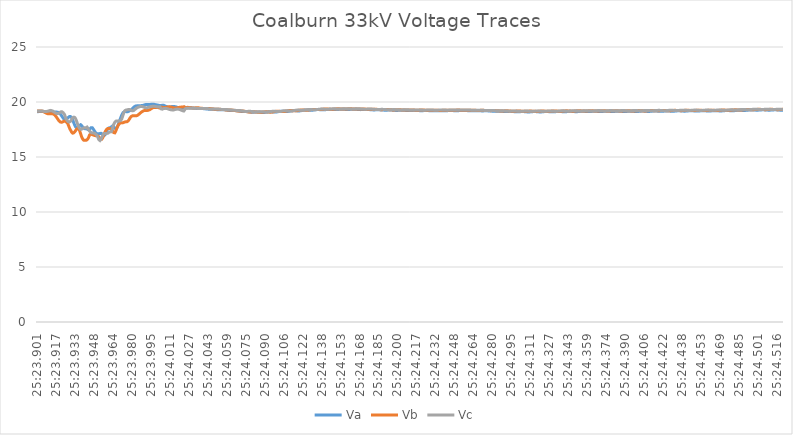
| Category | Va | Vb | Vc |
|---|---|---|---|
| 0.6426377430555555 | 19.121 | 19.184 | 19.178 |
| 0.6426377430555555 | 19.122 | 19.184 | 19.177 |
| 0.6426377430555555 | 19.122 | 19.184 | 19.177 |
| 0.6426377430555555 | 19.123 | 19.184 | 19.176 |
| 0.6426377546296297 | 19.124 | 19.184 | 19.176 |
| 0.6426377546296297 | 19.124 | 19.184 | 19.175 |
| 0.6426377546296297 | 19.124 | 19.184 | 19.175 |
| 0.6426377546296297 | 19.125 | 19.183 | 19.175 |
| 0.6426377546296297 | 19.125 | 19.183 | 19.174 |
| 0.6426377546296297 | 19.125 | 19.183 | 19.174 |
| 0.6426377662037037 | 19.126 | 19.182 | 19.174 |
| 0.6426377662037037 | 19.126 | 19.182 | 19.174 |
| 0.6426377662037037 | 19.127 | 19.182 | 19.174 |
| 0.6426377662037037 | 19.127 | 19.181 | 19.174 |
| 0.6426377662037037 | 19.128 | 19.181 | 19.174 |
| 0.6426377662037037 | 19.128 | 19.18 | 19.174 |
| 0.6426377662037037 | 19.128 | 19.18 | 19.174 |
| 0.6426377777777778 | 19.129 | 19.179 | 19.175 |
| 0.6426377777777778 | 19.129 | 19.179 | 19.175 |
| 0.6426377777777778 | 19.13 | 19.178 | 19.176 |
| 0.6426377777777778 | 19.13 | 19.178 | 19.176 |
| 0.6426377777777778 | 19.13 | 19.177 | 19.176 |
| 0.6426377777777778 | 19.13 | 19.176 | 19.177 |
| 0.6426377893518519 | 19.13 | 19.176 | 19.178 |
| 0.6426377893518519 | 19.13 | 19.176 | 19.178 |
| 0.6426377893518519 | 19.13 | 19.175 | 19.178 |
| 0.6426377893518519 | 19.13 | 19.175 | 19.179 |
| 0.6426377893518519 | 19.13 | 19.174 | 19.179 |
| 0.6426377893518519 | 19.129 | 19.172 | 19.178 |
| 0.6426377893518519 | 19.129 | 19.167 | 19.175 |
| 0.6426378009259259 | 19.129 | 19.161 | 19.172 |
| 0.6426378009259259 | 19.129 | 19.153 | 19.167 |
| 0.6426378009259259 | 19.128 | 19.144 | 19.162 |
| 0.6426378009259259 | 19.127 | 19.134 | 19.158 |
| 0.6426378009259259 | 19.127 | 19.122 | 19.152 |
| 0.6426378009259259 | 19.126 | 19.111 | 19.147 |
| 0.6426378125 | 19.125 | 19.1 | 19.143 |
| 0.6426378125 | 19.125 | 19.089 | 19.14 |
| 0.6426378125 | 19.124 | 19.079 | 19.136 |
| 0.6426378125 | 19.123 | 19.07 | 19.134 |
| 0.6426378125 | 19.122 | 19.062 | 19.132 |
| 0.6426378125 | 19.122 | 19.055 | 19.131 |
| 0.6426378240740741 | 19.121 | 19.048 | 19.13 |
| 0.6426378240740741 | 19.12 | 19.04 | 19.129 |
| 0.6426378240740741 | 19.119 | 19.031 | 19.129 |
| 0.6426378240740741 | 19.118 | 19.022 | 19.129 |
| 0.6426378240740741 | 19.117 | 19.013 | 19.13 |
| 0.6426378240740741 | 19.116 | 19.003 | 19.131 |
| 0.6426378240740741 | 19.115 | 18.993 | 19.133 |
| 0.6426378356481481 | 19.114 | 18.983 | 19.136 |
| 0.6426378356481481 | 19.113 | 18.974 | 19.139 |
| 0.6426378356481481 | 19.113 | 18.965 | 19.143 |
| 0.6426378356481481 | 19.114 | 18.957 | 19.147 |
| 0.6426378356481481 | 19.114 | 18.951 | 19.152 |
| 0.6426378356481481 | 19.115 | 18.946 | 19.156 |
| 0.6426378472222222 | 19.114 | 18.941 | 19.159 |
| 0.6426378472222222 | 19.114 | 18.938 | 19.163 |
| 0.6426378472222222 | 19.116 | 18.935 | 19.167 |
| 0.6426378472222222 | 19.117 | 18.933 | 19.171 |
| 0.6426378472222222 | 19.117 | 18.93 | 19.176 |
| 0.6426378472222222 | 19.116 | 18.928 | 19.181 |
| 0.6426378472222222 | 19.116 | 18.926 | 19.186 |
| 0.6426378587962963 | 19.115 | 18.924 | 19.192 |
| 0.6426378587962963 | 19.115 | 18.923 | 19.198 |
| 0.6426378587962963 | 19.113 | 18.922 | 19.204 |
| 0.6426378587962963 | 19.112 | 18.921 | 19.211 |
| 0.6426378587962963 | 19.11 | 18.921 | 19.218 |
| 0.6426378587962963 | 19.109 | 18.922 | 19.223 |
| 0.6426378703703703 | 19.108 | 18.922 | 19.228 |
| 0.6426378703703703 | 19.106 | 18.923 | 19.232 |
| 0.6426378703703703 | 19.105 | 18.924 | 19.235 |
| 0.6426378703703703 | 19.104 | 18.925 | 19.236 |
| 0.6426378703703703 | 19.101 | 18.926 | 19.237 |
| 0.6426378703703703 | 19.099 | 18.927 | 19.236 |
| 0.6426378819444444 | 19.097 | 18.927 | 19.234 |
| 0.6426378819444444 | 19.095 | 18.928 | 19.231 |
| 0.6426378819444444 | 19.092 | 18.928 | 19.227 |
| 0.6426378819444444 | 19.089 | 18.928 | 19.221 |
| 0.6426378819444444 | 19.087 | 18.928 | 19.215 |
| 0.6426378819444444 | 19.084 | 18.928 | 19.21 |
| 0.6426378819444444 | 19.082 | 18.927 | 19.203 |
| 0.6426378935185185 | 19.08 | 18.926 | 19.195 |
| 0.6426378935185185 | 19.078 | 18.925 | 19.187 |
| 0.6426378935185185 | 19.077 | 18.922 | 19.179 |
| 0.6426378935185185 | 19.076 | 18.919 | 19.17 |
| 0.6426378935185185 | 19.075 | 18.915 | 19.16 |
| 0.6426378935185185 | 19.075 | 18.909 | 19.149 |
| 0.6426379050925927 | 19.075 | 18.902 | 19.138 |
| 0.6426379050925927 | 19.075 | 18.894 | 19.126 |
| 0.6426379050925927 | 19.075 | 18.885 | 19.114 |
| 0.6426379050925927 | 19.076 | 18.874 | 19.101 |
| 0.6426379050925927 | 19.077 | 18.861 | 19.087 |
| 0.6426379050925927 | 19.078 | 18.847 | 19.074 |
| 0.6426379050925927 | 19.079 | 18.832 | 19.061 |
| 0.6426379166666667 | 19.079 | 18.816 | 19.048 |
| 0.6426379166666667 | 19.081 | 18.798 | 19.035 |
| 0.6426379166666667 | 19.082 | 18.78 | 19.023 |
| 0.6426379166666667 | 19.082 | 18.76 | 19.011 |
| 0.6426379166666667 | 19.083 | 18.74 | 19 |
| 0.6426379166666667 | 19.083 | 18.719 | 18.99 |
| 0.6426379282407407 | 19.084 | 18.697 | 18.981 |
| 0.6426379282407407 | 19.084 | 18.675 | 18.973 |
| 0.6426379282407407 | 19.084 | 18.652 | 18.965 |
| 0.6426379282407407 | 19.083 | 18.628 | 18.959 |
| 0.6426379282407407 | 19.083 | 18.604 | 18.954 |
| 0.6426379282407407 | 19.082 | 18.58 | 18.949 |
| 0.6426379398148149 | 19.082 | 18.555 | 18.946 |
| 0.6426379398148149 | 19.08 | 18.529 | 18.945 |
| 0.6426379398148149 | 19.079 | 18.502 | 18.944 |
| 0.6426379398148149 | 19.076 | 18.475 | 18.946 |
| 0.6426379398148149 | 19.073 | 18.448 | 18.949 |
| 0.6426379398148149 | 19.069 | 18.421 | 18.953 |
| 0.6426379398148149 | 19.064 | 18.396 | 18.958 |
| 0.6426379513888889 | 19.058 | 18.371 | 18.965 |
| 0.6426379513888889 | 19.051 | 18.347 | 18.972 |
| 0.6426379513888889 | 19.042 | 18.325 | 18.981 |
| 0.6426379513888889 | 19.032 | 18.303 | 18.989 |
| 0.6426379513888889 | 19.02 | 18.283 | 18.999 |
| 0.6426379513888889 | 19.006 | 18.264 | 19.008 |
| 0.6426379629629629 | 18.991 | 18.247 | 19.017 |
| 0.6426379629629629 | 18.976 | 18.23 | 19.028 |
| 0.6426379629629629 | 18.959 | 18.215 | 19.039 |
| 0.6426379629629629 | 18.942 | 18.201 | 19.052 |
| 0.6426379629629629 | 18.923 | 18.188 | 19.065 |
| 0.6426379629629629 | 18.903 | 18.178 | 19.077 |
| 0.6426379629629629 | 18.882 | 18.169 | 19.09 |
| 0.6426379745370371 | 18.861 | 18.163 | 19.103 |
| 0.6426379745370371 | 18.838 | 18.159 | 19.113 |
| 0.6426379745370371 | 18.814 | 18.156 | 19.12 |
| 0.6426379745370371 | 18.789 | 18.156 | 19.125 |
| 0.6426379745370371 | 18.762 | 18.157 | 19.125 |
| 0.6426379745370371 | 18.734 | 18.16 | 19.123 |
| 0.6426379861111111 | 18.707 | 18.164 | 19.117 |
| 0.6426379861111111 | 18.679 | 18.169 | 19.108 |
| 0.6426379861111111 | 18.652 | 18.175 | 19.097 |
| 0.6426379861111111 | 18.625 | 18.183 | 19.084 |
| 0.6426379861111111 | 18.6 | 18.191 | 19.071 |
| 0.6426379861111111 | 18.576 | 18.2 | 19.056 |
| 0.6426379976851851 | 18.553 | 18.209 | 19.04 |
| 0.6426379976851851 | 18.533 | 18.219 | 19.024 |
| 0.6426379976851851 | 18.514 | 18.229 | 19.008 |
| 0.6426379976851851 | 18.497 | 18.24 | 18.992 |
| 0.6426379976851851 | 18.482 | 18.25 | 18.974 |
| 0.6426379976851851 | 18.468 | 18.259 | 18.951 |
| 0.6426379976851851 | 18.455 | 18.265 | 18.924 |
| 0.6426380092592593 | 18.444 | 18.269 | 18.891 |
| 0.6426380092592593 | 18.434 | 18.27 | 18.854 |
| 0.6426380092592593 | 18.427 | 18.269 | 18.813 |
| 0.6426380092592593 | 18.422 | 18.265 | 18.768 |
| 0.6426380092592593 | 18.419 | 18.259 | 18.72 |
| 0.6426380092592593 | 18.419 | 18.249 | 18.671 |
| 0.6426380208333333 | 18.421 | 18.239 | 18.623 |
| 0.6426380208333333 | 18.425 | 18.226 | 18.576 |
| 0.6426380208333333 | 18.432 | 18.214 | 18.531 |
| 0.6426380208333333 | 18.44 | 18.2 | 18.489 |
| 0.6426380208333333 | 18.45 | 18.187 | 18.451 |
| 0.6426380208333333 | 18.46 | 18.176 | 18.419 |
| 0.6426380208333333 | 18.47 | 18.165 | 18.391 |
| 0.6426380324074074 | 18.481 | 18.153 | 18.366 |
| 0.6426380324074074 | 18.491 | 18.137 | 18.342 |
| 0.6426380324074074 | 18.501 | 18.119 | 18.32 |
| 0.6426380324074074 | 18.512 | 18.097 | 18.298 |
| 0.6426380324074074 | 18.524 | 18.072 | 18.277 |
| 0.6426380324074074 | 18.538 | 18.043 | 18.256 |
| 0.6426380439814815 | 18.553 | 18.008 | 18.237 |
| 0.6426380439814815 | 18.569 | 17.97 | 18.219 |
| 0.6426380439814815 | 18.587 | 17.928 | 18.204 |
| 0.6426380439814815 | 18.605 | 17.884 | 18.193 |
| 0.6426380439814815 | 18.622 | 17.837 | 18.184 |
| 0.6426380439814815 | 18.639 | 17.789 | 18.18 |
| 0.6426380555555555 | 18.654 | 17.743 | 18.178 |
| 0.6426380555555555 | 18.667 | 17.699 | 18.18 |
| 0.6426380555555555 | 18.676 | 17.657 | 18.185 |
| 0.6426380555555555 | 18.682 | 17.619 | 18.192 |
| 0.6426380555555555 | 18.686 | 17.583 | 18.2 |
| 0.6426380555555555 | 18.686 | 17.549 | 18.21 |
| 0.6426380555555555 | 18.683 | 17.516 | 18.222 |
| 0.6426380671296296 | 18.679 | 17.484 | 18.235 |
| 0.6426380671296296 | 18.672 | 17.452 | 18.251 |
| 0.6426380671296296 | 18.664 | 17.42 | 18.269 |
| 0.6426380671296296 | 18.652 | 17.387 | 18.29 |
| 0.6426380671296296 | 18.637 | 17.355 | 18.314 |
| 0.6426380671296296 | 18.62 | 17.322 | 18.342 |
| 0.6426380787037037 | 18.6 | 17.29 | 18.373 |
| 0.6426380787037037 | 18.578 | 17.261 | 18.407 |
| 0.6426380787037037 | 18.551 | 17.235 | 18.441 |
| 0.6426380787037037 | 18.519 | 17.212 | 18.474 |
| 0.6426380787037037 | 18.484 | 17.194 | 18.504 |
| 0.6426380787037037 | 18.446 | 17.18 | 18.532 |
| 0.6426380787037037 | 18.404 | 17.17 | 18.556 |
| 0.6426380902777779 | 18.359 | 17.165 | 18.576 |
| 0.6426380902777779 | 18.312 | 17.163 | 18.592 |
| 0.6426380902777779 | 18.264 | 17.165 | 18.605 |
| 0.6426380902777779 | 18.217 | 17.171 | 18.614 |
| 0.6426380902777779 | 18.169 | 17.18 | 18.62 |
| 0.6426380902777779 | 18.123 | 17.191 | 18.624 |
| 0.6426381018518519 | 18.078 | 17.205 | 18.625 |
| 0.6426381018518519 | 18.034 | 17.222 | 18.624 |
| 0.6426381018518519 | 17.992 | 17.241 | 18.622 |
| 0.6426381018518519 | 17.953 | 17.261 | 18.616 |
| 0.6426381018518519 | 17.914 | 17.282 | 18.605 |
| 0.6426381018518519 | 17.877 | 17.303 | 18.59 |
| 0.6426381134259259 | 17.842 | 17.326 | 18.571 |
| 0.6426381134259259 | 17.807 | 17.35 | 18.548 |
| 0.6426381134259259 | 17.775 | 17.374 | 18.52 |
| 0.6426381134259259 | 17.746 | 17.4 | 18.488 |
| 0.6426381134259259 | 17.719 | 17.425 | 18.451 |
| 0.6426381134259259 | 17.695 | 17.451 | 18.411 |
| 0.6426381134259259 | 17.676 | 17.476 | 18.367 |
| 0.6426381250000001 | 17.66 | 17.5 | 18.321 |
| 0.6426381250000001 | 17.649 | 17.522 | 18.273 |
| 0.6426381250000001 | 17.642 | 17.543 | 18.224 |
| 0.6426381250000001 | 17.638 | 17.561 | 18.175 |
| 0.6426381250000001 | 17.639 | 17.577 | 18.126 |
| 0.6426381250000001 | 17.643 | 17.59 | 18.078 |
| 0.6426381365740741 | 17.651 | 17.599 | 18.03 |
| 0.6426381365740741 | 17.662 | 17.604 | 17.983 |
| 0.6426381365740741 | 17.675 | 17.605 | 17.938 |
| 0.6426381365740741 | 17.69 | 17.601 | 17.894 |
| 0.6426381365740741 | 17.708 | 17.593 | 17.851 |
| 0.6426381365740741 | 17.726 | 17.58 | 17.809 |
| 0.6426381365740741 | 17.747 | 17.563 | 17.77 |
| 0.6426381481481481 | 17.768 | 17.542 | 17.732 |
| 0.6426381481481481 | 17.79 | 17.517 | 17.696 |
| 0.6426381481481481 | 17.813 | 17.486 | 17.662 |
| 0.6426381481481481 | 17.836 | 17.449 | 17.63 |
| 0.6426381481481481 | 17.859 | 17.409 | 17.602 |
| 0.6426381481481481 | 17.881 | 17.366 | 17.577 |
| 0.6426381597222223 | 17.899 | 17.318 | 17.557 |
| 0.6426381597222223 | 17.914 | 17.267 | 17.541 |
| 0.6426381597222223 | 17.925 | 17.213 | 17.528 |
| 0.6426381597222223 | 17.932 | 17.158 | 17.52 |
| 0.6426381597222223 | 17.934 | 17.102 | 17.515 |
| 0.6426381597222223 | 17.931 | 17.047 | 17.514 |
| 0.6426381712962963 | 17.923 | 16.993 | 17.516 |
| 0.6426381712962963 | 17.91 | 16.94 | 17.519 |
| 0.6426381712962963 | 17.892 | 16.891 | 17.525 |
| 0.6426381712962963 | 17.871 | 16.844 | 17.531 |
| 0.6426381712962963 | 17.846 | 16.801 | 17.538 |
| 0.6426381712962963 | 17.819 | 16.76 | 17.546 |
| 0.6426381712962963 | 17.79 | 16.722 | 17.554 |
| 0.6426381828703703 | 17.76 | 16.687 | 17.563 |
| 0.6426381828703703 | 17.731 | 16.656 | 17.571 |
| 0.6426381828703703 | 17.703 | 16.628 | 17.581 |
| 0.6426381828703703 | 17.678 | 16.601 | 17.593 |
| 0.6426381828703703 | 17.657 | 16.578 | 17.606 |
| 0.6426381828703703 | 17.639 | 16.558 | 17.621 |
| 0.6426381944444445 | 17.625 | 16.543 | 17.635 |
| 0.6426381944444445 | 17.613 | 16.531 | 17.647 |
| 0.6426381944444445 | 17.603 | 16.523 | 17.657 |
| 0.6426381944444445 | 17.596 | 16.518 | 17.664 |
| 0.6426381944444445 | 17.589 | 16.516 | 17.666 |
| 0.6426381944444445 | 17.584 | 16.515 | 17.664 |
| 0.6426381944444445 | 17.579 | 16.515 | 17.659 |
| 0.6426382060185185 | 17.573 | 16.515 | 17.652 |
| 0.6426382060185185 | 17.568 | 16.515 | 17.644 |
| 0.6426382060185185 | 17.565 | 16.516 | 17.636 |
| 0.6426382060185185 | 17.564 | 16.515 | 17.632 |
| 0.6426382060185185 | 17.566 | 16.515 | 17.632 |
| 0.6426382060185185 | 17.568 | 16.516 | 17.636 |
| 0.6426382175925925 | 17.571 | 16.517 | 17.645 |
| 0.6426382175925925 | 17.575 | 16.519 | 17.659 |
| 0.6426382175925925 | 17.578 | 16.523 | 17.675 |
| 0.6426382175925925 | 17.579 | 16.529 | 17.692 |
| 0.6426382175925925 | 17.575 | 16.538 | 17.706 |
| 0.6426382175925925 | 17.568 | 16.549 | 17.716 |
| 0.6426382291666667 | 17.558 | 16.563 | 17.72 |
| 0.6426382291666667 | 17.543 | 16.579 | 17.715 |
| 0.6426382291666667 | 17.526 | 16.598 | 17.7 |
| 0.6426382291666667 | 17.507 | 16.619 | 17.675 |
| 0.6426382291666667 | 17.49 | 16.643 | 17.643 |
| 0.6426382291666667 | 17.476 | 16.669 | 17.607 |
| 0.6426382291666667 | 17.465 | 16.698 | 17.568 |
| 0.6426382407407407 | 17.46 | 16.731 | 17.529 |
| 0.6426382407407407 | 17.46 | 16.768 | 17.491 |
| 0.6426382407407407 | 17.465 | 16.81 | 17.458 |
| 0.6426382407407407 | 17.474 | 16.853 | 17.429 |
| 0.6426382407407407 | 17.488 | 16.897 | 17.403 |
| 0.6426382407407407 | 17.504 | 16.94 | 17.38 |
| 0.6426382523148148 | 17.522 | 16.98 | 17.359 |
| 0.6426382523148148 | 17.541 | 17.016 | 17.342 |
| 0.6426382523148148 | 17.559 | 17.045 | 17.325 |
| 0.6426382523148148 | 17.577 | 17.068 | 17.309 |
| 0.6426382523148148 | 17.595 | 17.083 | 17.291 |
| 0.6426382523148148 | 17.611 | 17.09 | 17.273 |
| 0.6426382523148148 | 17.626 | 17.09 | 17.256 |
| 0.6426382638888889 | 17.64 | 17.086 | 17.239 |
| 0.6426382638888889 | 17.654 | 17.08 | 17.223 |
| 0.6426382638888889 | 17.667 | 17.072 | 17.209 |
| 0.6426382638888889 | 17.676 | 17.062 | 17.199 |
| 0.6426382638888889 | 17.682 | 17.053 | 17.193 |
| 0.6426382638888889 | 17.683 | 17.045 | 17.19 |
| 0.6426382754629629 | 17.681 | 17.04 | 17.19 |
| 0.6426382754629629 | 17.673 | 17.035 | 17.191 |
| 0.6426382754629629 | 17.66 | 17.03 | 17.192 |
| 0.6426382754629629 | 17.643 | 17.026 | 17.193 |
| 0.6426382754629629 | 17.621 | 17.023 | 17.194 |
| 0.6426382754629629 | 17.597 | 17.02 | 17.193 |
| 0.6426382870370371 | 17.571 | 17.015 | 17.192 |
| 0.6426382870370371 | 17.545 | 17.008 | 17.189 |
| 0.6426382870370371 | 17.517 | 17.001 | 17.186 |
| 0.6426382870370371 | 17.49 | 16.993 | 17.182 |
| 0.6426382870370371 | 17.462 | 16.984 | 17.178 |
| 0.6426382870370371 | 17.436 | 16.976 | 17.174 |
| 0.6426382870370371 | 17.409 | 16.968 | 17.168 |
| 0.6426382986111111 | 17.382 | 16.961 | 17.162 |
| 0.6426382986111111 | 17.354 | 16.954 | 17.155 |
| 0.6426382986111111 | 17.327 | 16.948 | 17.147 |
| 0.6426382986111111 | 17.301 | 16.944 | 17.138 |
| 0.6426382986111111 | 17.274 | 16.941 | 17.127 |
| 0.6426382986111111 | 17.247 | 16.939 | 17.112 |
| 0.6426383101851852 | 17.221 | 16.938 | 17.096 |
| 0.6426383101851852 | 17.198 | 16.938 | 17.078 |
| 0.6426383101851852 | 17.178 | 16.939 | 17.059 |
| 0.6426383101851852 | 17.16 | 16.939 | 17.04 |
| 0.6426383101851852 | 17.144 | 16.94 | 17.021 |
| 0.6426383101851852 | 17.133 | 16.941 | 17.002 |
| 0.6426383101851852 | 17.126 | 16.941 | 16.984 |
| 0.6426383217592593 | 17.122 | 16.94 | 16.965 |
| 0.6426383217592593 | 17.119 | 16.939 | 16.944 |
| 0.6426383217592593 | 17.117 | 16.936 | 16.92 |
| 0.6426383217592593 | 17.115 | 16.932 | 16.892 |
| 0.6426383217592593 | 17.114 | 16.926 | 16.86 |
| 0.6426383217592593 | 17.112 | 16.917 | 16.824 |
| 0.6426383333333333 | 17.109 | 16.907 | 16.784 |
| 0.6426383333333333 | 17.106 | 16.894 | 16.74 |
| 0.6426383333333333 | 17.104 | 16.879 | 16.694 |
| 0.6426383333333333 | 17.101 | 16.862 | 16.651 |
| 0.6426383333333333 | 17.1 | 16.846 | 16.611 |
| 0.6426383333333333 | 17.101 | 16.828 | 16.575 |
| 0.6426383449074075 | 17.103 | 16.809 | 16.544 |
| 0.6426383449074075 | 17.108 | 16.788 | 16.518 |
| 0.6426383449074075 | 17.115 | 16.765 | 16.501 |
| 0.6426383449074075 | 17.123 | 16.743 | 16.492 |
| 0.6426383449074075 | 17.132 | 16.72 | 16.49 |
| 0.6426383449074075 | 17.14 | 16.696 | 16.495 |
| 0.6426383449074075 | 17.147 | 16.674 | 16.506 |
| 0.6426383564814815 | 17.152 | 16.653 | 16.523 |
| 0.6426383564814815 | 17.156 | 16.636 | 16.547 |
| 0.6426383564814815 | 17.157 | 16.622 | 16.575 |
| 0.6426383564814815 | 17.156 | 16.611 | 16.605 |
| 0.6426383564814815 | 17.153 | 16.605 | 16.639 |
| 0.6426383564814815 | 17.148 | 16.603 | 16.676 |
| 0.6426383680555555 | 17.141 | 16.606 | 16.716 |
| 0.6426383680555555 | 17.132 | 16.615 | 16.757 |
| 0.6426383680555555 | 17.121 | 16.628 | 16.799 |
| 0.6426383680555555 | 17.109 | 16.647 | 16.84 |
| 0.6426383680555555 | 17.096 | 16.672 | 16.881 |
| 0.6426383680555555 | 17.083 | 16.7 | 16.92 |
| 0.6426383680555555 | 17.069 | 16.731 | 16.955 |
| 0.6426383796296297 | 17.056 | 16.765 | 16.987 |
| 0.6426383796296297 | 17.043 | 16.803 | 17.016 |
| 0.6426383796296297 | 17.03 | 16.844 | 17.043 |
| 0.6426383796296297 | 17.016 | 16.887 | 17.068 |
| 0.6426383796296297 | 17.003 | 16.93 | 17.089 |
| 0.6426383796296297 | 16.992 | 16.975 | 17.106 |
| 0.6426383912037037 | 16.984 | 17.021 | 17.12 |
| 0.6426383912037037 | 16.978 | 17.066 | 17.13 |
| 0.6426383912037037 | 16.976 | 17.111 | 17.136 |
| 0.6426383912037037 | 16.978 | 17.154 | 17.139 |
| 0.6426383912037037 | 16.985 | 17.196 | 17.14 |
| 0.6426383912037037 | 16.998 | 17.236 | 17.139 |
| 0.6426384027777777 | 17.016 | 17.274 | 17.137 |
| 0.6426384027777777 | 17.039 | 17.31 | 17.134 |
| 0.6426384027777777 | 17.069 | 17.343 | 17.132 |
| 0.6426384027777777 | 17.103 | 17.375 | 17.13 |
| 0.6426384027777777 | 17.142 | 17.405 | 17.129 |
| 0.6426384027777777 | 17.183 | 17.433 | 17.128 |
| 0.6426384027777777 | 17.227 | 17.459 | 17.129 |
| 0.6426384143518519 | 17.274 | 17.483 | 17.131 |
| 0.6426384143518519 | 17.322 | 17.504 | 17.135 |
| 0.6426384143518519 | 17.368 | 17.522 | 17.14 |
| 0.6426384143518519 | 17.411 | 17.539 | 17.144 |
| 0.6426384143518519 | 17.451 | 17.554 | 17.146 |
| 0.6426384143518519 | 17.488 | 17.566 | 17.149 |
| 0.6426384259259259 | 17.521 | 17.576 | 17.153 |
| 0.6426384259259259 | 17.549 | 17.583 | 17.158 |
| 0.6426384259259259 | 17.573 | 17.588 | 17.163 |
| 0.6426384259259259 | 17.593 | 17.591 | 17.169 |
| 0.6426384259259259 | 17.61 | 17.592 | 17.179 |
| 0.6426384259259259 | 17.624 | 17.592 | 17.192 |
| 0.6426384259259259 | 17.635 | 17.591 | 17.207 |
| 0.6426384374999999 | 17.644 | 17.59 | 17.224 |
| 0.6426384374999999 | 17.651 | 17.59 | 17.241 |
| 0.6426384374999999 | 17.656 | 17.59 | 17.257 |
| 0.6426384374999999 | 17.658 | 17.59 | 17.271 |
| 0.6426384374999999 | 17.66 | 17.591 | 17.282 |
| 0.6426384374999999 | 17.662 | 17.592 | 17.288 |
| 0.6426384490740741 | 17.662 | 17.592 | 17.289 |
| 0.6426384490740741 | 17.663 | 17.591 | 17.285 |
| 0.6426384490740741 | 17.665 | 17.588 | 17.278 |
| 0.6426384490740741 | 17.67 | 17.582 | 17.271 |
| 0.6426384490740741 | 17.678 | 17.575 | 17.266 |
| 0.6426384490740741 | 17.689 | 17.565 | 17.265 |
| 0.6426384606481481 | 17.704 | 17.553 | 17.272 |
| 0.6426384606481481 | 17.721 | 17.539 | 17.287 |
| 0.6426384606481481 | 17.742 | 17.523 | 17.313 |
| 0.6426384606481481 | 17.763 | 17.505 | 17.349 |
| 0.6426384606481481 | 17.783 | 17.485 | 17.394 |
| 0.6426384606481481 | 17.801 | 17.464 | 17.448 |
| 0.6426384606481481 | 17.815 | 17.442 | 17.507 |
| 0.6426384722222223 | 17.823 | 17.417 | 17.569 |
| 0.6426384722222223 | 17.826 | 17.39 | 17.632 |
| 0.6426384722222223 | 17.824 | 17.361 | 17.694 |
| 0.6426384722222223 | 17.816 | 17.331 | 17.753 |
| 0.6426384722222223 | 17.803 | 17.301 | 17.81 |
| 0.6426384722222223 | 17.786 | 17.271 | 17.863 |
| 0.6426384837962963 | 17.765 | 17.244 | 17.911 |
| 0.6426384837962963 | 17.744 | 17.22 | 17.956 |
| 0.6426384837962963 | 17.721 | 17.2 | 17.996 |
| 0.6426384837962963 | 17.698 | 17.186 | 18.034 |
| 0.6426384837962963 | 17.675 | 17.177 | 18.069 |
| 0.6426384837962963 | 17.653 | 17.176 | 18.101 |
| 0.6426384837962963 | 17.633 | 17.182 | 18.13 |
| 0.6426384953703704 | 17.615 | 17.197 | 18.157 |
| 0.6426384953703704 | 17.599 | 17.218 | 18.182 |
| 0.6426384953703704 | 17.586 | 17.246 | 18.204 |
| 0.6426384953703704 | 17.577 | 17.279 | 18.224 |
| 0.6426384953703704 | 17.572 | 17.316 | 18.24 |
| 0.6426384953703704 | 17.571 | 17.357 | 18.254 |
| 0.6426385069444445 | 17.575 | 17.401 | 18.264 |
| 0.6426385069444445 | 17.584 | 17.446 | 18.272 |
| 0.6426385069444445 | 17.598 | 17.492 | 18.278 |
| 0.6426385069444445 | 17.618 | 17.537 | 18.281 |
| 0.6426385069444445 | 17.643 | 17.583 | 18.283 |
| 0.6426385069444445 | 17.673 | 17.626 | 18.283 |
| 0.6426385185185185 | 17.705 | 17.668 | 18.283 |
| 0.6426385185185185 | 17.741 | 17.707 | 18.283 |
| 0.6426385185185185 | 17.78 | 17.745 | 18.282 |
| 0.6426385185185185 | 17.821 | 17.78 | 18.282 |
| 0.6426385185185185 | 17.863 | 17.814 | 18.282 |
| 0.6426385185185185 | 17.905 | 17.846 | 18.282 |
| 0.6426385185185185 | 17.949 | 17.877 | 18.282 |
| 0.6426385300925926 | 17.994 | 17.907 | 18.281 |
| 0.6426385300925926 | 18.039 | 17.935 | 18.28 |
| 0.6426385300925926 | 18.083 | 17.962 | 18.279 |
| 0.6426385300925926 | 18.128 | 17.986 | 18.278 |
| 0.6426385300925926 | 18.176 | 18.008 | 18.277 |
| 0.6426385300925926 | 18.224 | 18.029 | 18.277 |
| 0.6426385416666667 | 18.272 | 18.046 | 18.278 |
| 0.6426385416666667 | 18.32 | 18.062 | 18.279 |
| 0.6426385416666667 | 18.369 | 18.075 | 18.281 |
| 0.6426385416666667 | 18.417 | 18.086 | 18.285 |
| 0.6426385416666667 | 18.466 | 18.094 | 18.291 |
| 0.6426385416666667 | 18.514 | 18.1 | 18.299 |
| 0.6426385416666667 | 18.56 | 18.104 | 18.311 |
| 0.6426385532407407 | 18.605 | 18.106 | 18.326 |
| 0.6426385532407407 | 18.649 | 18.106 | 18.345 |
| 0.6426385532407407 | 18.692 | 18.105 | 18.369 |
| 0.6426385532407407 | 18.734 | 18.104 | 18.399 |
| 0.6426385532407407 | 18.774 | 18.103 | 18.434 |
| 0.6426385532407407 | 18.812 | 18.101 | 18.473 |
| 0.6426385648148148 | 18.849 | 18.101 | 18.517 |
| 0.6426385648148148 | 18.885 | 18.101 | 18.566 |
| 0.6426385648148148 | 18.919 | 18.102 | 18.618 |
| 0.6426385648148148 | 18.951 | 18.103 | 18.671 |
| 0.6426385648148148 | 18.981 | 18.105 | 18.724 |
| 0.6426385648148148 | 19.007 | 18.109 | 18.779 |
| 0.6426385763888889 | 19.03 | 18.115 | 18.834 |
| 0.6426385763888889 | 19.051 | 18.122 | 18.887 |
| 0.6426385763888889 | 19.068 | 18.129 | 18.939 |
| 0.6426385763888889 | 19.083 | 18.137 | 18.987 |
| 0.6426385763888889 | 19.095 | 18.145 | 19.032 |
| 0.6426385763888889 | 19.105 | 18.154 | 19.075 |
| 0.6426385763888889 | 19.113 | 18.163 | 19.113 |
| 0.6426385879629629 | 19.119 | 18.171 | 19.147 |
| 0.6426385879629629 | 19.123 | 18.178 | 19.176 |
| 0.6426385879629629 | 19.126 | 18.183 | 19.201 |
| 0.6426385879629629 | 19.127 | 18.188 | 19.222 |
| 0.6426385879629629 | 19.128 | 18.192 | 19.238 |
| 0.6426385879629629 | 19.128 | 18.195 | 19.25 |
| 0.6426385995370371 | 19.127 | 18.197 | 19.258 |
| 0.6426385995370371 | 19.127 | 18.197 | 19.263 |
| 0.6426385995370371 | 19.126 | 18.197 | 19.267 |
| 0.6426385995370371 | 19.125 | 18.197 | 19.269 |
| 0.6426385995370371 | 19.125 | 18.196 | 19.271 |
| 0.6426385995370371 | 19.123 | 18.197 | 19.274 |
| 0.6426385995370371 | 19.122 | 18.199 | 19.279 |
| 0.6426386111111111 | 19.12 | 18.202 | 19.284 |
| 0.6426386111111111 | 19.118 | 18.206 | 19.288 |
| 0.6426386111111111 | 19.117 | 18.212 | 19.292 |
| 0.6426386111111111 | 19.117 | 18.221 | 19.296 |
| 0.6426386111111111 | 19.118 | 18.234 | 19.3 |
| 0.6426386111111111 | 19.121 | 18.248 | 19.304 |
| 0.6426386226851851 | 19.124 | 18.263 | 19.307 |
| 0.6426386226851851 | 19.129 | 18.281 | 19.31 |
| 0.6426386226851851 | 19.135 | 18.302 | 19.313 |
| 0.6426386226851851 | 19.143 | 18.325 | 19.315 |
| 0.6426386226851851 | 19.152 | 18.349 | 19.317 |
| 0.6426386226851851 | 19.163 | 18.376 | 19.318 |
| 0.6426386342592593 | 19.174 | 18.404 | 19.318 |
| 0.6426386342592593 | 19.186 | 18.433 | 19.317 |
| 0.6426386342592593 | 19.198 | 18.461 | 19.315 |
| 0.6426386342592593 | 19.209 | 18.489 | 19.311 |
| 0.6426386342592593 | 19.219 | 18.517 | 19.307 |
| 0.6426386342592593 | 19.23 | 18.544 | 19.3 |
| 0.6426386342592593 | 19.24 | 18.57 | 19.293 |
| 0.6426386458333333 | 19.248 | 18.594 | 19.283 |
| 0.6426386458333333 | 19.255 | 18.617 | 19.272 |
| 0.6426386458333333 | 19.265 | 18.639 | 19.261 |
| 0.6426386458333333 | 19.275 | 18.659 | 19.25 |
| 0.6426386458333333 | 19.287 | 18.675 | 19.239 |
| 0.6426386458333333 | 19.299 | 18.689 | 19.23 |
| 0.6426386574074074 | 19.314 | 18.702 | 19.221 |
| 0.6426386574074074 | 19.331 | 18.714 | 19.214 |
| 0.6426386574074074 | 19.349 | 18.724 | 19.208 |
| 0.6426386574074074 | 19.368 | 18.731 | 19.204 |
| 0.6426386574074074 | 19.387 | 18.737 | 19.202 |
| 0.6426386574074074 | 19.406 | 18.742 | 19.2 |
| 0.6426386574074074 | 19.427 | 18.746 | 19.199 |
| 0.6426386689814815 | 19.447 | 18.748 | 19.2 |
| 0.6426386689814815 | 19.466 | 18.749 | 19.202 |
| 0.6426386689814815 | 19.484 | 18.749 | 19.207 |
| 0.6426386689814815 | 19.501 | 18.748 | 19.213 |
| 0.6426386689814815 | 19.517 | 18.747 | 19.22 |
| 0.6426386689814815 | 19.531 | 18.746 | 19.231 |
| 0.6426386805555556 | 19.546 | 18.745 | 19.243 |
| 0.6426386805555556 | 19.558 | 18.744 | 19.257 |
| 0.6426386805555556 | 19.57 | 18.744 | 19.272 |
| 0.6426386805555556 | 19.582 | 18.743 | 19.288 |
| 0.6426386805555556 | 19.594 | 18.742 | 19.304 |
| 0.6426386805555556 | 19.605 | 18.741 | 19.322 |
| 0.6426386921296297 | 19.615 | 18.74 | 19.338 |
| 0.6426386921296297 | 19.623 | 18.74 | 19.354 |
| 0.6426386921296297 | 19.63 | 18.74 | 19.368 |
| 0.6426386921296297 | 19.636 | 18.74 | 19.381 |
| 0.6426386921296297 | 19.64 | 18.741 | 19.393 |
| 0.6426386921296297 | 19.644 | 18.742 | 19.405 |
| 0.6426386921296297 | 19.646 | 18.745 | 19.418 |
| 0.6426387037037037 | 19.648 | 18.749 | 19.429 |
| 0.6426387037037037 | 19.649 | 18.754 | 19.441 |
| 0.6426387037037037 | 19.65 | 18.76 | 19.453 |
| 0.6426387037037037 | 19.651 | 18.767 | 19.465 |
| 0.6426387037037037 | 19.651 | 18.775 | 19.476 |
| 0.6426387037037037 | 19.651 | 18.784 | 19.487 |
| 0.6426387152777778 | 19.651 | 18.794 | 19.497 |
| 0.6426387152777778 | 19.651 | 18.805 | 19.506 |
| 0.6426387152777778 | 19.651 | 18.817 | 19.515 |
| 0.6426387152777778 | 19.651 | 18.829 | 19.522 |
| 0.6426387152777778 | 19.652 | 18.841 | 19.528 |
| 0.6426387152777778 | 19.654 | 18.854 | 19.534 |
| 0.6426387152777778 | 19.655 | 18.867 | 19.54 |
| 0.6426387268518519 | 19.656 | 18.881 | 19.547 |
| 0.6426387268518519 | 19.657 | 18.896 | 19.553 |
| 0.6426387268518519 | 19.658 | 18.911 | 19.559 |
| 0.6426387268518519 | 19.66 | 18.926 | 19.565 |
| 0.6426387268518519 | 19.662 | 18.941 | 19.57 |
| 0.6426387268518519 | 19.664 | 18.956 | 19.574 |
| 0.6426387384259259 | 19.666 | 18.972 | 19.578 |
| 0.6426387384259259 | 19.668 | 18.988 | 19.582 |
| 0.6426387384259259 | 19.67 | 19.004 | 19.586 |
| 0.6426387384259259 | 19.67 | 19.019 | 19.589 |
| 0.6426387384259259 | 19.671 | 19.034 | 19.591 |
| 0.6426387384259259 | 19.671 | 19.048 | 19.592 |
| 0.64263875 | 19.671 | 19.062 | 19.593 |
| 0.64263875 | 19.672 | 19.075 | 19.592 |
| 0.64263875 | 19.672 | 19.087 | 19.591 |
| 0.64263875 | 19.672 | 19.098 | 19.59 |
| 0.64263875 | 19.673 | 19.109 | 19.588 |
| 0.64263875 | 19.675 | 19.12 | 19.585 |
| 0.64263875 | 19.676 | 19.13 | 19.582 |
| 0.6426387615740741 | 19.679 | 19.14 | 19.579 |
| 0.6426387615740741 | 19.683 | 19.151 | 19.575 |
| 0.6426387615740741 | 19.686 | 19.162 | 19.57 |
| 0.6426387615740741 | 19.691 | 19.172 | 19.564 |
| 0.6426387615740741 | 19.696 | 19.183 | 19.557 |
| 0.6426387615740741 | 19.702 | 19.193 | 19.551 |
| 0.6426387731481481 | 19.708 | 19.201 | 19.544 |
| 0.6426387731481481 | 19.715 | 19.209 | 19.537 |
| 0.6426387731481481 | 19.722 | 19.215 | 19.53 |
| 0.6426387731481481 | 19.729 | 19.221 | 19.524 |
| 0.6426387731481481 | 19.736 | 19.225 | 19.518 |
| 0.6426387731481481 | 19.742 | 19.228 | 19.511 |
| 0.6426387731481481 | 19.747 | 19.231 | 19.505 |
| 0.6426387847222222 | 19.752 | 19.233 | 19.497 |
| 0.6426387847222222 | 19.756 | 19.234 | 19.491 |
| 0.6426387847222222 | 19.759 | 19.234 | 19.484 |
| 0.6426387847222222 | 19.762 | 19.234 | 19.478 |
| 0.6426387847222222 | 19.764 | 19.233 | 19.472 |
| 0.6426387847222222 | 19.766 | 19.233 | 19.468 |
| 0.6426387962962963 | 19.767 | 19.232 | 19.465 |
| 0.6426387962962963 | 19.768 | 19.231 | 19.463 |
| 0.6426387962962963 | 19.769 | 19.23 | 19.462 |
| 0.6426387962962963 | 19.771 | 19.23 | 19.463 |
| 0.6426387962962963 | 19.772 | 19.23 | 19.466 |
| 0.6426387962962963 | 19.774 | 19.23 | 19.469 |
| 0.6426388078703703 | 19.776 | 19.23 | 19.474 |
| 0.6426388078703703 | 19.778 | 19.231 | 19.479 |
| 0.6426388078703703 | 19.78 | 19.233 | 19.485 |
| 0.6426388078703703 | 19.78 | 19.235 | 19.491 |
| 0.6426388078703703 | 19.781 | 19.238 | 19.497 |
| 0.6426388078703703 | 19.781 | 19.242 | 19.503 |
| 0.6426388078703703 | 19.781 | 19.247 | 19.509 |
| 0.6426388194444445 | 19.78 | 19.252 | 19.515 |
| 0.6426388194444445 | 19.78 | 19.258 | 19.521 |
| 0.6426388194444445 | 19.78 | 19.264 | 19.526 |
| 0.6426388194444445 | 19.779 | 19.27 | 19.532 |
| 0.6426388194444445 | 19.779 | 19.278 | 19.538 |
| 0.6426388194444445 | 19.779 | 19.285 | 19.544 |
| 0.6426388310185185 | 19.779 | 19.293 | 19.549 |
| 0.6426388310185185 | 19.78 | 19.302 | 19.554 |
| 0.6426388310185185 | 19.78 | 19.312 | 19.56 |
| 0.6426388310185185 | 19.781 | 19.321 | 19.564 |
| 0.6426388310185185 | 19.782 | 19.332 | 19.568 |
| 0.6426388310185185 | 19.784 | 19.343 | 19.572 |
| 0.6426388310185185 | 19.786 | 19.353 | 19.576 |
| 0.6426388425925925 | 19.787 | 19.364 | 19.579 |
| 0.6426388425925925 | 19.789 | 19.375 | 19.583 |
| 0.6426388425925925 | 19.791 | 19.388 | 19.587 |
| 0.6426388425925925 | 19.793 | 19.4 | 19.592 |
| 0.6426388425925925 | 19.795 | 19.412 | 19.595 |
| 0.6426388425925925 | 19.797 | 19.424 | 19.598 |
| 0.6426388541666667 | 19.8 | 19.437 | 19.601 |
| 0.6426388541666667 | 19.803 | 19.449 | 19.604 |
| 0.6426388541666667 | 19.805 | 19.461 | 19.606 |
| 0.6426388541666667 | 19.807 | 19.47 | 19.608 |
| 0.6426388541666667 | 19.807 | 19.478 | 19.609 |
| 0.6426388541666667 | 19.807 | 19.485 | 19.61 |
| 0.6426388657407408 | 19.805 | 19.489 | 19.61 |
| 0.6426388657407408 | 19.803 | 19.494 | 19.61 |
| 0.6426388657407408 | 19.8 | 19.497 | 19.61 |
| 0.6426388657407408 | 19.797 | 19.499 | 19.609 |
| 0.6426388657407408 | 19.794 | 19.5 | 19.608 |
| 0.6426388657407408 | 19.79 | 19.5 | 19.608 |
| 0.6426388657407408 | 19.786 | 19.5 | 19.607 |
| 0.6426388773148148 | 19.782 | 19.5 | 19.606 |
| 0.6426388773148148 | 19.779 | 19.5 | 19.605 |
| 0.6426388773148148 | 19.775 | 19.499 | 19.603 |
| 0.6426388773148148 | 19.771 | 19.5 | 19.601 |
| 0.6426388773148148 | 19.767 | 19.502 | 19.598 |
| 0.6426388773148148 | 19.763 | 19.504 | 19.594 |
| 0.6426388888888889 | 19.758 | 19.505 | 19.59 |
| 0.6426388888888889 | 19.753 | 19.506 | 19.587 |
| 0.6426388888888889 | 19.749 | 19.507 | 19.583 |
| 0.6426388888888889 | 19.746 | 19.507 | 19.58 |
| 0.6426388888888889 | 19.743 | 19.508 | 19.576 |
| 0.6426388888888889 | 19.739 | 19.508 | 19.572 |
| 0.6426388888888889 | 19.735 | 19.508 | 19.569 |
| 0.642638900462963 | 19.732 | 19.508 | 19.566 |
| 0.642638900462963 | 19.729 | 19.508 | 19.562 |
| 0.642638900462963 | 19.727 | 19.508 | 19.558 |
| 0.642638900462963 | 19.724 | 19.508 | 19.555 |
| 0.642638900462963 | 19.721 | 19.508 | 19.552 |
| 0.642638900462963 | 19.719 | 19.506 | 19.549 |
| 0.642638912037037 | 19.717 | 19.502 | 19.546 |
| 0.642638912037037 | 19.713 | 19.497 | 19.547 |
| 0.642638912037037 | 19.709 | 19.493 | 19.549 |
| 0.642638912037037 | 19.704 | 19.489 | 19.554 |
| 0.642638912037037 | 19.698 | 19.483 | 19.559 |
| 0.642638912037037 | 19.693 | 19.474 | 19.564 |
| 0.6426389236111111 | 19.688 | 19.464 | 19.568 |
| 0.6426389236111111 | 19.682 | 19.453 | 19.572 |
| 0.6426389236111111 | 19.677 | 19.447 | 19.574 |
| 0.6426389236111111 | 19.673 | 19.442 | 19.572 |
| 0.6426389236111111 | 19.671 | 19.437 | 19.564 |
| 0.6426389236111111 | 19.672 | 19.431 | 19.548 |
| 0.6426389236111111 | 19.675 | 19.429 | 19.525 |
| 0.6426389351851852 | 19.679 | 19.435 | 19.497 |
| 0.6426389351851852 | 19.682 | 19.45 | 19.466 |
| 0.6426389351851852 | 19.686 | 19.468 | 19.432 |
| 0.6426389351851852 | 19.689 | 19.484 | 19.399 |
| 0.6426389351851852 | 19.692 | 19.497 | 19.37 |
| 0.6426389351851852 | 19.693 | 19.51 | 19.348 |
| 0.6426389467592593 | 19.693 | 19.522 | 19.335 |
| 0.6426389467592593 | 19.692 | 19.53 | 19.33 |
| 0.6426389467592593 | 19.69 | 19.532 | 19.331 |
| 0.6426389467592593 | 19.69 | 19.527 | 19.337 |
| 0.6426389467592593 | 19.692 | 19.519 | 19.347 |
| 0.6426389467592593 | 19.695 | 19.509 | 19.358 |
| 0.6426389467592593 | 19.7 | 19.499 | 19.368 |
| 0.6426389583333333 | 19.706 | 19.492 | 19.375 |
| 0.6426389583333333 | 19.714 | 19.485 | 19.378 |
| 0.6426389583333333 | 19.716 | 19.481 | 19.385 |
| 0.6426389583333333 | 19.711 | 19.479 | 19.398 |
| 0.6426389583333333 | 19.703 | 19.479 | 19.408 |
| 0.6426389583333333 | 19.701 | 19.481 | 19.411 |
| 0.6426389699074074 | 19.7 | 19.484 | 19.411 |
| 0.6426389699074074 | 19.693 | 19.487 | 19.412 |
| 0.6426389699074074 | 19.679 | 19.489 | 19.416 |
| 0.6426389699074074 | 19.665 | 19.492 | 19.419 |
| 0.6426389699074074 | 19.656 | 19.495 | 19.42 |
| 0.6426389699074074 | 19.649 | 19.498 | 19.421 |
| 0.6426389814814815 | 19.639 | 19.499 | 19.422 |
| 0.6426389814814815 | 19.627 | 19.5 | 19.423 |
| 0.6426389814814815 | 19.615 | 19.501 | 19.423 |
| 0.6426389814814815 | 19.607 | 19.504 | 19.421 |
| 0.6426389814814815 | 19.603 | 19.507 | 19.42 |
| 0.6426389814814815 | 19.598 | 19.511 | 19.417 |
| 0.6426389814814815 | 19.592 | 19.515 | 19.414 |
| 0.6426389930555555 | 19.583 | 19.519 | 19.41 |
| 0.6426389930555555 | 19.576 | 19.524 | 19.407 |
| 0.6426389930555555 | 19.574 | 19.529 | 19.404 |
| 0.6426389930555555 | 19.573 | 19.533 | 19.402 |
| 0.6426389930555555 | 19.568 | 19.537 | 19.398 |
| 0.6426389930555555 | 19.562 | 19.541 | 19.393 |
| 0.6426390046296296 | 19.557 | 19.544 | 19.388 |
| 0.6426390046296296 | 19.557 | 19.548 | 19.383 |
| 0.6426390046296296 | 19.556 | 19.551 | 19.378 |
| 0.6426390046296296 | 19.552 | 19.554 | 19.37 |
| 0.6426390046296296 | 19.547 | 19.556 | 19.36 |
| 0.6426390046296296 | 19.544 | 19.557 | 19.351 |
| 0.6426390046296296 | 19.543 | 19.559 | 19.344 |
| 0.6426390162037037 | 19.542 | 19.56 | 19.338 |
| 0.6426390162037037 | 19.539 | 19.56 | 19.331 |
| 0.6426390162037037 | 19.539 | 19.561 | 19.328 |
| 0.6426390162037037 | 19.534 | 19.561 | 19.322 |
| 0.6426390162037037 | 19.537 | 19.56 | 19.319 |
| 0.6426390162037037 | 19.54 | 19.56 | 19.315 |
| 0.6426390277777778 | 19.544 | 19.558 | 19.311 |
| 0.6426390277777778 | 19.549 | 19.556 | 19.307 |
| 0.6426390277777778 | 19.554 | 19.554 | 19.304 |
| 0.6426390277777778 | 19.559 | 19.552 | 19.301 |
| 0.6426390277777778 | 19.565 | 19.548 | 19.299 |
| 0.6426390277777778 | 19.57 | 19.544 | 19.295 |
| 0.6426390393518518 | 19.575 | 19.54 | 19.291 |
| 0.6426390393518518 | 19.579 | 19.535 | 19.287 |
| 0.6426390393518518 | 19.582 | 19.53 | 19.284 |
| 0.6426390393518518 | 19.585 | 19.526 | 19.283 |
| 0.6426390393518518 | 19.588 | 19.52 | 19.28 |
| 0.6426390393518518 | 19.59 | 19.514 | 19.277 |
| 0.6426390393518518 | 19.592 | 19.509 | 19.273 |
| 0.642639050925926 | 19.593 | 19.503 | 19.272 |
| 0.642639050925926 | 19.595 | 19.498 | 19.272 |
| 0.642639050925926 | 19.596 | 19.492 | 19.272 |
| 0.642639050925926 | 19.597 | 19.486 | 19.27 |
| 0.642639050925926 | 19.598 | 19.479 | 19.27 |
| 0.642639050925926 | 19.598 | 19.473 | 19.272 |
| 0.6426390625 | 19.597 | 19.467 | 19.276 |
| 0.6426390625 | 19.597 | 19.461 | 19.279 |
| 0.6426390625 | 19.595 | 19.456 | 19.283 |
| 0.6426390625 | 19.593 | 19.452 | 19.289 |
| 0.6426390625 | 19.59 | 19.449 | 19.295 |
| 0.6426390625 | 19.587 | 19.446 | 19.302 |
| 0.6426390625 | 19.584 | 19.445 | 19.308 |
| 0.6426390740740741 | 19.58 | 19.446 | 19.315 |
| 0.6426390740740741 | 19.577 | 19.448 | 19.321 |
| 0.6426390740740741 | 19.574 | 19.449 | 19.326 |
| 0.6426390740740741 | 19.57 | 19.451 | 19.33 |
| 0.6426390740740741 | 19.567 | 19.454 | 19.335 |
| 0.6426390740740741 | 19.563 | 19.456 | 19.339 |
| 0.6426390856481482 | 19.558 | 19.458 | 19.342 |
| 0.6426390856481482 | 19.553 | 19.459 | 19.345 |
| 0.6426390856481482 | 19.548 | 19.461 | 19.348 |
| 0.6426390856481482 | 19.541 | 19.463 | 19.35 |
| 0.6426390856481482 | 19.535 | 19.465 | 19.352 |
| 0.6426390856481482 | 19.529 | 19.468 | 19.354 |
| 0.6426390972222222 | 19.521 | 19.47 | 19.354 |
| 0.6426390972222222 | 19.514 | 19.473 | 19.355 |
| 0.6426390972222222 | 19.507 | 19.476 | 19.355 |
| 0.6426390972222222 | 19.5 | 19.481 | 19.354 |
| 0.6426390972222222 | 19.494 | 19.485 | 19.352 |
| 0.6426390972222222 | 19.489 | 19.49 | 19.35 |
| 0.6426390972222222 | 19.483 | 19.496 | 19.348 |
| 0.6426391087962963 | 19.478 | 19.501 | 19.344 |
| 0.6426391087962963 | 19.473 | 19.505 | 19.341 |
| 0.6426391087962963 | 19.469 | 19.51 | 19.337 |
| 0.6426391087962963 | 19.465 | 19.513 | 19.333 |
| 0.6426391087962963 | 19.461 | 19.516 | 19.329 |
| 0.6426391087962963 | 19.457 | 19.519 | 19.325 |
| 0.6426391203703704 | 19.452 | 19.522 | 19.32 |
| 0.6426391203703704 | 19.447 | 19.524 | 19.314 |
| 0.6426391203703704 | 19.441 | 19.526 | 19.307 |
| 0.6426391203703704 | 19.435 | 19.527 | 19.301 |
| 0.6426391203703704 | 19.431 | 19.529 | 19.293 |
| 0.6426391203703704 | 19.427 | 19.531 | 19.286 |
| 0.6426391203703704 | 19.424 | 19.532 | 19.278 |
| 0.6426391319444444 | 19.421 | 19.534 | 19.27 |
| 0.6426391319444444 | 19.42 | 19.534 | 19.262 |
| 0.6426391319444444 | 19.42 | 19.535 | 19.255 |
| 0.6426391319444444 | 19.423 | 19.535 | 19.248 |
| 0.6426391319444444 | 19.427 | 19.535 | 19.241 |
| 0.6426391319444444 | 19.432 | 19.535 | 19.235 |
| 0.6426391435185185 | 19.438 | 19.537 | 19.23 |
| 0.6426391435185185 | 19.447 | 19.539 | 19.222 |
| 0.6426391435185185 | 19.456 | 19.54 | 19.214 |
| 0.6426391435185185 | 19.466 | 19.541 | 19.207 |
| 0.6426391435185185 | 19.476 | 19.544 | 19.199 |
| 0.6426391435185185 | 19.486 | 19.549 | 19.192 |
| 0.6426391550925926 | 19.494 | 19.556 | 19.185 |
| 0.6426391550925926 | 19.503 | 19.563 | 19.179 |
| 0.6426391550925926 | 19.511 | 19.567 | 19.177 |
| 0.6426391550925926 | 19.517 | 19.569 | 19.179 |
| 0.6426391550925926 | 19.521 | 19.571 | 19.187 |
| 0.6426391550925926 | 19.522 | 19.573 | 19.201 |
| 0.6426391550925926 | 19.52 | 19.571 | 19.223 |
| 0.6426391666666667 | 19.518 | 19.562 | 19.252 |
| 0.6426391666666667 | 19.515 | 19.544 | 19.284 |
| 0.6426391666666667 | 19.512 | 19.522 | 19.318 |
| 0.6426391666666667 | 19.51 | 19.502 | 19.351 |
| 0.6426391666666667 | 19.508 | 19.486 | 19.382 |
| 0.6426391666666667 | 19.507 | 19.47 | 19.406 |
| 0.6426391782407407 | 19.507 | 19.456 | 19.424 |
| 0.6426391782407407 | 19.507 | 19.446 | 19.434 |
| 0.6426391782407407 | 19.507 | 19.444 | 19.439 |
| 0.6426391782407407 | 19.506 | 19.449 | 19.44 |
| 0.6426391782407407 | 19.503 | 19.46 | 19.437 |
| 0.6426391782407407 | 19.497 | 19.473 | 19.434 |
| 0.6426391782407407 | 19.49 | 19.486 | 19.432 |
| 0.6426391898148148 | 19.481 | 19.497 | 19.432 |
| 0.6426391898148148 | 19.471 | 19.505 | 19.434 |
| 0.6426391898148148 | 19.465 | 19.512 | 19.432 |
| 0.6426391898148148 | 19.467 | 19.517 | 19.425 |
| 0.6426391898148148 | 19.47 | 19.519 | 19.419 |
| 0.6426391898148148 | 19.468 | 19.517 | 19.419 |
| 0.6426392013888889 | 19.463 | 19.513 | 19.423 |
| 0.6426392013888889 | 19.463 | 19.508 | 19.424 |
| 0.6426392013888889 | 19.469 | 19.502 | 19.423 |
| 0.6426392013888889 | 19.476 | 19.497 | 19.421 |
| 0.6426392013888889 | 19.477 | 19.491 | 19.421 |
| 0.6426392013888889 | 19.474 | 19.485 | 19.422 |
| 0.6426392129629629 | 19.474 | 19.482 | 19.422 |
| 0.6426392129629629 | 19.476 | 19.481 | 19.421 |
| 0.6426392129629629 | 19.478 | 19.481 | 19.421 |
| 0.6426392129629629 | 19.477 | 19.479 | 19.421 |
| 0.6426392129629629 | 19.472 | 19.479 | 19.422 |
| 0.6426392129629629 | 19.469 | 19.478 | 19.422 |
| 0.6426392129629629 | 19.468 | 19.478 | 19.422 |
| 0.642639224537037 | 19.471 | 19.477 | 19.423 |
| 0.642639224537037 | 19.473 | 19.476 | 19.424 |
| 0.642639224537037 | 19.472 | 19.474 | 19.424 |
| 0.642639224537037 | 19.468 | 19.472 | 19.422 |
| 0.642639224537037 | 19.468 | 19.471 | 19.422 |
| 0.642639224537037 | 19.471 | 19.469 | 19.424 |
| 0.6426392361111112 | 19.471 | 19.467 | 19.425 |
| 0.6426392361111112 | 19.467 | 19.465 | 19.425 |
| 0.6426392361111112 | 19.461 | 19.463 | 19.425 |
| 0.6426392361111112 | 19.459 | 19.462 | 19.426 |
| 0.6426392361111112 | 19.458 | 19.461 | 19.429 |
| 0.6426392361111112 | 19.456 | 19.46 | 19.432 |
| 0.6426392361111112 | 19.452 | 19.459 | 19.433 |
| 0.6426392476851852 | 19.448 | 19.458 | 19.433 |
| 0.6426392476851852 | 19.446 | 19.458 | 19.434 |
| 0.6426392476851852 | 19.444 | 19.458 | 19.432 |
| 0.6426392476851852 | 19.447 | 19.458 | 19.433 |
| 0.6426392476851852 | 19.444 | 19.458 | 19.433 |
| 0.6426392476851852 | 19.442 | 19.458 | 19.433 |
| 0.6426392592592592 | 19.439 | 19.459 | 19.434 |
| 0.6426392592592592 | 19.437 | 19.46 | 19.435 |
| 0.6426392592592592 | 19.435 | 19.46 | 19.436 |
| 0.6426392592592592 | 19.433 | 19.461 | 19.437 |
| 0.6426392592592592 | 19.43 | 19.462 | 19.437 |
| 0.6426392592592592 | 19.427 | 19.464 | 19.438 |
| 0.6426392708333334 | 19.425 | 19.465 | 19.439 |
| 0.6426392708333334 | 19.423 | 19.467 | 19.44 |
| 0.6426392708333334 | 19.421 | 19.468 | 19.439 |
| 0.6426392708333334 | 19.419 | 19.469 | 19.437 |
| 0.6426392708333334 | 19.417 | 19.471 | 19.434 |
| 0.6426392708333334 | 19.416 | 19.473 | 19.433 |
| 0.6426392708333334 | 19.415 | 19.474 | 19.432 |
| 0.6426392824074074 | 19.414 | 19.475 | 19.43 |
| 0.6426392824074074 | 19.413 | 19.475 | 19.427 |
| 0.6426392824074074 | 19.412 | 19.476 | 19.424 |
| 0.6426392824074074 | 19.412 | 19.477 | 19.423 |
| 0.6426392824074074 | 19.412 | 19.478 | 19.422 |
| 0.6426392824074074 | 19.412 | 19.478 | 19.419 |
| 0.6426392939814815 | 19.412 | 19.478 | 19.417 |
| 0.6426392939814815 | 19.412 | 19.477 | 19.415 |
| 0.6426392939814815 | 19.412 | 19.477 | 19.414 |
| 0.6426392939814815 | 19.412 | 19.475 | 19.412 |
| 0.6426392939814815 | 19.412 | 19.474 | 19.411 |
| 0.6426392939814815 | 19.412 | 19.472 | 19.409 |
| 0.6426392939814815 | 19.412 | 19.47 | 19.407 |
| 0.6426393055555556 | 19.412 | 19.466 | 19.406 |
| 0.6426393055555556 | 19.411 | 19.463 | 19.405 |
| 0.6426393055555556 | 19.41 | 19.46 | 19.404 |
| 0.6426393055555556 | 19.409 | 19.456 | 19.403 |
| 0.6426393055555556 | 19.408 | 19.452 | 19.402 |
| 0.6426393055555556 | 19.408 | 19.448 | 19.401 |
| 0.6426393171296296 | 19.407 | 19.444 | 19.4 |
| 0.6426393171296296 | 19.406 | 19.442 | 19.4 |
| 0.6426393171296296 | 19.406 | 19.439 | 19.399 |
| 0.6426393171296296 | 19.406 | 19.437 | 19.398 |
| 0.6426393171296296 | 19.406 | 19.435 | 19.398 |
| 0.6426393171296296 | 19.406 | 19.434 | 19.398 |
| 0.6426393287037037 | 19.406 | 19.433 | 19.398 |
| 0.6426393287037037 | 19.405 | 19.431 | 19.398 |
| 0.6426393287037037 | 19.405 | 19.429 | 19.398 |
| 0.6426393287037037 | 19.405 | 19.428 | 19.398 |
| 0.6426393287037037 | 19.404 | 19.427 | 19.398 |
| 0.6426393287037037 | 19.402 | 19.424 | 19.398 |
| 0.6426393287037037 | 19.402 | 19.422 | 19.398 |
| 0.6426393402777778 | 19.402 | 19.421 | 19.399 |
| 0.6426393402777778 | 19.402 | 19.42 | 19.399 |
| 0.6426393402777778 | 19.4 | 19.418 | 19.4 |
| 0.6426393402777778 | 19.399 | 19.416 | 19.401 |
| 0.6426393402777778 | 19.399 | 19.414 | 19.402 |
| 0.6426393402777778 | 19.398 | 19.413 | 19.402 |
| 0.6426393518518518 | 19.397 | 19.411 | 19.403 |
| 0.6426393518518518 | 19.395 | 19.409 | 19.405 |
| 0.6426393518518518 | 19.393 | 19.408 | 19.406 |
| 0.6426393518518518 | 19.392 | 19.407 | 19.407 |
| 0.6426393518518518 | 19.39 | 19.406 | 19.408 |
| 0.6426393518518518 | 19.388 | 19.405 | 19.41 |
| 0.6426393518518518 | 19.385 | 19.404 | 19.411 |
| 0.6426393634259259 | 19.382 | 19.403 | 19.411 |
| 0.6426393634259259 | 19.38 | 19.403 | 19.412 |
| 0.6426393634259259 | 19.377 | 19.402 | 19.412 |
| 0.6426393634259259 | 19.375 | 19.402 | 19.412 |
| 0.6426393634259259 | 19.372 | 19.403 | 19.413 |
| 0.6426393634259259 | 19.37 | 19.403 | 19.413 |
| 0.642639375 | 19.367 | 19.403 | 19.412 |
| 0.642639375 | 19.366 | 19.404 | 19.412 |
| 0.642639375 | 19.365 | 19.404 | 19.412 |
| 0.642639375 | 19.363 | 19.404 | 19.41 |
| 0.642639375 | 19.36 | 19.405 | 19.408 |
| 0.642639375 | 19.358 | 19.405 | 19.407 |
| 0.642639386574074 | 19.357 | 19.406 | 19.406 |
| 0.642639386574074 | 19.357 | 19.406 | 19.405 |
| 0.642639386574074 | 19.355 | 19.406 | 19.402 |
| 0.642639386574074 | 19.353 | 19.406 | 19.398 |
| 0.642639386574074 | 19.352 | 19.406 | 19.395 |
| 0.642639386574074 | 19.351 | 19.406 | 19.393 |
| 0.642639386574074 | 19.35 | 19.406 | 19.39 |
| 0.6426393981481481 | 19.349 | 19.406 | 19.386 |
| 0.6426393981481481 | 19.348 | 19.405 | 19.382 |
| 0.6426393981481481 | 19.347 | 19.405 | 19.379 |
| 0.6426393981481481 | 19.347 | 19.404 | 19.376 |
| 0.6426393981481481 | 19.347 | 19.403 | 19.373 |
| 0.6426393981481481 | 19.347 | 19.402 | 19.37 |
| 0.6426394097222222 | 19.347 | 19.402 | 19.368 |
| 0.6426394097222222 | 19.347 | 19.401 | 19.367 |
| 0.6426394097222222 | 19.347 | 19.4 | 19.365 |
| 0.6426394097222222 | 19.347 | 19.399 | 19.364 |
| 0.6426394097222222 | 19.347 | 19.398 | 19.363 |
| 0.6426394097222222 | 19.347 | 19.397 | 19.363 |
| 0.6426394097222222 | 19.347 | 19.395 | 19.361 |
| 0.6426394212962964 | 19.347 | 19.393 | 19.361 |
| 0.6426394212962964 | 19.346 | 19.391 | 19.36 |
| 0.6426394212962964 | 19.346 | 19.389 | 19.36 |
| 0.6426394212962964 | 19.345 | 19.386 | 19.359 |
| 0.6426394212962964 | 19.344 | 19.383 | 19.358 |
| 0.6426394212962964 | 19.344 | 19.381 | 19.358 |
| 0.6426394328703704 | 19.343 | 19.38 | 19.358 |
| 0.6426394328703704 | 19.342 | 19.377 | 19.357 |
| 0.6426394328703704 | 19.341 | 19.374 | 19.357 |
| 0.6426394328703704 | 19.34 | 19.372 | 19.357 |
| 0.6426394328703704 | 19.339 | 19.37 | 19.357 |
| 0.6426394328703704 | 19.338 | 19.367 | 19.356 |
| 0.6426394444444444 | 19.336 | 19.365 | 19.356 |
| 0.6426394444444444 | 19.335 | 19.362 | 19.356 |
| 0.6426394444444444 | 19.334 | 19.359 | 19.356 |
| 0.6426394444444444 | 19.332 | 19.357 | 19.356 |
| 0.6426394444444444 | 19.331 | 19.354 | 19.356 |
| 0.6426394444444444 | 19.33 | 19.352 | 19.357 |
| 0.6426394444444444 | 19.329 | 19.351 | 19.357 |
| 0.6426394560185186 | 19.326 | 19.348 | 19.357 |
| 0.6426394560185186 | 19.323 | 19.345 | 19.357 |
| 0.6426394560185186 | 19.321 | 19.343 | 19.358 |
| 0.6426394560185186 | 19.32 | 19.342 | 19.358 |
| 0.6426394560185186 | 19.319 | 19.341 | 19.358 |
| 0.6426394560185186 | 19.316 | 19.34 | 19.358 |
| 0.6426394675925926 | 19.314 | 19.338 | 19.358 |
| 0.6426394675925926 | 19.312 | 19.337 | 19.359 |
| 0.6426394675925926 | 19.312 | 19.337 | 19.359 |
| 0.6426394675925926 | 19.311 | 19.336 | 19.359 |
| 0.6426394675925926 | 19.309 | 19.336 | 19.36 |
| 0.6426394675925926 | 19.307 | 19.335 | 19.359 |
| 0.6426394675925926 | 19.305 | 19.335 | 19.359 |
| 0.6426394791666666 | 19.304 | 19.335 | 19.359 |
| 0.6426394791666666 | 19.303 | 19.335 | 19.359 |
| 0.6426394791666666 | 19.301 | 19.335 | 19.358 |
| 0.6426394791666666 | 19.3 | 19.335 | 19.359 |
| 0.6426394791666666 | 19.299 | 19.335 | 19.358 |
| 0.6426394791666666 | 19.298 | 19.335 | 19.357 |
| 0.6426394907407408 | 19.298 | 19.335 | 19.357 |
| 0.6426394907407408 | 19.298 | 19.335 | 19.356 |
| 0.6426394907407408 | 19.297 | 19.334 | 19.355 |
| 0.6426394907407408 | 19.296 | 19.334 | 19.353 |
| 0.6426394907407408 | 19.296 | 19.334 | 19.351 |
| 0.6426394907407408 | 19.296 | 19.333 | 19.351 |
| 0.6426395023148148 | 19.296 | 19.333 | 19.349 |
| 0.6426395023148148 | 19.295 | 19.332 | 19.346 |
| 0.6426395023148148 | 19.294 | 19.332 | 19.344 |
| 0.6426395023148148 | 19.294 | 19.332 | 19.344 |
| 0.6426395023148148 | 19.294 | 19.332 | 19.343 |
| 0.6426395023148148 | 19.294 | 19.331 | 19.342 |
| 0.6426395023148148 | 19.293 | 19.331 | 19.339 |
| 0.6426395138888888 | 19.292 | 19.331 | 19.337 |
| 0.6426395138888888 | 19.292 | 19.33 | 19.336 |
| 0.6426395138888888 | 19.292 | 19.33 | 19.335 |
| 0.6426395138888888 | 19.292 | 19.329 | 19.332 |
| 0.6426395138888888 | 19.292 | 19.327 | 19.329 |
| 0.6426395138888888 | 19.292 | 19.326 | 19.327 |
| 0.642639525462963 | 19.292 | 19.325 | 19.325 |
| 0.642639525462963 | 19.292 | 19.324 | 19.323 |
| 0.642639525462963 | 19.292 | 19.323 | 19.322 |
| 0.642639525462963 | 19.292 | 19.323 | 19.321 |
| 0.642639525462963 | 19.292 | 19.322 | 19.32 |
| 0.642639525462963 | 19.292 | 19.32 | 19.319 |
| 0.642639525462963 | 19.292 | 19.318 | 19.318 |
| 0.642639537037037 | 19.292 | 19.318 | 19.317 |
| 0.642639537037037 | 19.292 | 19.317 | 19.317 |
| 0.642639537037037 | 19.292 | 19.314 | 19.316 |
| 0.642639537037037 | 19.291 | 19.312 | 19.315 |
| 0.642639537037037 | 19.291 | 19.309 | 19.314 |
| 0.642639537037037 | 19.291 | 19.308 | 19.314 |
| 0.6426395486111111 | 19.29 | 19.306 | 19.313 |
| 0.6426395486111111 | 19.29 | 19.303 | 19.312 |
| 0.6426395486111111 | 19.289 | 19.299 | 19.312 |
| 0.6426395486111111 | 19.287 | 19.296 | 19.312 |
| 0.6426395486111111 | 19.286 | 19.293 | 19.311 |
| 0.6426395486111111 | 19.284 | 19.29 | 19.311 |
| 0.6426395601851852 | 19.282 | 19.287 | 19.311 |
| 0.6426395601851852 | 19.28 | 19.285 | 19.311 |
| 0.6426395601851852 | 19.278 | 19.282 | 19.311 |
| 0.6426395601851852 | 19.275 | 19.28 | 19.311 |
| 0.6426395601851852 | 19.274 | 19.279 | 19.311 |
| 0.6426395601851852 | 19.273 | 19.278 | 19.311 |
| 0.6426395601851852 | 19.271 | 19.277 | 19.311 |
| 0.6426395717592592 | 19.269 | 19.275 | 19.311 |
| 0.6426395717592592 | 19.267 | 19.274 | 19.311 |
| 0.6426395717592592 | 19.266 | 19.274 | 19.311 |
| 0.6426395717592592 | 19.264 | 19.274 | 19.31 |
| 0.6426395717592592 | 19.26 | 19.273 | 19.309 |
| 0.6426395717592592 | 19.256 | 19.272 | 19.308 |
| 0.6426395833333333 | 19.253 | 19.272 | 19.307 |
| 0.6426395833333333 | 19.25 | 19.272 | 19.305 |
| 0.6426395833333333 | 19.247 | 19.271 | 19.303 |
| 0.6426395833333333 | 19.242 | 19.271 | 19.302 |
| 0.6426395833333333 | 19.239 | 19.27 | 19.301 |
| 0.6426395833333333 | 19.237 | 19.27 | 19.3 |
| 0.6426395833333333 | 19.235 | 19.27 | 19.299 |
| 0.6426395949074074 | 19.234 | 19.27 | 19.298 |
| 0.6426395949074074 | 19.232 | 19.27 | 19.297 |
| 0.6426395949074074 | 19.231 | 19.27 | 19.297 |
| 0.6426395949074074 | 19.231 | 19.27 | 19.295 |
| 0.6426395949074074 | 19.23 | 19.27 | 19.294 |
| 0.6426395949074074 | 19.229 | 19.27 | 19.292 |
| 0.6426396064814816 | 19.228 | 19.27 | 19.291 |
| 0.6426396064814816 | 19.227 | 19.269 | 19.288 |
| 0.6426396064814816 | 19.226 | 19.269 | 19.284 |
| 0.6426396064814816 | 19.225 | 19.269 | 19.282 |
| 0.6426396064814816 | 19.225 | 19.268 | 19.281 |
| 0.6426396064814816 | 19.225 | 19.268 | 19.279 |
| 0.6426396180555556 | 19.224 | 19.267 | 19.276 |
| 0.6426396180555556 | 19.223 | 19.266 | 19.273 |
| 0.6426396180555556 | 19.223 | 19.265 | 19.271 |
| 0.6426396180555556 | 19.224 | 19.264 | 19.27 |
| 0.6426396180555556 | 19.224 | 19.263 | 19.268 |
| 0.6426396180555556 | 19.223 | 19.261 | 19.265 |
| 0.6426396180555556 | 19.223 | 19.26 | 19.262 |
| 0.6426396296296296 | 19.223 | 19.258 | 19.261 |
| 0.6426396296296296 | 19.223 | 19.257 | 19.258 |
| 0.6426396296296296 | 19.223 | 19.255 | 19.256 |
| 0.6426396296296296 | 19.223 | 19.254 | 19.254 |
| 0.6426396296296296 | 19.223 | 19.252 | 19.252 |
| 0.6426396296296296 | 19.223 | 19.25 | 19.25 |
| 0.6426396412037038 | 19.223 | 19.247 | 19.249 |
| 0.6426396412037038 | 19.223 | 19.244 | 19.247 |
| 0.6426396412037038 | 19.223 | 19.242 | 19.246 |
| 0.6426396412037038 | 19.222 | 19.238 | 19.244 |
| 0.6426396412037038 | 19.222 | 19.234 | 19.242 |
| 0.6426396412037038 | 19.222 | 19.23 | 19.241 |
| 0.6426396412037038 | 19.221 | 19.228 | 19.24 |
| 0.6426396527777778 | 19.22 | 19.225 | 19.24 |
| 0.6426396527777778 | 19.219 | 19.22 | 19.239 |
| 0.6426396527777778 | 19.218 | 19.216 | 19.238 |
| 0.6426396527777778 | 19.217 | 19.213 | 19.237 |
| 0.6426396527777778 | 19.216 | 19.211 | 19.238 |
| 0.6426396527777778 | 19.214 | 19.208 | 19.238 |
| 0.6426396643518518 | 19.212 | 19.203 | 19.237 |
| 0.6426396643518518 | 19.21 | 19.2 | 19.237 |
| 0.6426396643518518 | 19.209 | 19.197 | 19.237 |
| 0.6426396643518518 | 19.207 | 19.195 | 19.237 |
| 0.6426396643518518 | 19.206 | 19.193 | 19.236 |
| 0.6426396643518518 | 19.204 | 19.19 | 19.236 |
| 0.642639675925926 | 19.203 | 19.188 | 19.236 |
| 0.642639675925926 | 19.201 | 19.187 | 19.236 |
| 0.642639675925926 | 19.199 | 19.187 | 19.236 |
| 0.642639675925926 | 19.197 | 19.186 | 19.236 |
| 0.642639675925926 | 19.194 | 19.186 | 19.236 |
| 0.642639675925926 | 19.19 | 19.185 | 19.236 |
| 0.642639675925926 | 19.186 | 19.184 | 19.235 |
| 0.6426396875 | 19.183 | 19.184 | 19.234 |
| 0.6426396875 | 19.181 | 19.185 | 19.234 |
| 0.6426396875 | 19.179 | 19.184 | 19.233 |
| 0.6426396875 | 19.175 | 19.183 | 19.232 |
| 0.6426396875 | 19.171 | 19.182 | 19.231 |
| 0.6426396875 | 19.169 | 19.182 | 19.23 |
| 0.642639699074074 | 19.167 | 19.182 | 19.229 |
| 0.642639699074074 | 19.164 | 19.182 | 19.228 |
| 0.642639699074074 | 19.16 | 19.181 | 19.226 |
| 0.642639699074074 | 19.156 | 19.181 | 19.224 |
| 0.642639699074074 | 19.153 | 19.181 | 19.222 |
| 0.642639699074074 | 19.151 | 19.181 | 19.219 |
| 0.642639699074074 | 19.148 | 19.181 | 19.217 |
| 0.6426397106481482 | 19.145 | 19.181 | 19.215 |
| 0.6426397106481482 | 19.143 | 19.181 | 19.213 |
| 0.6426397106481482 | 19.142 | 19.181 | 19.21 |
| 0.6426397106481482 | 19.141 | 19.181 | 19.207 |
| 0.6426397106481482 | 19.139 | 19.181 | 19.204 |
| 0.6426397106481482 | 19.139 | 19.181 | 19.202 |
| 0.6426397222222222 | 19.138 | 19.181 | 19.198 |
| 0.6426397222222222 | 19.138 | 19.18 | 19.194 |
| 0.6426397222222222 | 19.137 | 19.179 | 19.19 |
| 0.6426397222222222 | 19.137 | 19.179 | 19.186 |
| 0.6426397222222222 | 19.136 | 19.178 | 19.182 |
| 0.6426397222222222 | 19.135 | 19.176 | 19.178 |
| 0.6426397337962962 | 19.134 | 19.175 | 19.173 |
| 0.6426397337962962 | 19.134 | 19.174 | 19.17 |
| 0.6426397337962962 | 19.134 | 19.171 | 19.166 |
| 0.6426397337962962 | 19.134 | 19.169 | 19.161 |
| 0.6426397337962962 | 19.135 | 19.167 | 19.157 |
| 0.6426397337962962 | 19.135 | 19.164 | 19.154 |
| 0.6426397337962962 | 19.135 | 19.161 | 19.151 |
| 0.6426397453703704 | 19.136 | 19.158 | 19.149 |
| 0.6426397453703704 | 19.136 | 19.155 | 19.146 |
| 0.6426397453703704 | 19.137 | 19.152 | 19.144 |
| 0.6426397453703704 | 19.137 | 19.149 | 19.143 |
| 0.6426397453703704 | 19.137 | 19.146 | 19.142 |
| 0.6426397453703704 | 19.137 | 19.143 | 19.141 |
| 0.6426397569444444 | 19.137 | 19.14 | 19.141 |
| 0.6426397569444444 | 19.137 | 19.137 | 19.142 |
| 0.6426397569444444 | 19.136 | 19.133 | 19.142 |
| 0.6426397569444444 | 19.136 | 19.128 | 19.141 |
| 0.6426397569444444 | 19.135 | 19.125 | 19.141 |
| 0.6426397569444444 | 19.134 | 19.122 | 19.143 |
| 0.6426397569444444 | 19.132 | 19.119 | 19.144 |
| 0.6426397685185185 | 19.13 | 19.114 | 19.144 |
| 0.6426397685185185 | 19.129 | 19.11 | 19.144 |
| 0.6426397685185185 | 19.127 | 19.107 | 19.145 |
| 0.6426397685185185 | 19.124 | 19.105 | 19.147 |
| 0.6426397685185185 | 19.122 | 19.103 | 19.148 |
| 0.6426397685185185 | 19.119 | 19.099 | 19.149 |
| 0.6426397800925926 | 19.116 | 19.097 | 19.15 |
| 0.6426397800925926 | 19.113 | 19.096 | 19.151 |
| 0.6426397800925926 | 19.11 | 19.095 | 19.152 |
| 0.6426397800925926 | 19.107 | 19.094 | 19.152 |
| 0.6426397800925926 | 19.104 | 19.093 | 19.153 |
| 0.6426397800925926 | 19.102 | 19.092 | 19.153 |
| 0.6426397916666667 | 19.099 | 19.091 | 19.153 |
| 0.6426397916666667 | 19.096 | 19.091 | 19.154 |
| 0.6426397916666667 | 19.094 | 19.091 | 19.154 |
| 0.6426397916666667 | 19.092 | 19.091 | 19.154 |
| 0.6426397916666667 | 19.089 | 19.091 | 19.153 |
| 0.6426397916666667 | 19.085 | 19.091 | 19.153 |
| 0.6426397916666667 | 19.081 | 19.092 | 19.152 |
| 0.6426398032407408 | 19.078 | 19.093 | 19.151 |
| 0.6426398032407408 | 19.075 | 19.094 | 19.149 |
| 0.6426398032407408 | 19.072 | 19.094 | 19.148 |
| 0.6426398032407408 | 19.069 | 19.095 | 19.147 |
| 0.6426398032407408 | 19.069 | 19.097 | 19.145 |
| 0.6426398032407408 | 19.068 | 19.098 | 19.144 |
| 0.6426398148148148 | 19.067 | 19.099 | 19.142 |
| 0.6426398148148148 | 19.067 | 19.1 | 19.141 |
| 0.6426398148148148 | 19.068 | 19.102 | 19.139 |
| 0.6426398148148148 | 19.069 | 19.104 | 19.137 |
| 0.6426398148148148 | 19.07 | 19.105 | 19.135 |
| 0.6426398148148148 | 19.069 | 19.106 | 19.132 |
| 0.6426398148148148 | 19.069 | 19.107 | 19.129 |
| 0.642639826388889 | 19.07 | 19.107 | 19.126 |
| 0.642639826388889 | 19.071 | 19.108 | 19.123 |
| 0.642639826388889 | 19.071 | 19.108 | 19.119 |
| 0.642639826388889 | 19.072 | 19.108 | 19.116 |
| 0.642639826388889 | 19.073 | 19.108 | 19.113 |
| 0.642639826388889 | 19.075 | 19.108 | 19.11 |
| 0.642639837962963 | 19.076 | 19.107 | 19.107 |
| 0.642639837962963 | 19.078 | 19.106 | 19.105 |
| 0.642639837962963 | 19.08 | 19.105 | 19.103 |
| 0.642639837962963 | 19.082 | 19.104 | 19.101 |
| 0.642639837962963 | 19.083 | 19.102 | 19.097 |
| 0.642639837962963 | 19.084 | 19.1 | 19.093 |
| 0.642639849537037 | 19.085 | 19.099 | 19.092 |
| 0.642639849537037 | 19.087 | 19.097 | 19.091 |
| 0.642639849537037 | 19.088 | 19.095 | 19.089 |
| 0.642639849537037 | 19.088 | 19.094 | 19.088 |
| 0.642639849537037 | 19.089 | 19.092 | 19.087 |
| 0.642639849537037 | 19.09 | 19.09 | 19.086 |
| 0.642639849537037 | 19.092 | 19.088 | 19.087 |
| 0.6426398611111112 | 19.092 | 19.087 | 19.087 |
| 0.6426398611111112 | 19.093 | 19.085 | 19.088 |
| 0.6426398611111112 | 19.094 | 19.082 | 19.089 |
| 0.6426398611111112 | 19.094 | 19.079 | 19.09 |
| 0.6426398611111112 | 19.095 | 19.077 | 19.091 |
| 0.6426398611111112 | 19.095 | 19.075 | 19.092 |
| 0.6426398726851852 | 19.095 | 19.073 | 19.094 |
| 0.6426398726851852 | 19.095 | 19.071 | 19.096 |
| 0.6426398726851852 | 19.094 | 19.069 | 19.097 |
| 0.6426398726851852 | 19.094 | 19.068 | 19.099 |
| 0.6426398726851852 | 19.093 | 19.068 | 19.102 |
| 0.6426398726851852 | 19.092 | 19.067 | 19.104 |
| 0.6426398726851852 | 19.091 | 19.065 | 19.105 |
| 0.6426398842592592 | 19.089 | 19.063 | 19.107 |
| 0.6426398842592592 | 19.088 | 19.063 | 19.109 |
| 0.6426398842592592 | 19.086 | 19.063 | 19.111 |
| 0.6426398842592592 | 19.084 | 19.061 | 19.113 |
| 0.6426398842592592 | 19.082 | 19.059 | 19.114 |
| 0.6426398842592592 | 19.08 | 19.059 | 19.115 |
| 0.6426398958333334 | 19.077 | 19.06 | 19.117 |
| 0.6426398958333334 | 19.074 | 19.06 | 19.119 |
| 0.6426398958333334 | 19.071 | 19.06 | 19.12 |
| 0.6426398958333334 | 19.068 | 19.06 | 19.122 |
| 0.6426398958333334 | 19.065 | 19.062 | 19.123 |
| 0.6426398958333334 | 19.062 | 19.064 | 19.124 |
| 0.6426399074074074 | 19.059 | 19.066 | 19.124 |
| 0.6426399074074074 | 19.056 | 19.067 | 19.124 |
| 0.6426399074074074 | 19.054 | 19.069 | 19.124 |
| 0.6426399074074074 | 19.051 | 19.071 | 19.124 |
| 0.6426399074074074 | 19.05 | 19.074 | 19.124 |
| 0.6426399074074074 | 19.049 | 19.076 | 19.123 |
| 0.6426399074074074 | 19.048 | 19.079 | 19.122 |
| 0.6426399189814814 | 19.047 | 19.081 | 19.121 |
| 0.6426399189814814 | 19.045 | 19.084 | 19.12 |
| 0.6426399189814814 | 19.044 | 19.086 | 19.118 |
| 0.6426399189814814 | 19.043 | 19.089 | 19.117 |
| 0.6426399189814814 | 19.043 | 19.092 | 19.115 |
| 0.6426399189814814 | 19.042 | 19.094 | 19.112 |
| 0.6426399305555556 | 19.042 | 19.096 | 19.11 |
| 0.6426399305555556 | 19.043 | 19.098 | 19.108 |
| 0.6426399305555556 | 19.044 | 19.101 | 19.105 |
| 0.6426399305555556 | 19.046 | 19.103 | 19.103 |
| 0.6426399305555556 | 19.048 | 19.105 | 19.101 |
| 0.6426399305555556 | 19.051 | 19.106 | 19.099 |
| 0.6426399305555556 | 19.054 | 19.108 | 19.097 |
| 0.6426399421296296 | 19.057 | 19.109 | 19.094 |
| 0.6426399421296296 | 19.06 | 19.109 | 19.092 |
| 0.6426399421296296 | 19.063 | 19.11 | 19.09 |
| 0.6426399421296296 | 19.067 | 19.11 | 19.089 |
| 0.6426399421296296 | 19.07 | 19.11 | 19.087 |
| 0.6426399421296296 | 19.072 | 19.109 | 19.085 |
| 0.6426399537037036 | 19.075 | 19.109 | 19.084 |
| 0.6426399537037036 | 19.079 | 19.108 | 19.085 |
| 0.6426399537037036 | 19.082 | 19.107 | 19.085 |
| 0.6426399537037036 | 19.085 | 19.106 | 19.084 |
| 0.6426399537037036 | 19.087 | 19.105 | 19.084 |
| 0.6426399537037036 | 19.091 | 19.103 | 19.085 |
| 0.6426399652777778 | 19.094 | 19.101 | 19.086 |
| 0.6426399652777778 | 19.097 | 19.099 | 19.087 |
| 0.6426399652777778 | 19.099 | 19.097 | 19.087 |
| 0.6426399652777778 | 19.102 | 19.096 | 19.089 |
| 0.6426399652777778 | 19.105 | 19.093 | 19.092 |
| 0.6426399652777778 | 19.107 | 19.091 | 19.093 |
| 0.6426399652777778 | 19.108 | 19.089 | 19.095 |
| 0.6426399768518519 | 19.11 | 19.087 | 19.097 |
| 0.6426399768518519 | 19.111 | 19.085 | 19.1 |
| 0.6426399768518519 | 19.112 | 19.083 | 19.103 |
| 0.6426399768518519 | 19.113 | 19.081 | 19.106 |
| 0.6426399768518519 | 19.113 | 19.08 | 19.108 |
| 0.6426399768518519 | 19.114 | 19.079 | 19.111 |
| 0.642639988425926 | 19.114 | 19.077 | 19.114 |
| 0.642639988425926 | 19.113 | 19.075 | 19.117 |
| 0.642639988425926 | 19.113 | 19.075 | 19.12 |
| 0.642639988425926 | 19.112 | 19.076 | 19.125 |
| 0.642639988425926 | 19.111 | 19.076 | 19.127 |
| 0.642639988425926 | 19.11 | 19.076 | 19.13 |
| 0.642639988425926 | 19.109 | 19.076 | 19.133 |
| 0.64264 | 19.108 | 19.078 | 19.137 |
| 0.64264 | 19.107 | 19.08 | 19.14 |
| 0.64264 | 19.106 | 19.081 | 19.142 |
| 0.64264 | 19.104 | 19.082 | 19.144 |
| 0.64264 | 19.103 | 19.085 | 19.147 |
| 0.64264 | 19.101 | 19.088 | 19.149 |
| 0.6426400115740741 | 19.099 | 19.089 | 19.152 |
| 0.6426400115740741 | 19.097 | 19.091 | 19.153 |
| 0.6426400115740741 | 19.095 | 19.093 | 19.155 |
| 0.6426400115740741 | 19.093 | 19.097 | 19.157 |
| 0.6426400115740741 | 19.091 | 19.1 | 19.158 |
| 0.6426400115740741 | 19.089 | 19.103 | 19.159 |
| 0.6426400231481482 | 19.087 | 19.106 | 19.16 |
| 0.6426400231481482 | 19.086 | 19.11 | 19.16 |
| 0.6426400231481482 | 19.085 | 19.114 | 19.16 |
| 0.6426400231481482 | 19.084 | 19.118 | 19.16 |
| 0.6426400231481482 | 19.083 | 19.122 | 19.159 |
| 0.6426400231481482 | 19.083 | 19.126 | 19.159 |
| 0.6426400231481482 | 19.083 | 19.129 | 19.158 |
| 0.6426400347222222 | 19.083 | 19.133 | 19.157 |
| 0.6426400347222222 | 19.084 | 19.136 | 19.156 |
| 0.6426400347222222 | 19.084 | 19.139 | 19.155 |
| 0.6426400347222222 | 19.085 | 19.142 | 19.153 |
| 0.6426400347222222 | 19.085 | 19.144 | 19.152 |
| 0.6426400347222222 | 19.085 | 19.146 | 19.15 |
| 0.6426400462962963 | 19.087 | 19.149 | 19.148 |
| 0.6426400462962963 | 19.088 | 19.151 | 19.146 |
| 0.6426400462962963 | 19.089 | 19.154 | 19.144 |
| 0.6426400462962963 | 19.09 | 19.155 | 19.142 |
| 0.6426400462962963 | 19.093 | 19.157 | 19.139 |
| 0.6426400462962963 | 19.096 | 19.159 | 19.137 |
| 0.6426400462962963 | 19.099 | 19.161 | 19.134 |
| 0.6426400578703704 | 19.102 | 19.162 | 19.132 |
| 0.6426400578703704 | 19.105 | 19.162 | 19.13 |
| 0.6426400578703704 | 19.109 | 19.163 | 19.129 |
| 0.6426400578703704 | 19.112 | 19.163 | 19.128 |
| 0.6426400578703704 | 19.116 | 19.163 | 19.127 |
| 0.6426400578703704 | 19.119 | 19.163 | 19.127 |
| 0.6426400694444444 | 19.123 | 19.162 | 19.127 |
| 0.6426400694444444 | 19.126 | 19.161 | 19.127 |
| 0.6426400694444444 | 19.129 | 19.16 | 19.126 |
| 0.6426400694444444 | 19.131 | 19.159 | 19.126 |
| 0.6426400694444444 | 19.135 | 19.158 | 19.127 |
| 0.6426400694444444 | 19.139 | 19.156 | 19.128 |
| 0.6426400810185185 | 19.142 | 19.155 | 19.127 |
| 0.6426400810185185 | 19.144 | 19.153 | 19.127 |
| 0.6426400810185185 | 19.147 | 19.151 | 19.128 |
| 0.6426400810185185 | 19.15 | 19.148 | 19.13 |
| 0.6426400810185185 | 19.153 | 19.145 | 19.132 |
| 0.6426400810185185 | 19.155 | 19.143 | 19.134 |
| 0.6426400810185185 | 19.157 | 19.14 | 19.136 |
| 0.6426400925925926 | 19.16 | 19.138 | 19.14 |
| 0.6426400925925926 | 19.161 | 19.135 | 19.143 |
| 0.6426400925925926 | 19.163 | 19.133 | 19.147 |
| 0.6426400925925926 | 19.164 | 19.131 | 19.151 |
| 0.6426400925925926 | 19.164 | 19.131 | 19.155 |
| 0.6426400925925926 | 19.164 | 19.13 | 19.159 |
| 0.6426401041666666 | 19.164 | 19.13 | 19.163 |
| 0.6426401041666666 | 19.164 | 19.13 | 19.167 |
| 0.6426401041666666 | 19.164 | 19.13 | 19.171 |
| 0.6426401041666666 | 19.163 | 19.13 | 19.175 |
| 0.6426401041666666 | 19.162 | 19.13 | 19.179 |
| 0.6426401041666666 | 19.161 | 19.131 | 19.183 |
| 0.6426401041666666 | 19.16 | 19.132 | 19.187 |
| 0.6426401157407408 | 19.158 | 19.132 | 19.19 |
| 0.6426401157407408 | 19.156 | 19.131 | 19.192 |
| 0.6426401157407408 | 19.155 | 19.132 | 19.196 |
| 0.6426401157407408 | 19.153 | 19.135 | 19.199 |
| 0.6426401157407408 | 19.151 | 19.137 | 19.202 |
| 0.6426401157407408 | 19.149 | 19.138 | 19.205 |
| 0.6426401273148148 | 19.147 | 19.14 | 19.207 |
| 0.6426401273148148 | 19.145 | 19.143 | 19.209 |
| 0.6426401273148148 | 19.143 | 19.148 | 19.211 |
| 0.6426401273148148 | 19.142 | 19.151 | 19.213 |
| 0.6426401273148148 | 19.14 | 19.153 | 19.214 |
| 0.6426401273148148 | 19.138 | 19.156 | 19.215 |
| 0.6426401388888888 | 19.137 | 19.16 | 19.215 |
| 0.6426401388888888 | 19.136 | 19.164 | 19.216 |
| 0.6426401388888888 | 19.135 | 19.168 | 19.216 |
| 0.6426401388888888 | 19.135 | 19.171 | 19.216 |
| 0.6426401388888888 | 19.135 | 19.174 | 19.215 |
| 0.6426401388888888 | 19.134 | 19.178 | 19.215 |
| 0.6426401388888888 | 19.134 | 19.181 | 19.214 |
| 0.642640150462963 | 19.134 | 19.185 | 19.213 |
| 0.642640150462963 | 19.136 | 19.189 | 19.212 |
| 0.642640150462963 | 19.137 | 19.193 | 19.211 |
| 0.642640150462963 | 19.138 | 19.196 | 19.209 |
| 0.642640150462963 | 19.139 | 19.2 | 19.207 |
| 0.642640150462963 | 19.141 | 19.203 | 19.206 |
| 0.6426401620370371 | 19.143 | 19.207 | 19.203 |
| 0.6426401620370371 | 19.145 | 19.209 | 19.202 |
| 0.6426401620370371 | 19.148 | 19.212 | 19.2 |
| 0.6426401620370371 | 19.151 | 19.214 | 19.198 |
| 0.6426401620370371 | 19.154 | 19.217 | 19.195 |
| 0.6426401620370371 | 19.156 | 19.218 | 19.193 |
| 0.6426401620370371 | 19.159 | 19.22 | 19.191 |
| 0.6426401736111111 | 19.162 | 19.221 | 19.189 |
| 0.6426401736111111 | 19.166 | 19.222 | 19.188 |
| 0.6426401736111111 | 19.169 | 19.222 | 19.186 |
| 0.6426401736111111 | 19.171 | 19.222 | 19.184 |
| 0.6426401736111111 | 19.175 | 19.222 | 19.183 |
| 0.6426401736111111 | 19.178 | 19.222 | 19.182 |
| 0.6426401851851852 | 19.181 | 19.221 | 19.181 |
| 0.6426401851851852 | 19.183 | 19.221 | 19.181 |
| 0.6426401851851852 | 19.186 | 19.22 | 19.181 |
| 0.6426401851851852 | 19.19 | 19.219 | 19.182 |
| 0.6426401851851852 | 19.193 | 19.218 | 19.181 |
| 0.6426401851851852 | 19.196 | 19.216 | 19.181 |
| 0.6426401967592593 | 19.198 | 19.215 | 19.181 |
| 0.6426401967592593 | 19.202 | 19.213 | 19.184 |
| 0.6426401967592593 | 19.205 | 19.211 | 19.186 |
| 0.6426401967592593 | 19.207 | 19.209 | 19.186 |
| 0.6426401967592593 | 19.209 | 19.207 | 19.186 |
| 0.6426401967592593 | 19.211 | 19.205 | 19.189 |
| 0.6426401967592593 | 19.214 | 19.203 | 19.193 |
| 0.6426402083333334 | 19.216 | 19.201 | 19.196 |
| 0.6426402083333334 | 19.217 | 19.199 | 19.199 |
| 0.6426402083333334 | 19.218 | 19.197 | 19.202 |
| 0.6426402083333334 | 19.219 | 19.196 | 19.206 |
| 0.6426402083333334 | 19.22 | 19.195 | 19.21 |
| 0.6426402083333334 | 19.22 | 19.194 | 19.215 |
| 0.6426402199074074 | 19.22 | 19.194 | 19.218 |
| 0.6426402199074074 | 19.22 | 19.195 | 19.222 |
| 0.6426402199074074 | 19.22 | 19.194 | 19.226 |
| 0.6426402199074074 | 19.219 | 19.193 | 19.229 |
| 0.6426402199074074 | 19.218 | 19.194 | 19.232 |
| 0.6426402199074074 | 19.217 | 19.194 | 19.236 |
| 0.6426402199074074 | 19.216 | 19.193 | 19.239 |
| 0.6426402314814815 | 19.215 | 19.193 | 19.241 |
| 0.6426402314814815 | 19.213 | 19.193 | 19.244 |
| 0.6426402314814815 | 19.211 | 19.194 | 19.248 |
| 0.6426402314814815 | 19.209 | 19.194 | 19.251 |
| 0.6426402314814815 | 19.206 | 19.194 | 19.254 |
| 0.6426402314814815 | 19.204 | 19.196 | 19.256 |
| 0.6426402430555556 | 19.202 | 19.198 | 19.259 |
| 0.6426402430555556 | 19.199 | 19.202 | 19.262 |
| 0.6426402430555556 | 19.197 | 19.204 | 19.264 |
| 0.6426402430555556 | 19.195 | 19.207 | 19.265 |
| 0.6426402430555556 | 19.193 | 19.211 | 19.267 |
| 0.6426402430555556 | 19.192 | 19.215 | 19.268 |
| 0.6426402546296296 | 19.192 | 19.219 | 19.268 |
| 0.6426402546296296 | 19.19 | 19.223 | 19.269 |
| 0.6426402546296296 | 19.19 | 19.226 | 19.269 |
| 0.6426402546296296 | 19.19 | 19.23 | 19.269 |
| 0.6426402546296296 | 19.189 | 19.233 | 19.269 |
| 0.6426402546296296 | 19.188 | 19.236 | 19.268 |
| 0.6426402546296296 | 19.188 | 19.239 | 19.268 |
| 0.6426402662037037 | 19.188 | 19.243 | 19.266 |
| 0.6426402662037037 | 19.187 | 19.246 | 19.265 |
| 0.6426402662037037 | 19.186 | 19.249 | 19.264 |
| 0.6426402662037037 | 19.187 | 19.252 | 19.262 |
| 0.6426402662037037 | 19.189 | 19.256 | 19.261 |
| 0.6426402662037037 | 19.191 | 19.259 | 19.259 |
| 0.6426402777777778 | 19.192 | 19.262 | 19.257 |
| 0.6426402777777778 | 19.193 | 19.265 | 19.255 |
| 0.6426402777777778 | 19.196 | 19.267 | 19.253 |
| 0.6426402777777778 | 19.2 | 19.27 | 19.251 |
| 0.6426402777777778 | 19.203 | 19.272 | 19.25 |
| 0.6426402777777778 | 19.206 | 19.273 | 19.248 |
| 0.6426402777777778 | 19.209 | 19.275 | 19.247 |
| 0.6426402893518518 | 19.212 | 19.276 | 19.245 |
| 0.6426402893518518 | 19.216 | 19.277 | 19.244 |
| 0.6426402893518518 | 19.219 | 19.277 | 19.243 |
| 0.6426402893518518 | 19.222 | 19.277 | 19.242 |
| 0.6426402893518518 | 19.225 | 19.277 | 19.242 |
| 0.6426402893518518 | 19.228 | 19.277 | 19.24 |
| 0.642640300925926 | 19.231 | 19.277 | 19.239 |
| 0.642640300925926 | 19.235 | 19.276 | 19.24 |
| 0.642640300925926 | 19.239 | 19.275 | 19.24 |
| 0.642640300925926 | 19.242 | 19.274 | 19.24 |
| 0.642640300925926 | 19.245 | 19.273 | 19.24 |
| 0.642640300925926 | 19.248 | 19.272 | 19.241 |
| 0.6426403125 | 19.252 | 19.27 | 19.243 |
| 0.6426403125 | 19.255 | 19.268 | 19.245 |
| 0.6426403125 | 19.258 | 19.267 | 19.245 |
| 0.6426403125 | 19.259 | 19.266 | 19.247 |
| 0.6426403125 | 19.262 | 19.264 | 19.25 |
| 0.6426403125 | 19.264 | 19.263 | 19.253 |
| 0.6426403125 | 19.266 | 19.261 | 19.255 |
| 0.642640324074074 | 19.267 | 19.259 | 19.257 |
| 0.642640324074074 | 19.269 | 19.258 | 19.259 |
| 0.642640324074074 | 19.27 | 19.257 | 19.263 |
| 0.642640324074074 | 19.271 | 19.257 | 19.266 |
| 0.642640324074074 | 19.271 | 19.255 | 19.269 |
| 0.642640324074074 | 19.271 | 19.255 | 19.272 |
| 0.6426403356481482 | 19.271 | 19.254 | 19.275 |
| 0.6426403356481482 | 19.271 | 19.254 | 19.278 |
| 0.6426403356481482 | 19.271 | 19.254 | 19.281 |
| 0.6426403356481482 | 19.271 | 19.255 | 19.284 |
| 0.6426403356481482 | 19.27 | 19.256 | 19.287 |
| 0.6426403356481482 | 19.269 | 19.256 | 19.29 |
| 0.6426403356481482 | 19.268 | 19.256 | 19.292 |
| 0.6426403472222222 | 19.268 | 19.257 | 19.296 |
| 0.6426403472222222 | 19.267 | 19.259 | 19.299 |
| 0.6426403472222222 | 19.265 | 19.261 | 19.301 |
| 0.6426403472222222 | 19.264 | 19.262 | 19.303 |
| 0.6426403472222222 | 19.263 | 19.263 | 19.306 |
| 0.6426403472222222 | 19.261 | 19.265 | 19.309 |
| 0.6426403587962963 | 19.259 | 19.268 | 19.311 |
| 0.6426403587962963 | 19.257 | 19.271 | 19.313 |
| 0.6426403587962963 | 19.256 | 19.273 | 19.315 |
| 0.6426403587962963 | 19.254 | 19.276 | 19.316 |
| 0.6426403587962963 | 19.252 | 19.28 | 19.318 |
| 0.6426403587962963 | 19.251 | 19.283 | 19.319 |
| 0.6426403703703704 | 19.249 | 19.286 | 19.319 |
| 0.6426403703703704 | 19.249 | 19.289 | 19.32 |
| 0.6426403703703704 | 19.248 | 19.292 | 19.32 |
| 0.6426403703703704 | 19.247 | 19.295 | 19.32 |
| 0.6426403703703704 | 19.246 | 19.297 | 19.32 |
| 0.6426403703703704 | 19.246 | 19.299 | 19.319 |
| 0.6426403703703704 | 19.246 | 19.302 | 19.319 |
| 0.6426403819444445 | 19.245 | 19.304 | 19.318 |
| 0.6426403819444445 | 19.244 | 19.306 | 19.317 |
| 0.6426403819444445 | 19.244 | 19.308 | 19.316 |
| 0.6426403819444445 | 19.245 | 19.311 | 19.315 |
| 0.6426403819444445 | 19.246 | 19.313 | 19.314 |
| 0.6426403819444445 | 19.246 | 19.315 | 19.313 |
| 0.6426403935185185 | 19.246 | 19.316 | 19.312 |
| 0.6426403935185185 | 19.248 | 19.318 | 19.31 |
| 0.6426403935185185 | 19.25 | 19.321 | 19.309 |
| 0.6426403935185185 | 19.252 | 19.322 | 19.307 |
| 0.6426403935185185 | 19.254 | 19.324 | 19.306 |
| 0.6426403935185185 | 19.256 | 19.325 | 19.305 |
| 0.6426403935185185 | 19.259 | 19.326 | 19.304 |
| 0.6426404050925926 | 19.263 | 19.327 | 19.303 |
| 0.6426404050925926 | 19.266 | 19.328 | 19.303 |
| 0.6426404050925926 | 19.269 | 19.328 | 19.302 |
| 0.6426404050925926 | 19.272 | 19.328 | 19.302 |
| 0.6426404050925926 | 19.275 | 19.328 | 19.301 |
| 0.6426404050925926 | 19.278 | 19.328 | 19.301 |
| 0.6426404166666667 | 19.281 | 19.328 | 19.302 |
| 0.6426404166666667 | 19.284 | 19.327 | 19.302 |
| 0.6426404166666667 | 19.286 | 19.327 | 19.301 |
| 0.6426404166666667 | 19.288 | 19.326 | 19.301 |
| 0.6426404166666667 | 19.291 | 19.325 | 19.302 |
| 0.6426404166666667 | 19.294 | 19.324 | 19.303 |
| 0.6426404282407407 | 19.297 | 19.323 | 19.304 |
| 0.6426404282407407 | 19.298 | 19.322 | 19.304 |
| 0.6426404282407407 | 19.3 | 19.321 | 19.304 |
| 0.6426404282407407 | 19.302 | 19.319 | 19.307 |
| 0.6426404282407407 | 19.305 | 19.318 | 19.309 |
| 0.6426404282407407 | 19.306 | 19.317 | 19.31 |
| 0.6426404282407407 | 19.307 | 19.316 | 19.311 |
| 0.6426404398148148 | 19.308 | 19.315 | 19.313 |
| 0.6426404398148148 | 19.309 | 19.314 | 19.316 |
| 0.6426404398148148 | 19.31 | 19.313 | 19.319 |
| 0.6426404398148148 | 19.31 | 19.313 | 19.32 |
| 0.6426404398148148 | 19.311 | 19.312 | 19.322 |
| 0.6426404398148148 | 19.311 | 19.312 | 19.325 |
| 0.6426404513888889 | 19.311 | 19.311 | 19.327 |
| 0.6426404513888889 | 19.311 | 19.31 | 19.329 |
| 0.6426404513888889 | 19.311 | 19.31 | 19.331 |
| 0.6426404513888889 | 19.31 | 19.311 | 19.334 |
| 0.6426404513888889 | 19.31 | 19.31 | 19.335 |
| 0.6426404513888889 | 19.309 | 19.31 | 19.337 |
| 0.6426404513888889 | 19.309 | 19.311 | 19.34 |
| 0.642640462962963 | 19.308 | 19.312 | 19.342 |
| 0.642640462962963 | 19.307 | 19.314 | 19.345 |
| 0.642640462962963 | 19.306 | 19.315 | 19.347 |
| 0.642640462962963 | 19.306 | 19.316 | 19.348 |
| 0.642640462962963 | 19.305 | 19.318 | 19.351 |
| 0.642640462962963 | 19.303 | 19.32 | 19.353 |
| 0.642640474537037 | 19.302 | 19.322 | 19.354 |
| 0.642640474537037 | 19.301 | 19.323 | 19.355 |
| 0.642640474537037 | 19.3 | 19.325 | 19.357 |
| 0.642640474537037 | 19.299 | 19.327 | 19.358 |
| 0.642640474537037 | 19.298 | 19.329 | 19.358 |
| 0.642640474537037 | 19.297 | 19.33 | 19.359 |
| 0.6426404861111111 | 19.296 | 19.332 | 19.359 |
| 0.6426404861111111 | 19.296 | 19.334 | 19.36 |
| 0.6426404861111111 | 19.294 | 19.335 | 19.36 |
| 0.6426404861111111 | 19.293 | 19.337 | 19.36 |
| 0.6426404861111111 | 19.293 | 19.339 | 19.36 |
| 0.6426404861111111 | 19.293 | 19.341 | 19.359 |
| 0.6426404861111111 | 19.292 | 19.342 | 19.359 |
| 0.6426404976851852 | 19.291 | 19.343 | 19.359 |
| 0.6426404976851852 | 19.291 | 19.346 | 19.358 |
| 0.6426404976851852 | 19.293 | 19.348 | 19.357 |
| 0.6426404976851852 | 19.293 | 19.35 | 19.356 |
| 0.6426404976851852 | 19.292 | 19.351 | 19.355 |
| 0.6426404976851852 | 19.292 | 19.352 | 19.355 |
| 0.6426405092592592 | 19.294 | 19.354 | 19.354 |
| 0.6426405092592592 | 19.295 | 19.356 | 19.352 |
| 0.6426405092592592 | 19.296 | 19.358 | 19.351 |
| 0.6426405092592592 | 19.296 | 19.359 | 19.35 |
| 0.6426405092592592 | 19.297 | 19.36 | 19.349 |
| 0.6426405092592592 | 19.298 | 19.361 | 19.347 |
| 0.6426405092592592 | 19.3 | 19.361 | 19.346 |
| 0.6426405208333333 | 19.302 | 19.362 | 19.346 |
| 0.6426405208333333 | 19.303 | 19.362 | 19.345 |
| 0.6426405208333333 | 19.304 | 19.362 | 19.344 |
| 0.6426405208333333 | 19.305 | 19.363 | 19.343 |
| 0.6426405208333333 | 19.307 | 19.363 | 19.342 |
| 0.6426405208333333 | 19.308 | 19.363 | 19.342 |
| 0.6426405324074074 | 19.31 | 19.362 | 19.342 |
| 0.6426405324074074 | 19.311 | 19.362 | 19.341 |
| 0.6426405324074074 | 19.312 | 19.362 | 19.34 |
| 0.6426405324074074 | 19.314 | 19.361 | 19.34 |
| 0.6426405324074074 | 19.316 | 19.361 | 19.341 |
| 0.6426405324074074 | 19.317 | 19.36 | 19.341 |
| 0.6426405439814815 | 19.318 | 19.359 | 19.341 |
| 0.6426405439814815 | 19.32 | 19.359 | 19.342 |
| 0.6426405439814815 | 19.322 | 19.358 | 19.344 |
| 0.6426405439814815 | 19.324 | 19.357 | 19.345 |
| 0.6426405439814815 | 19.325 | 19.356 | 19.346 |
| 0.6426405439814815 | 19.326 | 19.355 | 19.346 |
| 0.6426405439814815 | 19.327 | 19.354 | 19.348 |
| 0.6426405555555555 | 19.329 | 19.353 | 19.35 |
| 0.6426405555555555 | 19.329 | 19.352 | 19.351 |
| 0.6426405555555555 | 19.33 | 19.35 | 19.352 |
| 0.6426405555555555 | 19.33 | 19.349 | 19.353 |
| 0.6426405555555555 | 19.331 | 19.348 | 19.355 |
| 0.6426405555555555 | 19.331 | 19.346 | 19.356 |
| 0.6426405671296297 | 19.331 | 19.345 | 19.357 |
| 0.6426405671296297 | 19.331 | 19.344 | 19.358 |
| 0.6426405671296297 | 19.331 | 19.343 | 19.36 |
| 0.6426405671296297 | 19.33 | 19.341 | 19.362 |
| 0.6426405671296297 | 19.33 | 19.339 | 19.362 |
| 0.6426405671296297 | 19.329 | 19.34 | 19.364 |
| 0.6426405671296297 | 19.329 | 19.341 | 19.367 |
| 0.6426405787037037 | 19.328 | 19.341 | 19.369 |
| 0.6426405787037037 | 19.327 | 19.34 | 19.37 |
| 0.6426405787037037 | 19.326 | 19.34 | 19.372 |
| 0.6426405787037037 | 19.325 | 19.342 | 19.373 |
| 0.6426405787037037 | 19.324 | 19.343 | 19.375 |
| 0.6426405787037037 | 19.323 | 19.343 | 19.376 |
| 0.6426405902777778 | 19.322 | 19.344 | 19.377 |
| 0.6426405902777778 | 19.321 | 19.344 | 19.378 |
| 0.6426405902777778 | 19.32 | 19.345 | 19.379 |
| 0.6426405902777778 | 19.319 | 19.346 | 19.38 |
| 0.6426405902777778 | 19.318 | 19.347 | 19.38 |
| 0.6426405902777778 | 19.318 | 19.349 | 19.381 |
| 0.6426406018518519 | 19.317 | 19.35 | 19.381 |
| 0.6426406018518519 | 19.316 | 19.351 | 19.381 |
| 0.6426406018518519 | 19.315 | 19.352 | 19.382 |
| 0.6426406018518519 | 19.315 | 19.354 | 19.382 |
| 0.6426406018518519 | 19.315 | 19.357 | 19.381 |
| 0.6426406018518519 | 19.314 | 19.358 | 19.381 |
| 0.6426406018518519 | 19.314 | 19.359 | 19.381 |
| 0.6426406134259259 | 19.314 | 19.362 | 19.38 |
| 0.6426406134259259 | 19.315 | 19.365 | 19.38 |
| 0.6426406134259259 | 19.315 | 19.366 | 19.379 |
| 0.6426406134259259 | 19.315 | 19.367 | 19.379 |
| 0.6426406134259259 | 19.316 | 19.369 | 19.378 |
| 0.6426406134259259 | 19.318 | 19.371 | 19.377 |
| 0.642640625 | 19.319 | 19.373 | 19.376 |
| 0.642640625 | 19.318 | 19.373 | 19.375 |
| 0.642640625 | 19.317 | 19.374 | 19.374 |
| 0.642640625 | 19.318 | 19.375 | 19.373 |
| 0.642640625 | 19.319 | 19.376 | 19.371 |
| 0.642640625 | 19.32 | 19.377 | 19.37 |
| 0.642640625 | 19.32 | 19.377 | 19.369 |
| 0.6426406365740741 | 19.32 | 19.378 | 19.368 |
| 0.6426406365740741 | 19.321 | 19.378 | 19.368 |
| 0.6426406365740741 | 19.322 | 19.378 | 19.367 |
| 0.6426406365740741 | 19.323 | 19.378 | 19.365 |
| 0.6426406365740741 | 19.323 | 19.379 | 19.365 |
| 0.6426406365740741 | 19.324 | 19.378 | 19.364 |
| 0.6426406481481481 | 19.326 | 19.378 | 19.363 |
| 0.6426406481481481 | 19.326 | 19.378 | 19.362 |
| 0.6426406481481481 | 19.328 | 19.378 | 19.363 |
| 0.6426406481481481 | 19.329 | 19.377 | 19.363 |
| 0.6426406481481481 | 19.33 | 19.377 | 19.363 |
| 0.6426406481481481 | 19.331 | 19.376 | 19.362 |
| 0.6426406597222222 | 19.333 | 19.376 | 19.363 |
| 0.6426406597222222 | 19.334 | 19.375 | 19.364 |
| 0.6426406597222222 | 19.336 | 19.374 | 19.364 |
| 0.6426406597222222 | 19.336 | 19.373 | 19.364 |
| 0.6426406597222222 | 19.337 | 19.372 | 19.364 |
| 0.6426406597222222 | 19.338 | 19.371 | 19.364 |
| 0.6426406597222222 | 19.339 | 19.37 | 19.365 |
| 0.6426406712962963 | 19.34 | 19.368 | 19.365 |
| 0.6426406712962963 | 19.34 | 19.368 | 19.365 |
| 0.6426406712962963 | 19.341 | 19.367 | 19.367 |
| 0.6426406712962963 | 19.341 | 19.366 | 19.368 |
| 0.6426406712962963 | 19.342 | 19.365 | 19.368 |
| 0.6426406712962963 | 19.342 | 19.363 | 19.369 |
| 0.6426406828703703 | 19.342 | 19.362 | 19.37 |
| 0.6426406828703703 | 19.342 | 19.361 | 19.372 |
| 0.6426406828703703 | 19.342 | 19.36 | 19.374 |
| 0.6426406828703703 | 19.341 | 19.359 | 19.375 |
| 0.6426406828703703 | 19.341 | 19.359 | 19.377 |
| 0.6426406828703703 | 19.34 | 19.359 | 19.379 |
| 0.6426406828703703 | 19.34 | 19.359 | 19.381 |
| 0.6426406944444444 | 19.339 | 19.358 | 19.382 |
| 0.6426406944444444 | 19.338 | 19.358 | 19.383 |
| 0.6426406944444444 | 19.338 | 19.359 | 19.385 |
| 0.6426406944444444 | 19.337 | 19.359 | 19.386 |
| 0.6426406944444444 | 19.336 | 19.358 | 19.387 |
| 0.6426406944444444 | 19.335 | 19.358 | 19.388 |
| 0.6426407060185185 | 19.334 | 19.359 | 19.389 |
| 0.6426407060185185 | 19.333 | 19.359 | 19.39 |
| 0.6426407060185185 | 19.331 | 19.359 | 19.39 |
| 0.6426407060185185 | 19.33 | 19.359 | 19.391 |
| 0.6426407060185185 | 19.329 | 19.36 | 19.391 |
| 0.6426407060185185 | 19.328 | 19.36 | 19.392 |
| 0.6426407175925926 | 19.327 | 19.361 | 19.392 |
| 0.6426407175925926 | 19.325 | 19.361 | 19.392 |
| 0.6426407175925926 | 19.324 | 19.362 | 19.393 |
| 0.6426407175925926 | 19.323 | 19.363 | 19.393 |
| 0.6426407175925926 | 19.321 | 19.364 | 19.392 |
| 0.6426407175925926 | 19.32 | 19.365 | 19.392 |
| 0.6426407175925926 | 19.32 | 19.367 | 19.392 |
| 0.6426407291666667 | 19.321 | 19.369 | 19.392 |
| 0.6426407291666667 | 19.32 | 19.369 | 19.391 |
| 0.6426407291666667 | 19.319 | 19.37 | 19.391 |
| 0.6426407291666667 | 19.32 | 19.371 | 19.39 |
| 0.6426407291666667 | 19.321 | 19.373 | 19.39 |
| 0.6426407291666667 | 19.321 | 19.375 | 19.389 |
| 0.6426407407407407 | 19.32 | 19.375 | 19.388 |
| 0.6426407407407407 | 19.319 | 19.375 | 19.387 |
| 0.6426407407407407 | 19.32 | 19.377 | 19.386 |
| 0.6426407407407407 | 19.32 | 19.378 | 19.385 |
| 0.6426407407407407 | 19.32 | 19.378 | 19.383 |
| 0.6426407407407407 | 19.32 | 19.379 | 19.383 |
| 0.6426407407407407 | 19.322 | 19.379 | 19.382 |
| 0.6426407523148149 | 19.323 | 19.38 | 19.381 |
| 0.6426407523148149 | 19.324 | 19.381 | 19.38 |
| 0.6426407523148149 | 19.325 | 19.381 | 19.378 |
| 0.6426407523148149 | 19.326 | 19.381 | 19.377 |
| 0.6426407523148149 | 19.328 | 19.381 | 19.377 |
| 0.6426407523148149 | 19.33 | 19.381 | 19.376 |
| 0.6426407638888889 | 19.331 | 19.381 | 19.374 |
| 0.6426407638888889 | 19.332 | 19.381 | 19.374 |
| 0.6426407638888889 | 19.333 | 19.38 | 19.374 |
| 0.6426407638888889 | 19.334 | 19.38 | 19.373 |
| 0.6426407638888889 | 19.334 | 19.379 | 19.371 |
| 0.6426407638888889 | 19.335 | 19.379 | 19.371 |
| 0.6426407754629629 | 19.336 | 19.378 | 19.371 |
| 0.6426407754629629 | 19.337 | 19.377 | 19.37 |
| 0.6426407754629629 | 19.338 | 19.376 | 19.368 |
| 0.6426407754629629 | 19.338 | 19.375 | 19.368 |
| 0.6426407754629629 | 19.34 | 19.374 | 19.368 |
| 0.6426407754629629 | 19.34 | 19.373 | 19.368 |
| 0.6426407754629629 | 19.341 | 19.371 | 19.367 |
| 0.6426407870370371 | 19.342 | 19.37 | 19.367 |
| 0.6426407870370371 | 19.342 | 19.369 | 19.368 |
| 0.6426407870370371 | 19.342 | 19.368 | 19.368 |
| 0.6426407870370371 | 19.343 | 19.368 | 19.368 |
| 0.6426407870370371 | 19.343 | 19.366 | 19.369 |
| 0.6426407870370371 | 19.343 | 19.366 | 19.37 |
| 0.6426407986111111 | 19.343 | 19.365 | 19.37 |
| 0.6426407986111111 | 19.343 | 19.364 | 19.371 |
| 0.6426407986111111 | 19.343 | 19.363 | 19.371 |
| 0.6426407986111111 | 19.343 | 19.363 | 19.372 |
| 0.6426407986111111 | 19.342 | 19.363 | 19.374 |
| 0.6426407986111111 | 19.342 | 19.361 | 19.374 |
| 0.6426407986111111 | 19.342 | 19.36 | 19.374 |
| 0.6426408101851852 | 19.341 | 19.359 | 19.375 |
| 0.6426408101851852 | 19.34 | 19.359 | 19.377 |
| 0.6426408101851852 | 19.339 | 19.359 | 19.378 |
| 0.6426408101851852 | 19.338 | 19.357 | 19.379 |
| 0.6426408101851852 | 19.337 | 19.356 | 19.379 |
| 0.6426408101851852 | 19.336 | 19.356 | 19.38 |
| 0.6426408217592593 | 19.335 | 19.356 | 19.382 |
| 0.6426408217592593 | 19.333 | 19.356 | 19.382 |
| 0.6426408217592593 | 19.332 | 19.355 | 19.383 |
| 0.6426408217592593 | 19.331 | 19.355 | 19.383 |
| 0.6426408217592593 | 19.33 | 19.355 | 19.384 |
| 0.6426408217592593 | 19.328 | 19.356 | 19.384 |
| 0.6426408333333333 | 19.326 | 19.356 | 19.385 |
| 0.6426408333333333 | 19.325 | 19.355 | 19.385 |
| 0.6426408333333333 | 19.323 | 19.356 | 19.385 |
| 0.6426408333333333 | 19.321 | 19.356 | 19.385 |
| 0.6426408333333333 | 19.32 | 19.357 | 19.385 |
| 0.6426408333333333 | 19.318 | 19.357 | 19.385 |
| 0.6426408333333333 | 19.317 | 19.358 | 19.384 |
| 0.6426408449074074 | 19.315 | 19.358 | 19.384 |
| 0.6426408449074074 | 19.314 | 19.359 | 19.384 |
| 0.6426408449074074 | 19.314 | 19.36 | 19.383 |
| 0.6426408449074074 | 19.313 | 19.362 | 19.382 |
| 0.6426408449074074 | 19.312 | 19.362 | 19.381 |
| 0.6426408449074074 | 19.309 | 19.363 | 19.38 |
| 0.6426408564814815 | 19.309 | 19.364 | 19.379 |
| 0.6426408564814815 | 19.309 | 19.365 | 19.378 |
| 0.6426408564814815 | 19.309 | 19.366 | 19.377 |
| 0.6426408564814815 | 19.308 | 19.366 | 19.375 |
| 0.6426408564814815 | 19.306 | 19.367 | 19.374 |
| 0.6426408564814815 | 19.306 | 19.367 | 19.373 |
| 0.6426408564814815 | 19.307 | 19.368 | 19.372 |
| 0.6426408680555555 | 19.307 | 19.368 | 19.37 |
| 0.6426408680555555 | 19.307 | 19.369 | 19.369 |
| 0.6426408680555555 | 19.307 | 19.369 | 19.367 |
| 0.6426408680555555 | 19.308 | 19.369 | 19.366 |
| 0.6426408680555555 | 19.309 | 19.369 | 19.364 |
| 0.6426408680555555 | 19.309 | 19.369 | 19.362 |
| 0.6426408796296296 | 19.31 | 19.369 | 19.361 |
| 0.6426408796296296 | 19.312 | 19.368 | 19.36 |
| 0.6426408796296296 | 19.312 | 19.368 | 19.358 |
| 0.6426408796296296 | 19.313 | 19.367 | 19.356 |
| 0.6426408796296296 | 19.314 | 19.367 | 19.355 |
| 0.6426408796296296 | 19.315 | 19.366 | 19.355 |
| 0.6426408912037037 | 19.316 | 19.365 | 19.354 |
| 0.6426408912037037 | 19.316 | 19.364 | 19.352 |
| 0.6426408912037037 | 19.317 | 19.363 | 19.351 |
| 0.6426408912037037 | 19.318 | 19.362 | 19.351 |
| 0.6426408912037037 | 19.319 | 19.36 | 19.35 |
| 0.6426408912037037 | 19.32 | 19.359 | 19.349 |
| 0.6426408912037037 | 19.321 | 19.358 | 19.349 |
| 0.6426409027777777 | 19.321 | 19.357 | 19.35 |
| 0.6426409027777777 | 19.322 | 19.355 | 19.349 |
| 0.6426409027777777 | 19.323 | 19.353 | 19.349 |
| 0.6426409027777777 | 19.323 | 19.351 | 19.349 |
| 0.6426409027777777 | 19.323 | 19.35 | 19.349 |
| 0.6426409027777777 | 19.323 | 19.349 | 19.35 |
| 0.6426409143518518 | 19.323 | 19.347 | 19.35 |
| 0.6426409143518518 | 19.323 | 19.345 | 19.35 |
| 0.6426409143518518 | 19.323 | 19.344 | 19.35 |
| 0.6426409143518518 | 19.323 | 19.342 | 19.351 |
| 0.6426409143518518 | 19.323 | 19.34 | 19.351 |
| 0.6426409143518518 | 19.322 | 19.339 | 19.351 |
| 0.6426409143518518 | 19.322 | 19.338 | 19.352 |
| 0.6426409259259259 | 19.321 | 19.338 | 19.353 |
| 0.6426409259259259 | 19.32 | 19.336 | 19.354 |
| 0.6426409259259259 | 19.319 | 19.334 | 19.354 |
| 0.6426409259259259 | 19.319 | 19.333 | 19.354 |
| 0.6426409259259259 | 19.318 | 19.333 | 19.356 |
| 0.6426409259259259 | 19.317 | 19.333 | 19.357 |
| 0.6426409375000001 | 19.315 | 19.332 | 19.357 |
| 0.6426409375000001 | 19.314 | 19.331 | 19.358 |
| 0.6426409375000001 | 19.313 | 19.331 | 19.358 |
| 0.6426409375000001 | 19.312 | 19.331 | 19.359 |
| 0.6426409375000001 | 19.311 | 19.331 | 19.36 |
| 0.6426409375000001 | 19.309 | 19.331 | 19.36 |
| 0.6426409490740741 | 19.308 | 19.331 | 19.36 |
| 0.6426409490740741 | 19.307 | 19.332 | 19.36 |
| 0.6426409490740741 | 19.305 | 19.332 | 19.361 |
| 0.6426409490740741 | 19.303 | 19.333 | 19.361 |
| 0.6426409490740741 | 19.302 | 19.333 | 19.361 |
| 0.6426409490740741 | 19.301 | 19.334 | 19.36 |
| 0.6426409490740741 | 19.299 | 19.334 | 19.36 |
| 0.6426409606481481 | 19.296 | 19.335 | 19.36 |
| 0.6426409606481481 | 19.295 | 19.336 | 19.359 |
| 0.6426409606481481 | 19.294 | 19.337 | 19.358 |
| 0.6426409606481481 | 19.292 | 19.337 | 19.357 |
| 0.6426409606481481 | 19.29 | 19.337 | 19.356 |
| 0.6426409606481481 | 19.289 | 19.338 | 19.356 |
| 0.6426409722222223 | 19.288 | 19.34 | 19.354 |
| 0.6426409722222223 | 19.287 | 19.34 | 19.353 |
| 0.6426409722222223 | 19.285 | 19.341 | 19.351 |
| 0.6426409722222223 | 19.284 | 19.341 | 19.35 |
| 0.6426409722222223 | 19.284 | 19.342 | 19.349 |
| 0.6426409722222223 | 19.284 | 19.342 | 19.347 |
| 0.6426409722222223 | 19.282 | 19.343 | 19.345 |
| 0.6426409837962963 | 19.281 | 19.343 | 19.344 |
| 0.6426409837962963 | 19.281 | 19.343 | 19.342 |
| 0.6426409837962963 | 19.281 | 19.344 | 19.341 |
| 0.6426409837962963 | 19.281 | 19.344 | 19.339 |
| 0.6426409837962963 | 19.281 | 19.344 | 19.337 |
| 0.6426409837962963 | 19.28 | 19.344 | 19.336 |
| 0.6426409953703703 | 19.281 | 19.344 | 19.334 |
| 0.6426409953703703 | 19.282 | 19.343 | 19.332 |
| 0.6426409953703703 | 19.282 | 19.343 | 19.33 |
| 0.6426409953703703 | 19.283 | 19.343 | 19.329 |
| 0.6426409953703703 | 19.284 | 19.342 | 19.329 |
| 0.6426409953703703 | 19.284 | 19.341 | 19.327 |
| 0.6426410069444445 | 19.285 | 19.34 | 19.325 |
| 0.6426410069444445 | 19.285 | 19.339 | 19.324 |
| 0.6426410069444445 | 19.286 | 19.339 | 19.324 |
| 0.6426410069444445 | 19.288 | 19.337 | 19.323 |
| 0.6426410069444445 | 19.288 | 19.336 | 19.322 |
| 0.6426410069444445 | 19.288 | 19.335 | 19.32 |
| 0.6426410069444445 | 19.289 | 19.333 | 19.32 |
| 0.6426410185185185 | 19.29 | 19.331 | 19.32 |
| 0.6426410185185185 | 19.291 | 19.33 | 19.319 |
| 0.6426410185185185 | 19.291 | 19.328 | 19.319 |
| 0.6426410185185185 | 19.291 | 19.326 | 19.319 |
| 0.6426410185185185 | 19.292 | 19.325 | 19.319 |
| 0.6426410185185185 | 19.292 | 19.322 | 19.319 |
| 0.6426410300925925 | 19.292 | 19.32 | 19.319 |
| 0.6426410300925925 | 19.292 | 19.318 | 19.32 |
| 0.6426410300925925 | 19.292 | 19.317 | 19.321 |
| 0.6426410300925925 | 19.292 | 19.314 | 19.321 |
| 0.6426410300925925 | 19.291 | 19.312 | 19.321 |
| 0.6426410300925925 | 19.291 | 19.311 | 19.322 |
| 0.6426410300925925 | 19.29 | 19.31 | 19.324 |
| 0.6426410416666667 | 19.29 | 19.309 | 19.324 |
| 0.6426410416666667 | 19.289 | 19.307 | 19.324 |
| 0.6426410416666667 | 19.288 | 19.306 | 19.325 |
| 0.6426410416666667 | 19.287 | 19.306 | 19.326 |
| 0.6426410416666667 | 19.286 | 19.305 | 19.327 |
| 0.6426410416666667 | 19.285 | 19.303 | 19.327 |
| 0.6426410532407407 | 19.284 | 19.301 | 19.328 |
| 0.6426410532407407 | 19.282 | 19.302 | 19.328 |
| 0.6426410532407407 | 19.281 | 19.302 | 19.329 |
| 0.6426410532407407 | 19.279 | 19.301 | 19.33 |
| 0.6426410532407407 | 19.278 | 19.301 | 19.33 |
| 0.6426410532407407 | 19.277 | 19.301 | 19.331 |
| 0.6426410648148148 | 19.275 | 19.301 | 19.331 |
| 0.6426410648148148 | 19.274 | 19.303 | 19.331 |
| 0.6426410648148148 | 19.273 | 19.303 | 19.332 |
| 0.6426410648148148 | 19.272 | 19.304 | 19.332 |
| 0.6426410648148148 | 19.27 | 19.304 | 19.332 |
| 0.6426410648148148 | 19.269 | 19.305 | 19.331 |
| 0.6426410648148148 | 19.268 | 19.306 | 19.331 |
| 0.6426410763888889 | 19.267 | 19.307 | 19.331 |
| 0.6426410763888889 | 19.266 | 19.308 | 19.33 |
| 0.6426410763888889 | 19.264 | 19.308 | 19.33 |
| 0.6426410763888889 | 19.262 | 19.309 | 19.329 |
| 0.6426410763888889 | 19.262 | 19.309 | 19.328 |
| 0.6426410763888889 | 19.262 | 19.31 | 19.327 |
| 0.6426410879629629 | 19.26 | 19.311 | 19.326 |
| 0.6426410879629629 | 19.259 | 19.311 | 19.325 |
| 0.6426410879629629 | 19.258 | 19.312 | 19.324 |
| 0.6426410879629629 | 19.259 | 19.313 | 19.323 |
| 0.6426410879629629 | 19.259 | 19.314 | 19.321 |
| 0.6426410879629629 | 19.258 | 19.314 | 19.32 |
| 0.6426410879629629 | 19.257 | 19.315 | 19.319 |
| 0.6426410995370371 | 19.257 | 19.315 | 19.317 |
| 0.6426410995370371 | 19.258 | 19.316 | 19.316 |
| 0.6426410995370371 | 19.258 | 19.316 | 19.314 |
| 0.6426410995370371 | 19.258 | 19.316 | 19.312 |
| 0.6426410995370371 | 19.258 | 19.316 | 19.311 |
| 0.6426410995370371 | 19.259 | 19.316 | 19.31 |
| 0.6426411111111111 | 19.259 | 19.316 | 19.308 |
| 0.6426411111111111 | 19.259 | 19.316 | 19.306 |
| 0.6426411111111111 | 19.259 | 19.316 | 19.305 |
| 0.6426411111111111 | 19.26 | 19.315 | 19.304 |
| 0.6426411111111111 | 19.261 | 19.315 | 19.302 |
| 0.6426411111111111 | 19.261 | 19.314 | 19.3 |
| 0.6426411226851853 | 19.261 | 19.314 | 19.3 |
| 0.6426411226851853 | 19.262 | 19.313 | 19.299 |
| 0.6426411226851853 | 19.263 | 19.312 | 19.299 |
| 0.6426411226851853 | 19.264 | 19.311 | 19.297 |
| 0.6426411226851853 | 19.264 | 19.31 | 19.296 |
| 0.6426411226851853 | 19.265 | 19.309 | 19.296 |
| 0.6426411226851853 | 19.265 | 19.307 | 19.295 |
| 0.6426411342592593 | 19.266 | 19.306 | 19.295 |
| 0.6426411342592593 | 19.266 | 19.305 | 19.294 |
| 0.6426411342592593 | 19.267 | 19.303 | 19.294 |
| 0.6426411342592593 | 19.268 | 19.302 | 19.295 |
| 0.6426411342592593 | 19.268 | 19.3 | 19.295 |
| 0.6426411342592593 | 19.268 | 19.298 | 19.296 |
| 0.6426411458333333 | 19.268 | 19.297 | 19.296 |
| 0.6426411458333333 | 19.268 | 19.296 | 19.297 |
| 0.6426411458333333 | 19.268 | 19.294 | 19.297 |
| 0.6426411458333333 | 19.268 | 19.293 | 19.298 |
| 0.6426411458333333 | 19.268 | 19.292 | 19.299 |
| 0.6426411458333333 | 19.267 | 19.291 | 19.301 |
| 0.6426411458333333 | 19.267 | 19.289 | 19.301 |
| 0.6426411574074075 | 19.266 | 19.287 | 19.301 |
| 0.6426411574074075 | 19.265 | 19.286 | 19.302 |
| 0.6426411574074075 | 19.264 | 19.286 | 19.303 |
| 0.6426411574074075 | 19.263 | 19.285 | 19.304 |
| 0.6426411574074075 | 19.262 | 19.283 | 19.304 |
| 0.6426411574074075 | 19.261 | 19.281 | 19.304 |
| 0.6426411689814815 | 19.26 | 19.282 | 19.306 |
| 0.6426411689814815 | 19.258 | 19.282 | 19.307 |
| 0.6426411689814815 | 19.256 | 19.281 | 19.308 |
| 0.6426411689814815 | 19.255 | 19.28 | 19.308 |
| 0.6426411689814815 | 19.253 | 19.28 | 19.309 |
| 0.6426411689814815 | 19.251 | 19.28 | 19.309 |
| 0.6426411805555555 | 19.25 | 19.281 | 19.31 |
| 0.6426411805555555 | 19.248 | 19.281 | 19.31 |
| 0.6426411805555555 | 19.246 | 19.281 | 19.31 |
| 0.6426411805555555 | 19.245 | 19.282 | 19.31 |
| 0.6426411805555555 | 19.244 | 19.283 | 19.31 |
| 0.6426411805555555 | 19.243 | 19.284 | 19.31 |
| 0.6426411805555555 | 19.242 | 19.284 | 19.31 |
| 0.6426411921296297 | 19.241 | 19.285 | 19.309 |
| 0.6426411921296297 | 19.239 | 19.285 | 19.309 |
| 0.6426411921296297 | 19.238 | 19.286 | 19.308 |
| 0.6426411921296297 | 19.238 | 19.287 | 19.308 |
| 0.6426411921296297 | 19.237 | 19.288 | 19.307 |
| 0.6426411921296297 | 19.236 | 19.289 | 19.306 |
| 0.6426412037037037 | 19.235 | 19.29 | 19.305 |
| 0.6426412037037037 | 19.235 | 19.291 | 19.304 |
| 0.6426412037037037 | 19.235 | 19.292 | 19.303 |
| 0.6426412037037037 | 19.235 | 19.293 | 19.301 |
| 0.6426412037037037 | 19.234 | 19.293 | 19.3 |
| 0.6426412037037037 | 19.234 | 19.294 | 19.299 |
| 0.6426412037037037 | 19.235 | 19.295 | 19.297 |
| 0.6426412152777777 | 19.237 | 19.296 | 19.296 |
| 0.6426412152777777 | 19.237 | 19.296 | 19.295 |
| 0.6426412152777777 | 19.237 | 19.296 | 19.293 |
| 0.6426412152777777 | 19.238 | 19.297 | 19.292 |
| 0.6426412152777777 | 19.239 | 19.297 | 19.291 |
| 0.6426412152777777 | 19.24 | 19.297 | 19.289 |
| 0.6426412268518519 | 19.24 | 19.296 | 19.288 |
| 0.6426412268518519 | 19.241 | 19.296 | 19.288 |
| 0.6426412268518519 | 19.243 | 19.296 | 19.288 |
| 0.6426412268518519 | 19.244 | 19.295 | 19.286 |
| 0.6426412268518519 | 19.244 | 19.295 | 19.284 |
| 0.6426412268518519 | 19.245 | 19.294 | 19.284 |
| 0.6426412384259259 | 19.246 | 19.294 | 19.284 |
| 0.6426412384259259 | 19.247 | 19.293 | 19.283 |
| 0.6426412384259259 | 19.248 | 19.292 | 19.281 |
| 0.6426412384259259 | 19.248 | 19.291 | 19.28 |
| 0.6426412384259259 | 19.249 | 19.289 | 19.279 |
| 0.6426412384259259 | 19.25 | 19.288 | 19.279 |
| 0.6426412384259259 | 19.251 | 19.287 | 19.279 |
| 0.6426412499999999 | 19.251 | 19.286 | 19.278 |
| 0.6426412499999999 | 19.251 | 19.284 | 19.278 |
| 0.6426412499999999 | 19.252 | 19.283 | 19.278 |
| 0.6426412499999999 | 19.252 | 19.281 | 19.279 |
| 0.6426412499999999 | 19.253 | 19.28 | 19.279 |
| 0.6426412499999999 | 19.253 | 19.28 | 19.279 |
| 0.6426412615740741 | 19.253 | 19.279 | 19.28 |
| 0.6426412615740741 | 19.253 | 19.277 | 19.28 |
| 0.6426412615740741 | 19.253 | 19.276 | 19.281 |
| 0.6426412615740741 | 19.253 | 19.276 | 19.283 |
| 0.6426412615740741 | 19.252 | 19.275 | 19.284 |
| 0.6426412615740741 | 19.252 | 19.274 | 19.283 |
| 0.6426412615740741 | 19.252 | 19.273 | 19.284 |
| 0.6426412731481481 | 19.251 | 19.273 | 19.286 |
| 0.6426412731481481 | 19.25 | 19.273 | 19.287 |
| 0.6426412731481481 | 19.249 | 19.271 | 19.288 |
| 0.6426412731481481 | 19.249 | 19.27 | 19.288 |
| 0.6426412731481481 | 19.248 | 19.27 | 19.288 |
| 0.6426412731481481 | 19.247 | 19.271 | 19.29 |
| 0.6426412847222222 | 19.246 | 19.271 | 19.291 |
| 0.6426412847222222 | 19.244 | 19.269 | 19.292 |
| 0.6426412847222222 | 19.243 | 19.268 | 19.292 |
| 0.6426412847222222 | 19.242 | 19.269 | 19.293 |
| 0.6426412847222222 | 19.24 | 19.27 | 19.294 |
| 0.6426412847222222 | 19.239 | 19.27 | 19.294 |
| 0.6426412962962963 | 19.237 | 19.27 | 19.294 |
| 0.6426412962962963 | 19.236 | 19.27 | 19.295 |
| 0.6426412962962963 | 19.235 | 19.271 | 19.295 |
| 0.6426412962962963 | 19.233 | 19.272 | 19.295 |
| 0.6426412962962963 | 19.231 | 19.272 | 19.295 |
| 0.6426412962962963 | 19.231 | 19.272 | 19.295 |
| 0.6426412962962963 | 19.23 | 19.273 | 19.295 |
| 0.6426413078703704 | 19.228 | 19.274 | 19.294 |
| 0.6426413078703704 | 19.227 | 19.274 | 19.294 |
| 0.6426413078703704 | 19.226 | 19.275 | 19.293 |
| 0.6426413078703704 | 19.225 | 19.276 | 19.293 |
| 0.6426413078703704 | 19.224 | 19.277 | 19.292 |
| 0.6426413078703704 | 19.223 | 19.277 | 19.291 |
| 0.6426413194444445 | 19.222 | 19.278 | 19.29 |
| 0.6426413194444445 | 19.222 | 19.279 | 19.289 |
| 0.6426413194444445 | 19.22 | 19.28 | 19.288 |
| 0.6426413194444445 | 19.219 | 19.28 | 19.287 |
| 0.6426413194444445 | 19.219 | 19.281 | 19.285 |
| 0.6426413194444445 | 19.219 | 19.282 | 19.284 |
| 0.6426413194444445 | 19.22 | 19.282 | 19.283 |
| 0.6426413310185185 | 19.219 | 19.283 | 19.281 |
| 0.6426413310185185 | 19.219 | 19.283 | 19.279 |
| 0.6426413310185185 | 19.22 | 19.284 | 19.278 |
| 0.6426413310185185 | 19.222 | 19.284 | 19.278 |
| 0.6426413310185185 | 19.222 | 19.284 | 19.276 |
| 0.6426413310185185 | 19.223 | 19.284 | 19.275 |
| 0.6426413425925926 | 19.224 | 19.284 | 19.274 |
| 0.6426413425925926 | 19.226 | 19.283 | 19.273 |
| 0.6426413425925926 | 19.226 | 19.283 | 19.272 |
| 0.6426413425925926 | 19.227 | 19.283 | 19.27 |
| 0.6426413425925926 | 19.228 | 19.282 | 19.27 |
| 0.6426413425925926 | 19.229 | 19.281 | 19.27 |
| 0.6426413541666667 | 19.23 | 19.28 | 19.268 |
| 0.6426413541666667 | 19.231 | 19.279 | 19.266 |
| 0.6426413541666667 | 19.231 | 19.279 | 19.266 |
| 0.6426413541666667 | 19.233 | 19.278 | 19.266 |
| 0.6426413541666667 | 19.234 | 19.276 | 19.266 |
| 0.6426413541666667 | 19.235 | 19.275 | 19.265 |
| 0.6426413541666667 | 19.236 | 19.273 | 19.264 |
| 0.6426413657407407 | 19.236 | 19.272 | 19.264 |
| 0.6426413657407407 | 19.237 | 19.27 | 19.265 |
| 0.6426413657407407 | 19.238 | 19.269 | 19.266 |
| 0.6426413657407407 | 19.238 | 19.267 | 19.266 |
| 0.6426413657407407 | 19.239 | 19.266 | 19.266 |
| 0.6426413657407407 | 19.239 | 19.265 | 19.267 |
| 0.6426413773148149 | 19.239 | 19.264 | 19.268 |
| 0.6426413773148149 | 19.239 | 19.263 | 19.269 |
| 0.6426413773148149 | 19.239 | 19.263 | 19.27 |
| 0.6426413773148149 | 19.239 | 19.262 | 19.271 |
| 0.6426413773148149 | 19.238 | 19.26 | 19.271 |
| 0.6426413773148149 | 19.238 | 19.26 | 19.271 |
| 0.6426413773148149 | 19.238 | 19.26 | 19.273 |
| 0.6426413888888889 | 19.237 | 19.259 | 19.274 |
| 0.6426413888888889 | 19.237 | 19.258 | 19.274 |
| 0.6426413888888889 | 19.236 | 19.256 | 19.274 |
| 0.6426413888888889 | 19.235 | 19.256 | 19.275 |
| 0.6426413888888889 | 19.234 | 19.257 | 19.277 |
| 0.6426413888888889 | 19.233 | 19.256 | 19.278 |
| 0.6426414004629629 | 19.232 | 19.254 | 19.278 |
| 0.6426414004629629 | 19.231 | 19.254 | 19.279 |
| 0.6426414004629629 | 19.23 | 19.255 | 19.28 |
| 0.6426414004629629 | 19.229 | 19.256 | 19.281 |
| 0.6426414004629629 | 19.227 | 19.256 | 19.281 |
| 0.6426414004629629 | 19.226 | 19.256 | 19.281 |
| 0.6426414120370371 | 19.225 | 19.257 | 19.282 |
| 0.6426414120370371 | 19.224 | 19.258 | 19.282 |
| 0.6426414120370371 | 19.223 | 19.259 | 19.282 |
| 0.6426414120370371 | 19.222 | 19.259 | 19.282 |
| 0.6426414120370371 | 19.221 | 19.259 | 19.282 |
| 0.6426414120370371 | 19.22 | 19.26 | 19.282 |
| 0.6426414120370371 | 19.219 | 19.26 | 19.282 |
| 0.6426414236111111 | 19.218 | 19.26 | 19.282 |
| 0.6426414236111111 | 19.217 | 19.261 | 19.281 |
| 0.6426414236111111 | 19.217 | 19.262 | 19.281 |
| 0.6426414236111111 | 19.215 | 19.262 | 19.28 |
| 0.6426414236111111 | 19.213 | 19.262 | 19.279 |
| 0.6426414236111111 | 19.212 | 19.263 | 19.279 |
| 0.6426414351851851 | 19.212 | 19.264 | 19.278 |
| 0.6426414351851851 | 19.212 | 19.265 | 19.277 |
| 0.6426414351851851 | 19.211 | 19.265 | 19.276 |
| 0.6426414351851851 | 19.21 | 19.266 | 19.275 |
| 0.6426414351851851 | 19.21 | 19.266 | 19.274 |
| 0.6426414351851851 | 19.21 | 19.267 | 19.273 |
| 0.6426414351851851 | 19.21 | 19.268 | 19.272 |
| 0.6426414467592593 | 19.21 | 19.268 | 19.271 |
| 0.6426414467592593 | 19.211 | 19.268 | 19.269 |
| 0.6426414467592593 | 19.211 | 19.268 | 19.268 |
| 0.6426414467592593 | 19.211 | 19.269 | 19.267 |
| 0.6426414467592593 | 19.212 | 19.269 | 19.266 |
| 0.6426414467592593 | 19.212 | 19.269 | 19.265 |
| 0.6426414583333333 | 19.213 | 19.269 | 19.264 |
| 0.6426414583333333 | 19.213 | 19.268 | 19.262 |
| 0.6426414583333333 | 19.213 | 19.268 | 19.26 |
| 0.6426414583333333 | 19.214 | 19.268 | 19.26 |
| 0.6426414583333333 | 19.215 | 19.267 | 19.26 |
| 0.6426414583333333 | 19.215 | 19.267 | 19.259 |
| 0.6426414699074073 | 19.215 | 19.266 | 19.257 |
| 0.6426414699074073 | 19.215 | 19.266 | 19.256 |
| 0.6426414699074073 | 19.217 | 19.265 | 19.257 |
| 0.6426414699074073 | 19.218 | 19.264 | 19.257 |
| 0.6426414699074073 | 19.218 | 19.263 | 19.256 |
| 0.6426414699074073 | 19.219 | 19.262 | 19.255 |
| 0.6426414699074073 | 19.219 | 19.261 | 19.256 |
| 0.6426414814814815 | 19.22 | 19.26 | 19.256 |
| 0.6426414814814815 | 19.221 | 19.259 | 19.257 |
| 0.6426414814814815 | 19.221 | 19.258 | 19.257 |
| 0.6426414814814815 | 19.222 | 19.256 | 19.257 |
| 0.6426414814814815 | 19.222 | 19.255 | 19.258 |
| 0.6426414814814815 | 19.223 | 19.254 | 19.26 |
| 0.6426414930555556 | 19.223 | 19.252 | 19.261 |
| 0.6426414930555556 | 19.223 | 19.252 | 19.261 |
| 0.6426414930555556 | 19.223 | 19.25 | 19.262 |
| 0.6426414930555556 | 19.222 | 19.249 | 19.263 |
| 0.6426414930555556 | 19.222 | 19.247 | 19.264 |
| 0.6426414930555556 | 19.222 | 19.247 | 19.265 |
| 0.6426414930555556 | 19.221 | 19.245 | 19.266 |
| 0.6426415046296297 | 19.221 | 19.243 | 19.266 |
| 0.6426415046296297 | 19.22 | 19.242 | 19.266 |
| 0.6426415046296297 | 19.219 | 19.241 | 19.267 |
| 0.6426415046296297 | 19.218 | 19.241 | 19.268 |
| 0.6426415046296297 | 19.217 | 19.239 | 19.269 |
| 0.6426415046296297 | 19.217 | 19.238 | 19.268 |
| 0.6426415162037037 | 19.216 | 19.237 | 19.269 |
| 0.6426415162037037 | 19.214 | 19.238 | 19.27 |
| 0.6426415162037037 | 19.213 | 19.239 | 19.271 |
| 0.6426415162037037 | 19.212 | 19.238 | 19.272 |
| 0.6426415162037037 | 19.211 | 19.238 | 19.272 |
| 0.6426415162037037 | 19.209 | 19.239 | 19.273 |
| 0.6426415277777778 | 19.208 | 19.24 | 19.273 |
| 0.6426415277777778 | 19.207 | 19.241 | 19.274 |
| 0.6426415277777778 | 19.205 | 19.241 | 19.274 |
| 0.6426415277777778 | 19.205 | 19.242 | 19.274 |
| 0.6426415277777778 | 19.204 | 19.243 | 19.274 |
| 0.6426415277777778 | 19.202 | 19.244 | 19.274 |
| 0.6426415277777778 | 19.201 | 19.243 | 19.274 |
| 0.6426415393518519 | 19.2 | 19.244 | 19.273 |
| 0.6426415393518519 | 19.199 | 19.245 | 19.273 |
| 0.6426415393518519 | 19.198 | 19.245 | 19.273 |
| 0.6426415393518519 | 19.197 | 19.245 | 19.272 |
| 0.6426415393518519 | 19.197 | 19.246 | 19.272 |
| 0.6426415393518519 | 19.197 | 19.247 | 19.271 |
| 0.6426415509259259 | 19.196 | 19.248 | 19.27 |
| 0.6426415509259259 | 19.196 | 19.249 | 19.269 |
| 0.6426415509259259 | 19.196 | 19.25 | 19.268 |
| 0.6426415509259259 | 19.197 | 19.251 | 19.267 |
| 0.6426415509259259 | 19.197 | 19.252 | 19.265 |
| 0.6426415509259259 | 19.197 | 19.253 | 19.264 |
| 0.6426415509259259 | 19.198 | 19.254 | 19.263 |
| 0.6426415625 | 19.199 | 19.254 | 19.263 |
| 0.6426415625 | 19.2 | 19.255 | 19.262 |
| 0.6426415625 | 19.201 | 19.255 | 19.261 |
| 0.6426415625 | 19.201 | 19.255 | 19.259 |
| 0.6426415625 | 19.201 | 19.255 | 19.259 |
| 0.6426415625 | 19.202 | 19.255 | 19.259 |
| 0.6426415740740741 | 19.202 | 19.255 | 19.258 |
| 0.6426415740740741 | 19.202 | 19.255 | 19.257 |
| 0.6426415740740741 | 19.203 | 19.255 | 19.257 |
| 0.6426415740740741 | 19.204 | 19.254 | 19.257 |
| 0.6426415740740741 | 19.204 | 19.254 | 19.255 |
| 0.6426415740740741 | 19.204 | 19.254 | 19.254 |
| 0.6426415856481481 | 19.205 | 19.253 | 19.254 |
| 0.6426415856481481 | 19.207 | 19.253 | 19.255 |
| 0.6426415856481481 | 19.208 | 19.252 | 19.255 |
| 0.6426415856481481 | 19.208 | 19.251 | 19.253 |
| 0.6426415856481481 | 19.208 | 19.25 | 19.253 |
| 0.6426415856481481 | 19.21 | 19.249 | 19.255 |
| 0.6426415856481481 | 19.211 | 19.248 | 19.256 |
| 0.6426415972222222 | 19.212 | 19.248 | 19.257 |
| 0.6426415972222222 | 19.212 | 19.247 | 19.256 |
| 0.6426415972222222 | 19.212 | 19.246 | 19.257 |
| 0.6426415972222222 | 19.213 | 19.245 | 19.258 |
| 0.6426415972222222 | 19.213 | 19.244 | 19.259 |
| 0.6426415972222222 | 19.213 | 19.243 | 19.26 |
| 0.6426416087962963 | 19.213 | 19.243 | 19.26 |
| 0.6426416087962963 | 19.213 | 19.242 | 19.26 |
| 0.6426416087962963 | 19.213 | 19.241 | 19.261 |
| 0.6426416087962963 | 19.213 | 19.239 | 19.261 |
| 0.6426416087962963 | 19.213 | 19.239 | 19.262 |
| 0.6426416087962963 | 19.213 | 19.238 | 19.263 |
| 0.6426416087962963 | 19.212 | 19.237 | 19.263 |
| 0.6426416203703703 | 19.212 | 19.236 | 19.264 |
| 0.6426416203703703 | 19.211 | 19.237 | 19.266 |
| 0.6426416203703703 | 19.21 | 19.236 | 19.268 |
| 0.6426416203703703 | 19.209 | 19.235 | 19.268 |
| 0.6426416203703703 | 19.208 | 19.234 | 19.269 |
| 0.6426416203703703 | 19.208 | 19.235 | 19.27 |
| 0.6426416319444445 | 19.206 | 19.236 | 19.271 |
| 0.6426416319444445 | 19.205 | 19.236 | 19.272 |
| 0.6426416319444445 | 19.204 | 19.234 | 19.273 |
| 0.6426416319444445 | 19.203 | 19.234 | 19.273 |
| 0.6426416319444445 | 19.203 | 19.236 | 19.274 |
| 0.6426416319444445 | 19.202 | 19.237 | 19.274 |
| 0.6426416435185185 | 19.201 | 19.237 | 19.274 |
| 0.6426416435185185 | 19.199 | 19.237 | 19.275 |
| 0.6426416435185185 | 19.199 | 19.238 | 19.275 |
| 0.6426416435185185 | 19.198 | 19.239 | 19.275 |
| 0.6426416435185185 | 19.197 | 19.24 | 19.275 |
| 0.6426416435185185 | 19.197 | 19.24 | 19.275 |
| 0.6426416435185185 | 19.197 | 19.242 | 19.275 |
| 0.6426416550925925 | 19.196 | 19.244 | 19.274 |
| 0.6426416550925925 | 19.196 | 19.245 | 19.274 |
| 0.6426416550925925 | 19.195 | 19.245 | 19.273 |
| 0.6426416550925925 | 19.196 | 19.247 | 19.273 |
| 0.6426416550925925 | 19.197 | 19.248 | 19.272 |
| 0.6426416550925925 | 19.197 | 19.25 | 19.272 |
| 0.6426416666666667 | 19.197 | 19.251 | 19.271 |
| 0.6426416666666667 | 19.197 | 19.252 | 19.27 |
| 0.6426416666666667 | 19.198 | 19.253 | 19.269 |
| 0.6426416666666667 | 19.199 | 19.254 | 19.268 |
| 0.6426416666666667 | 19.2 | 19.255 | 19.267 |
| 0.6426416666666667 | 19.2 | 19.255 | 19.267 |
| 0.6426416666666667 | 19.2 | 19.256 | 19.266 |
| 0.6426416782407408 | 19.201 | 19.257 | 19.264 |
| 0.6426416782407408 | 19.202 | 19.257 | 19.263 |
| 0.6426416782407408 | 19.203 | 19.257 | 19.263 |
| 0.6426416782407408 | 19.204 | 19.257 | 19.263 |
| 0.6426416782407408 | 19.205 | 19.257 | 19.262 |
| 0.6426416782407408 | 19.206 | 19.257 | 19.261 |
| 0.6426416898148148 | 19.207 | 19.257 | 19.261 |
| 0.6426416898148148 | 19.209 | 19.257 | 19.261 |
| 0.6426416898148148 | 19.21 | 19.257 | 19.261 |
| 0.6426416898148148 | 19.21 | 19.257 | 19.26 |
| 0.6426416898148148 | 19.211 | 19.256 | 19.259 |
| 0.6426416898148148 | 19.213 | 19.256 | 19.26 |
| 0.6426417013888889 | 19.214 | 19.255 | 19.26 |
| 0.6426417013888889 | 19.215 | 19.254 | 19.26 |
| 0.6426417013888889 | 19.215 | 19.254 | 19.259 |
| 0.6426417013888889 | 19.216 | 19.254 | 19.259 |
| 0.6426417013888889 | 19.217 | 19.253 | 19.261 |
| 0.6426417013888889 | 19.219 | 19.252 | 19.262 |
| 0.6426417013888889 | 19.219 | 19.251 | 19.262 |
| 0.642641712962963 | 19.219 | 19.251 | 19.262 |
| 0.642641712962963 | 19.22 | 19.25 | 19.263 |
| 0.642641712962963 | 19.221 | 19.25 | 19.265 |
| 0.642641712962963 | 19.221 | 19.25 | 19.267 |
| 0.642641712962963 | 19.221 | 19.249 | 19.267 |
| 0.642641712962963 | 19.221 | 19.249 | 19.267 |
| 0.642641724537037 | 19.221 | 19.249 | 19.267 |
| 0.642641724537037 | 19.221 | 19.248 | 19.268 |
| 0.642641724537037 | 19.221 | 19.248 | 19.268 |
| 0.642641724537037 | 19.221 | 19.249 | 19.268 |
| 0.642641724537037 | 19.221 | 19.249 | 19.269 |
| 0.642641724537037 | 19.221 | 19.249 | 19.269 |
| 0.642641724537037 | 19.221 | 19.249 | 19.269 |
| 0.6426417361111111 | 19.221 | 19.25 | 19.271 |
| 0.6426417361111111 | 19.221 | 19.251 | 19.271 |
| 0.6426417361111111 | 19.221 | 19.251 | 19.272 |
| 0.6426417361111111 | 19.22 | 19.251 | 19.272 |
| 0.6426417361111111 | 19.22 | 19.252 | 19.273 |
| 0.6426417361111111 | 19.219 | 19.253 | 19.275 |
| 0.6426417476851852 | 19.219 | 19.253 | 19.275 |
| 0.6426417476851852 | 19.218 | 19.253 | 19.276 |
| 0.6426417476851852 | 19.218 | 19.253 | 19.276 |
| 0.6426417476851852 | 19.217 | 19.254 | 19.277 |
| 0.6426417476851852 | 19.216 | 19.254 | 19.277 |
| 0.6426417476851852 | 19.216 | 19.254 | 19.277 |
| 0.6426417592592593 | 19.216 | 19.254 | 19.277 |
| 0.6426417592592593 | 19.215 | 19.255 | 19.277 |
| 0.6426417592592593 | 19.215 | 19.256 | 19.277 |
| 0.6426417592592593 | 19.214 | 19.256 | 19.277 |
| 0.6426417592592593 | 19.214 | 19.256 | 19.277 |
| 0.6426417592592593 | 19.214 | 19.257 | 19.277 |
| 0.6426417592592593 | 19.214 | 19.258 | 19.277 |
| 0.6426417708333333 | 19.213 | 19.258 | 19.277 |
| 0.6426417708333333 | 19.212 | 19.258 | 19.277 |
| 0.6426417708333333 | 19.213 | 19.259 | 19.277 |
| 0.6426417708333333 | 19.213 | 19.26 | 19.276 |
| 0.6426417708333333 | 19.212 | 19.26 | 19.276 |
| 0.6426417708333333 | 19.211 | 19.26 | 19.275 |
| 0.6426417824074074 | 19.211 | 19.261 | 19.275 |
| 0.6426417824074074 | 19.211 | 19.262 | 19.275 |
| 0.6426417824074074 | 19.211 | 19.262 | 19.274 |
| 0.6426417824074074 | 19.21 | 19.262 | 19.273 |
| 0.6426417824074074 | 19.21 | 19.262 | 19.273 |
| 0.6426417824074074 | 19.21 | 19.263 | 19.272 |
| 0.6426417824074074 | 19.21 | 19.263 | 19.271 |
| 0.6426417939814815 | 19.21 | 19.264 | 19.27 |
| 0.6426417939814815 | 19.211 | 19.264 | 19.269 |
| 0.6426417939814815 | 19.211 | 19.264 | 19.268 |
| 0.6426417939814815 | 19.212 | 19.264 | 19.268 |
| 0.6426417939814815 | 19.213 | 19.264 | 19.267 |
| 0.6426417939814815 | 19.214 | 19.264 | 19.266 |
| 0.6426418055555555 | 19.215 | 19.264 | 19.266 |
| 0.6426418055555555 | 19.216 | 19.264 | 19.266 |
| 0.6426418055555555 | 19.215 | 19.264 | 19.264 |
| 0.6426418055555555 | 19.216 | 19.264 | 19.264 |
| 0.6426418055555555 | 19.218 | 19.264 | 19.265 |
| 0.6426418055555555 | 19.219 | 19.263 | 19.266 |
| 0.6426418171296296 | 19.219 | 19.263 | 19.264 |
| 0.6426418171296296 | 19.219 | 19.262 | 19.263 |
| 0.6426418171296296 | 19.22 | 19.262 | 19.263 |
| 0.6426418171296296 | 19.221 | 19.261 | 19.264 |
| 0.6426418171296296 | 19.222 | 19.26 | 19.263 |
| 0.6426418171296296 | 19.222 | 19.26 | 19.262 |
| 0.6426418171296296 | 19.222 | 19.259 | 19.261 |
| 0.6426418287037037 | 19.222 | 19.258 | 19.262 |
| 0.6426418287037037 | 19.223 | 19.257 | 19.262 |
| 0.6426418287037037 | 19.223 | 19.257 | 19.263 |
| 0.6426418287037037 | 19.224 | 19.256 | 19.262 |
| 0.6426418287037037 | 19.224 | 19.255 | 19.263 |
| 0.6426418287037037 | 19.224 | 19.254 | 19.264 |
| 0.6426418402777777 | 19.224 | 19.253 | 19.265 |
| 0.6426418402777777 | 19.224 | 19.252 | 19.266 |
| 0.6426418402777777 | 19.224 | 19.252 | 19.266 |
| 0.6426418402777777 | 19.224 | 19.252 | 19.267 |
| 0.6426418402777777 | 19.224 | 19.251 | 19.267 |
| 0.6426418402777777 | 19.224 | 19.25 | 19.268 |
| 0.6426418402777777 | 19.224 | 19.251 | 19.268 |
| 0.6426418518518519 | 19.224 | 19.251 | 19.268 |
| 0.6426418518518519 | 19.224 | 19.25 | 19.268 |
| 0.6426418518518519 | 19.224 | 19.25 | 19.268 |
| 0.6426418518518519 | 19.224 | 19.251 | 19.268 |
| 0.6426418518518519 | 19.223 | 19.251 | 19.269 |
| 0.6426418518518519 | 19.223 | 19.251 | 19.269 |
| 0.642641863425926 | 19.223 | 19.251 | 19.269 |
| 0.642641863425926 | 19.223 | 19.252 | 19.27 |
| 0.642641863425926 | 19.223 | 19.253 | 19.27 |
| 0.642641863425926 | 19.222 | 19.254 | 19.271 |
| 0.642641863425926 | 19.221 | 19.254 | 19.271 |
| 0.642641863425926 | 19.221 | 19.254 | 19.271 |
| 0.642641875 | 19.221 | 19.255 | 19.272 |
| 0.642641875 | 19.221 | 19.256 | 19.272 |
| 0.642641875 | 19.22 | 19.257 | 19.272 |
| 0.642641875 | 19.219 | 19.257 | 19.272 |
| 0.642641875 | 19.22 | 19.258 | 19.272 |
| 0.642641875 | 19.219 | 19.259 | 19.272 |
| 0.642641875 | 19.218 | 19.259 | 19.272 |
| 0.6426418865740741 | 19.218 | 19.258 | 19.272 |
| 0.6426418865740741 | 19.218 | 19.258 | 19.272 |
| 0.6426418865740741 | 19.218 | 19.259 | 19.272 |
| 0.6426418865740741 | 19.216 | 19.259 | 19.271 |
| 0.6426418865740741 | 19.215 | 19.258 | 19.271 |
| 0.6426418865740741 | 19.214 | 19.258 | 19.271 |
| 0.6426418981481482 | 19.214 | 19.258 | 19.27 |
| 0.6426418981481482 | 19.214 | 19.259 | 19.27 |
| 0.6426418981481482 | 19.212 | 19.259 | 19.27 |
| 0.6426418981481482 | 19.211 | 19.259 | 19.269 |
| 0.6426418981481482 | 19.211 | 19.259 | 19.268 |
| 0.6426418981481482 | 19.211 | 19.26 | 19.267 |
| 0.6426418981481482 | 19.212 | 19.26 | 19.267 |
| 0.6426419097222222 | 19.212 | 19.26 | 19.266 |
| 0.6426419097222222 | 19.212 | 19.26 | 19.266 |
| 0.6426419097222222 | 19.212 | 19.26 | 19.265 |
| 0.6426419097222222 | 19.212 | 19.261 | 19.264 |
| 0.6426419097222222 | 19.212 | 19.261 | 19.263 |
| 0.6426419097222222 | 19.212 | 19.261 | 19.263 |
| 0.6426419212962963 | 19.212 | 19.261 | 19.262 |
| 0.6426419212962963 | 19.211 | 19.261 | 19.261 |
| 0.6426419212962963 | 19.211 | 19.261 | 19.261 |
| 0.6426419212962963 | 19.212 | 19.26 | 19.261 |
| 0.6426419212962963 | 19.212 | 19.26 | 19.26 |
| 0.6426419212962963 | 19.211 | 19.26 | 19.259 |
| 0.6426419328703704 | 19.21 | 19.26 | 19.258 |
| 0.6426419328703704 | 19.211 | 19.26 | 19.258 |
| 0.6426419328703704 | 19.211 | 19.26 | 19.258 |
| 0.6426419328703704 | 19.211 | 19.259 | 19.257 |
| 0.6426419328703704 | 19.211 | 19.258 | 19.255 |
| 0.6426419328703704 | 19.211 | 19.258 | 19.255 |
| 0.6426419328703704 | 19.212 | 19.257 | 19.255 |
| 0.6426419444444444 | 19.213 | 19.256 | 19.256 |
| 0.6426419444444444 | 19.213 | 19.255 | 19.255 |
| 0.6426419444444444 | 19.213 | 19.254 | 19.254 |
| 0.6426419444444444 | 19.213 | 19.253 | 19.254 |
| 0.6426419444444444 | 19.214 | 19.253 | 19.255 |
| 0.6426419444444444 | 19.214 | 19.252 | 19.255 |
| 0.6426419560185185 | 19.214 | 19.251 | 19.255 |
| 0.6426419560185185 | 19.214 | 19.25 | 19.255 |
| 0.6426419560185185 | 19.214 | 19.249 | 19.255 |
| 0.6426419560185185 | 19.214 | 19.247 | 19.256 |
| 0.6426419560185185 | 19.214 | 19.246 | 19.255 |
| 0.6426419560185185 | 19.213 | 19.246 | 19.255 |
| 0.6426419560185185 | 19.213 | 19.245 | 19.255 |
| 0.6426419675925926 | 19.213 | 19.244 | 19.255 |
| 0.6426419675925926 | 19.212 | 19.242 | 19.255 |
| 0.6426419675925926 | 19.212 | 19.241 | 19.255 |
| 0.6426419675925926 | 19.211 | 19.24 | 19.256 |
| 0.6426419675925926 | 19.211 | 19.239 | 19.256 |
| 0.6426419675925926 | 19.21 | 19.238 | 19.256 |
| 0.6426419791666667 | 19.21 | 19.238 | 19.256 |
| 0.6426419791666667 | 19.209 | 19.237 | 19.257 |
| 0.6426419791666667 | 19.208 | 19.236 | 19.257 |
| 0.6426419791666667 | 19.207 | 19.235 | 19.257 |
| 0.6426419791666667 | 19.206 | 19.235 | 19.257 |
| 0.6426419791666667 | 19.206 | 19.236 | 19.258 |
| 0.6426419907407407 | 19.205 | 19.236 | 19.258 |
| 0.6426419907407407 | 19.204 | 19.236 | 19.258 |
| 0.6426419907407407 | 19.203 | 19.235 | 19.258 |
| 0.6426419907407407 | 19.203 | 19.236 | 19.258 |
| 0.6426419907407407 | 19.203 | 19.237 | 19.258 |
| 0.6426419907407407 | 19.201 | 19.237 | 19.258 |
| 0.6426419907407407 | 19.201 | 19.236 | 19.258 |
| 0.6426420023148148 | 19.201 | 19.237 | 19.258 |
| 0.6426420023148148 | 19.2 | 19.238 | 19.257 |
| 0.6426420023148148 | 19.198 | 19.238 | 19.257 |
| 0.6426420023148148 | 19.197 | 19.237 | 19.257 |
| 0.6426420023148148 | 19.197 | 19.238 | 19.257 |
| 0.6426420023148148 | 19.197 | 19.239 | 19.256 |
| 0.6426420138888889 | 19.196 | 19.239 | 19.255 |
| 0.6426420138888889 | 19.194 | 19.239 | 19.254 |
| 0.6426420138888889 | 19.193 | 19.239 | 19.254 |
| 0.6426420138888889 | 19.193 | 19.24 | 19.253 |
| 0.6426420138888889 | 19.194 | 19.24 | 19.252 |
| 0.6426420138888889 | 19.194 | 19.241 | 19.252 |
| 0.6426420138888889 | 19.193 | 19.241 | 19.251 |
| 0.6426420254629629 | 19.193 | 19.241 | 19.25 |
| 0.6426420254629629 | 19.193 | 19.241 | 19.249 |
| 0.6426420254629629 | 19.193 | 19.242 | 19.248 |
| 0.6426420254629629 | 19.193 | 19.242 | 19.247 |
| 0.6426420254629629 | 19.193 | 19.242 | 19.247 |
| 0.6426420254629629 | 19.193 | 19.242 | 19.246 |
| 0.642642037037037 | 19.193 | 19.242 | 19.244 |
| 0.642642037037037 | 19.193 | 19.242 | 19.244 |
| 0.642642037037037 | 19.194 | 19.241 | 19.243 |
| 0.642642037037037 | 19.194 | 19.241 | 19.242 |
| 0.642642037037037 | 19.193 | 19.241 | 19.24 |
| 0.642642037037037 | 19.192 | 19.241 | 19.239 |
| 0.6426420486111112 | 19.193 | 19.241 | 19.239 |
| 0.6426420486111112 | 19.194 | 19.24 | 19.239 |
| 0.6426420486111112 | 19.194 | 19.239 | 19.237 |
| 0.6426420486111112 | 19.193 | 19.239 | 19.235 |
| 0.6426420486111112 | 19.193 | 19.239 | 19.235 |
| 0.6426420486111112 | 19.194 | 19.238 | 19.236 |
| 0.6426420486111112 | 19.195 | 19.238 | 19.235 |
| 0.6426420601851852 | 19.194 | 19.237 | 19.234 |
| 0.6426420601851852 | 19.194 | 19.236 | 19.233 |
| 0.6426420601851852 | 19.195 | 19.236 | 19.234 |
| 0.6426420601851852 | 19.195 | 19.235 | 19.234 |
| 0.6426420601851852 | 19.195 | 19.235 | 19.234 |
| 0.6426420601851852 | 19.195 | 19.233 | 19.233 |
| 0.6426420717592592 | 19.195 | 19.233 | 19.233 |
| 0.6426420717592592 | 19.195 | 19.232 | 19.233 |
| 0.6426420717592592 | 19.195 | 19.231 | 19.234 |
| 0.6426420717592592 | 19.195 | 19.23 | 19.233 |
| 0.6426420717592592 | 19.195 | 19.23 | 19.233 |
| 0.6426420717592592 | 19.195 | 19.229 | 19.233 |
| 0.6426420717592592 | 19.194 | 19.228 | 19.233 |
| 0.6426420833333334 | 19.194 | 19.226 | 19.233 |
| 0.6426420833333334 | 19.194 | 19.225 | 19.234 |
| 0.6426420833333334 | 19.193 | 19.225 | 19.234 |
| 0.6426420833333334 | 19.193 | 19.223 | 19.234 |
| 0.6426420833333334 | 19.192 | 19.222 | 19.234 |
| 0.6426420833333334 | 19.191 | 19.221 | 19.234 |
| 0.6426420949074074 | 19.19 | 19.22 | 19.235 |
| 0.6426420949074074 | 19.189 | 19.219 | 19.235 |
| 0.6426420949074074 | 19.188 | 19.218 | 19.236 |
| 0.6426420949074074 | 19.187 | 19.217 | 19.236 |
| 0.6426420949074074 | 19.186 | 19.217 | 19.236 |
| 0.6426420949074074 | 19.184 | 19.216 | 19.236 |
| 0.6426421064814815 | 19.183 | 19.216 | 19.237 |
| 0.6426421064814815 | 19.182 | 19.215 | 19.237 |
| 0.6426421064814815 | 19.182 | 19.215 | 19.237 |
| 0.6426421064814815 | 19.181 | 19.215 | 19.237 |
| 0.6426421064814815 | 19.179 | 19.215 | 19.237 |
| 0.6426421064814815 | 19.178 | 19.215 | 19.237 |
| 0.6426421064814815 | 19.178 | 19.215 | 19.237 |
| 0.6426421180555556 | 19.176 | 19.216 | 19.236 |
| 0.6426421180555556 | 19.174 | 19.215 | 19.236 |
| 0.6426421180555556 | 19.173 | 19.214 | 19.236 |
| 0.6426421180555556 | 19.172 | 19.215 | 19.236 |
| 0.6426421180555556 | 19.171 | 19.216 | 19.235 |
| 0.6426421180555556 | 19.169 | 19.216 | 19.234 |
| 0.6426421296296296 | 19.167 | 19.215 | 19.234 |
| 0.6426421296296296 | 19.166 | 19.215 | 19.233 |
| 0.6426421296296296 | 19.165 | 19.216 | 19.232 |
| 0.6426421296296296 | 19.165 | 19.217 | 19.231 |
| 0.6426421296296296 | 19.163 | 19.217 | 19.23 |
| 0.6426421296296296 | 19.162 | 19.217 | 19.229 |
| 0.6426421296296296 | 19.161 | 19.217 | 19.228 |
| 0.6426421412037037 | 19.161 | 19.218 | 19.226 |
| 0.6426421412037037 | 19.161 | 19.218 | 19.225 |
| 0.6426421412037037 | 19.161 | 19.218 | 19.224 |
| 0.6426421412037037 | 19.16 | 19.218 | 19.223 |
| 0.6426421412037037 | 19.16 | 19.219 | 19.222 |
| 0.6426421412037037 | 19.161 | 19.219 | 19.221 |
| 0.6426421527777778 | 19.161 | 19.218 | 19.219 |
| 0.6426421527777778 | 19.162 | 19.218 | 19.218 |
| 0.6426421527777778 | 19.162 | 19.218 | 19.217 |
| 0.6426421527777778 | 19.162 | 19.218 | 19.215 |
| 0.6426421527777778 | 19.162 | 19.217 | 19.213 |
| 0.6426421527777778 | 19.164 | 19.216 | 19.213 |
| 0.6426421643518518 | 19.164 | 19.216 | 19.212 |
| 0.6426421643518518 | 19.165 | 19.215 | 19.209 |
| 0.6426421643518518 | 19.164 | 19.214 | 19.207 |
| 0.6426421643518518 | 19.165 | 19.213 | 19.207 |
| 0.6426421643518518 | 19.166 | 19.212 | 19.207 |
| 0.6426421643518518 | 19.167 | 19.211 | 19.206 |
| 0.6426421643518518 | 19.167 | 19.21 | 19.204 |
| 0.6426421759259259 | 19.167 | 19.209 | 19.202 |
| 0.6426421759259259 | 19.168 | 19.208 | 19.202 |
| 0.6426421759259259 | 19.168 | 19.206 | 19.202 |
| 0.6426421759259259 | 19.168 | 19.205 | 19.201 |
| 0.6426421759259259 | 19.168 | 19.203 | 19.2 |
| 0.6426421759259259 | 19.169 | 19.202 | 19.2 |
| 0.6426421875 | 19.169 | 19.201 | 19.201 |
| 0.6426421875 | 19.169 | 19.2 | 19.201 |
| 0.6426421875 | 19.169 | 19.198 | 19.2 |
| 0.6426421875 | 19.169 | 19.198 | 19.2 |
| 0.6426421875 | 19.168 | 19.197 | 19.201 |
| 0.6426421875 | 19.168 | 19.195 | 19.201 |
| 0.6426421875 | 19.168 | 19.193 | 19.201 |
| 0.642642199074074 | 19.167 | 19.193 | 19.202 |
| 0.642642199074074 | 19.167 | 19.192 | 19.202 |
| 0.642642199074074 | 19.166 | 19.19 | 19.202 |
| 0.642642199074074 | 19.166 | 19.189 | 19.203 |
| 0.642642199074074 | 19.165 | 19.188 | 19.203 |
| 0.642642199074074 | 19.164 | 19.188 | 19.204 |
| 0.6426422106481481 | 19.163 | 19.187 | 19.204 |
| 0.6426422106481481 | 19.162 | 19.185 | 19.204 |
| 0.6426422106481481 | 19.161 | 19.185 | 19.205 |
| 0.6426422106481481 | 19.16 | 19.185 | 19.206 |
| 0.6426422106481481 | 19.159 | 19.185 | 19.206 |
| 0.6426422106481481 | 19.157 | 19.185 | 19.207 |
| 0.6426422222222222 | 19.156 | 19.185 | 19.207 |
| 0.6426422222222222 | 19.155 | 19.185 | 19.207 |
| 0.6426422222222222 | 19.153 | 19.186 | 19.207 |
| 0.6426422222222222 | 19.152 | 19.186 | 19.208 |
| 0.6426422222222222 | 19.151 | 19.186 | 19.208 |
| 0.6426422222222222 | 19.15 | 19.188 | 19.207 |
| 0.6426422222222222 | 19.148 | 19.189 | 19.207 |
| 0.6426422337962964 | 19.146 | 19.189 | 19.207 |
| 0.6426422337962964 | 19.145 | 19.189 | 19.207 |
| 0.6426422337962964 | 19.144 | 19.19 | 19.206 |
| 0.6426422337962964 | 19.144 | 19.191 | 19.205 |
| 0.6426422337962964 | 19.142 | 19.192 | 19.204 |
| 0.6426422337962964 | 19.14 | 19.192 | 19.204 |
| 0.6426422453703704 | 19.139 | 19.192 | 19.203 |
| 0.6426422453703704 | 19.139 | 19.193 | 19.202 |
| 0.6426422453703704 | 19.139 | 19.194 | 19.201 |
| 0.6426422453703704 | 19.138 | 19.195 | 19.2 |
| 0.6426422453703704 | 19.137 | 19.195 | 19.199 |
| 0.6426422453703704 | 19.136 | 19.196 | 19.198 |
| 0.6426422453703704 | 19.137 | 19.196 | 19.196 |
| 0.6426422569444444 | 19.137 | 19.197 | 19.195 |
| 0.6426422569444444 | 19.137 | 19.197 | 19.193 |
| 0.6426422569444444 | 19.137 | 19.197 | 19.192 |
| 0.6426422569444444 | 19.137 | 19.198 | 19.191 |
| 0.6426422569444444 | 19.137 | 19.198 | 19.189 |
| 0.6426422569444444 | 19.137 | 19.198 | 19.187 |
| 0.6426422685185186 | 19.137 | 19.198 | 19.187 |
| 0.6426422685185186 | 19.137 | 19.198 | 19.185 |
| 0.6426422685185186 | 19.137 | 19.197 | 19.183 |
| 0.6426422685185186 | 19.137 | 19.197 | 19.182 |
| 0.6426422685185186 | 19.138 | 19.197 | 19.182 |
| 0.6426422685185186 | 19.139 | 19.196 | 19.18 |
| 0.6426422800925926 | 19.138 | 19.196 | 19.178 |
| 0.6426422800925926 | 19.138 | 19.195 | 19.176 |
| 0.6426422800925926 | 19.139 | 19.195 | 19.176 |
| 0.6426422800925926 | 19.14 | 19.193 | 19.175 |
| 0.6426422800925926 | 19.14 | 19.192 | 19.173 |
| 0.6426422800925926 | 19.14 | 19.191 | 19.171 |
| 0.6426422800925926 | 19.141 | 19.189 | 19.17 |
| 0.6426422916666666 | 19.142 | 19.188 | 19.17 |
| 0.6426422916666666 | 19.143 | 19.186 | 19.17 |
| 0.6426422916666666 | 19.143 | 19.184 | 19.169 |
| 0.6426422916666666 | 19.144 | 19.182 | 19.168 |
| 0.6426422916666666 | 19.144 | 19.18 | 19.168 |
| 0.6426422916666666 | 19.145 | 19.178 | 19.169 |
| 0.6426423032407408 | 19.145 | 19.176 | 19.169 |
| 0.6426423032407408 | 19.145 | 19.174 | 19.169 |
| 0.6426423032407408 | 19.145 | 19.173 | 19.169 |
| 0.6426423032407408 | 19.145 | 19.171 | 19.17 |
| 0.6426423032407408 | 19.144 | 19.169 | 19.171 |
| 0.6426423032407408 | 19.144 | 19.168 | 19.171 |
| 0.6426423032407408 | 19.144 | 19.167 | 19.172 |
| 0.6426423148148148 | 19.143 | 19.167 | 19.173 |
| 0.6426423148148148 | 19.142 | 19.165 | 19.174 |
| 0.6426423148148148 | 19.141 | 19.163 | 19.174 |
| 0.6426423148148148 | 19.14 | 19.162 | 19.175 |
| 0.6426423148148148 | 19.139 | 19.162 | 19.177 |
| 0.6426423148148148 | 19.138 | 19.161 | 19.178 |
| 0.6426423263888889 | 19.137 | 19.161 | 19.178 |
| 0.6426423263888889 | 19.135 | 19.16 | 19.179 |
| 0.6426423263888889 | 19.133 | 19.16 | 19.181 |
| 0.6426423263888889 | 19.132 | 19.16 | 19.182 |
| 0.6426423263888889 | 19.13 | 19.16 | 19.182 |
| 0.6426423263888889 | 19.129 | 19.16 | 19.183 |
| 0.642642337962963 | 19.127 | 19.161 | 19.183 |
| 0.642642337962963 | 19.125 | 19.161 | 19.184 |
| 0.642642337962963 | 19.123 | 19.162 | 19.184 |
| 0.642642337962963 | 19.122 | 19.162 | 19.184 |
| 0.642642337962963 | 19.121 | 19.164 | 19.184 |
| 0.642642337962963 | 19.12 | 19.165 | 19.184 |
| 0.642642337962963 | 19.118 | 19.165 | 19.184 |
| 0.642642349537037 | 19.117 | 19.166 | 19.184 |
| 0.642642349537037 | 19.117 | 19.168 | 19.183 |
| 0.642642349537037 | 19.116 | 19.169 | 19.182 |
| 0.642642349537037 | 19.114 | 19.169 | 19.182 |
| 0.642642349537037 | 19.113 | 19.17 | 19.181 |
| 0.642642349537037 | 19.113 | 19.171 | 19.18 |
| 0.6426423611111111 | 19.114 | 19.173 | 19.179 |
| 0.6426423611111111 | 19.113 | 19.174 | 19.178 |
| 0.6426423611111111 | 19.111 | 19.175 | 19.176 |
| 0.6426423611111111 | 19.111 | 19.176 | 19.175 |
| 0.6426423611111111 | 19.111 | 19.177 | 19.174 |
| 0.6426423611111111 | 19.112 | 19.178 | 19.172 |
| 0.6426423611111111 | 19.112 | 19.179 | 19.171 |
| 0.6426423726851852 | 19.111 | 19.179 | 19.169 |
| 0.6426423726851852 | 19.111 | 19.18 | 19.167 |
| 0.6426423726851852 | 19.112 | 19.18 | 19.165 |
| 0.6426423726851852 | 19.113 | 19.18 | 19.163 |
| 0.6426423726851852 | 19.113 | 19.181 | 19.162 |
| 0.6426423726851852 | 19.113 | 19.181 | 19.161 |
| 0.6426423842592592 | 19.114 | 19.181 | 19.159 |
| 0.6426423842592592 | 19.115 | 19.18 | 19.157 |
| 0.6426423842592592 | 19.116 | 19.18 | 19.156 |
| 0.6426423842592592 | 19.117 | 19.18 | 19.155 |
| 0.6426423842592592 | 19.118 | 19.179 | 19.155 |
| 0.6426423842592592 | 19.118 | 19.179 | 19.153 |
| 0.6426423958333333 | 19.119 | 19.178 | 19.152 |
| 0.6426423958333333 | 19.121 | 19.177 | 19.152 |
| 0.6426423958333333 | 19.122 | 19.176 | 19.152 |
| 0.6426423958333333 | 19.123 | 19.175 | 19.151 |
| 0.6426423958333333 | 19.123 | 19.174 | 19.15 |
| 0.6426423958333333 | 19.125 | 19.173 | 19.15 |
| 0.6426423958333333 | 19.126 | 19.171 | 19.151 |
| 0.6426424074074074 | 19.127 | 19.169 | 19.151 |
| 0.6426424074074074 | 19.128 | 19.168 | 19.151 |
| 0.6426424074074074 | 19.129 | 19.166 | 19.151 |
| 0.6426424074074074 | 19.129 | 19.165 | 19.153 |
| 0.6426424074074074 | 19.13 | 19.164 | 19.154 |
| 0.6426424074074074 | 19.13 | 19.162 | 19.155 |
| 0.6426424189814814 | 19.131 | 19.159 | 19.155 |
| 0.6426424189814814 | 19.131 | 19.159 | 19.157 |
| 0.6426424189814814 | 19.131 | 19.157 | 19.159 |
| 0.6426424189814814 | 19.13 | 19.156 | 19.161 |
| 0.6426424189814814 | 19.13 | 19.155 | 19.162 |
| 0.6426424189814814 | 19.13 | 19.155 | 19.163 |
| 0.6426424189814814 | 19.129 | 19.154 | 19.165 |
| 0.6426424305555556 | 19.128 | 19.152 | 19.167 |
| 0.6426424305555556 | 19.127 | 19.151 | 19.168 |
| 0.6426424305555556 | 19.127 | 19.151 | 19.169 |
| 0.6426424305555556 | 19.126 | 19.151 | 19.171 |
| 0.6426424305555556 | 19.124 | 19.15 | 19.172 |
| 0.6426424305555556 | 19.123 | 19.149 | 19.173 |
| 0.6426424421296296 | 19.121 | 19.148 | 19.174 |
| 0.6426424421296296 | 19.12 | 19.149 | 19.175 |
| 0.6426424421296296 | 19.118 | 19.149 | 19.176 |
| 0.6426424421296296 | 19.116 | 19.149 | 19.177 |
| 0.6426424421296296 | 19.115 | 19.149 | 19.178 |
| 0.6426424421296296 | 19.113 | 19.149 | 19.179 |
| 0.6426424537037038 | 19.11 | 19.149 | 19.179 |
| 0.6426424537037038 | 19.109 | 19.149 | 19.18 |
| 0.6426424537037038 | 19.107 | 19.15 | 19.18 |
| 0.6426424537037038 | 19.106 | 19.151 | 19.18 |
| 0.6426424537037038 | 19.104 | 19.152 | 19.18 |
| 0.6426424537037038 | 19.102 | 19.152 | 19.18 |
| 0.6426424537037038 | 19.101 | 19.153 | 19.18 |
| 0.6426424652777778 | 19.101 | 19.156 | 19.18 |
| 0.6426424652777778 | 19.1 | 19.157 | 19.179 |
| 0.6426424652777778 | 19.099 | 19.158 | 19.178 |
| 0.6426424652777778 | 19.097 | 19.159 | 19.178 |
| 0.6426424652777778 | 19.098 | 19.161 | 19.177 |
| 0.6426424652777778 | 19.098 | 19.163 | 19.176 |
| 0.6426424768518518 | 19.097 | 19.164 | 19.174 |
| 0.6426424768518518 | 19.095 | 19.165 | 19.173 |
| 0.6426424768518518 | 19.095 | 19.166 | 19.172 |
| 0.6426424768518518 | 19.096 | 19.168 | 19.17 |
| 0.6426424768518518 | 19.096 | 19.169 | 19.168 |
| 0.6426424768518518 | 19.096 | 19.17 | 19.166 |
| 0.6426424768518518 | 19.095 | 19.171 | 19.165 |
| 0.642642488425926 | 19.096 | 19.172 | 19.163 |
| 0.642642488425926 | 19.098 | 19.173 | 19.161 |
| 0.642642488425926 | 19.1 | 19.173 | 19.16 |
| 0.642642488425926 | 19.101 | 19.174 | 19.158 |
| 0.642642488425926 | 19.102 | 19.174 | 19.157 |
| 0.642642488425926 | 19.104 | 19.174 | 19.156 |
| 0.6426425 | 19.106 | 19.174 | 19.155 |
| 0.6426425 | 19.108 | 19.173 | 19.154 |
| 0.6426425 | 19.11 | 19.173 | 19.153 |
| 0.6426425 | 19.111 | 19.173 | 19.152 |
| 0.6426425 | 19.113 | 19.172 | 19.151 |
| 0.6426425 | 19.114 | 19.171 | 19.151 |
| 0.642642511574074 | 19.117 | 19.17 | 19.152 |
| 0.642642511574074 | 19.119 | 19.169 | 19.152 |
| 0.642642511574074 | 19.12 | 19.168 | 19.151 |
| 0.642642511574074 | 19.121 | 19.167 | 19.151 |
| 0.642642511574074 | 19.122 | 19.166 | 19.152 |
| 0.642642511574074 | 19.124 | 19.165 | 19.153 |
| 0.642642511574074 | 19.125 | 19.163 | 19.154 |
| 0.6426425231481482 | 19.126 | 19.162 | 19.154 |
| 0.6426425231481482 | 19.127 | 19.161 | 19.155 |
| 0.6426425231481482 | 19.128 | 19.16 | 19.156 |
| 0.6426425231481482 | 19.129 | 19.159 | 19.157 |
| 0.6426425231481482 | 19.129 | 19.157 | 19.158 |
| 0.6426425231481482 | 19.129 | 19.156 | 19.158 |
| 0.6426425347222222 | 19.13 | 19.155 | 19.16 |
| 0.6426425347222222 | 19.13 | 19.154 | 19.162 |
| 0.6426425347222222 | 19.13 | 19.153 | 19.163 |
| 0.6426425347222222 | 19.13 | 19.153 | 19.163 |
| 0.6426425347222222 | 19.129 | 19.152 | 19.165 |
| 0.6426425347222222 | 19.129 | 19.152 | 19.167 |
| 0.6426425347222222 | 19.128 | 19.15 | 19.168 |
| 0.6426425462962962 | 19.128 | 19.149 | 19.169 |
| 0.6426425462962962 | 19.127 | 19.148 | 19.171 |
| 0.6426425462962962 | 19.126 | 19.148 | 19.172 |
| 0.6426425462962962 | 19.124 | 19.147 | 19.174 |
| 0.6426425462962962 | 19.123 | 19.146 | 19.175 |
| 0.6426425462962962 | 19.122 | 19.146 | 19.176 |
| 0.6426425578703704 | 19.121 | 19.146 | 19.178 |
| 0.6426425578703704 | 19.119 | 19.145 | 19.179 |
| 0.6426425578703704 | 19.117 | 19.146 | 19.18 |
| 0.6426425578703704 | 19.116 | 19.146 | 19.181 |
| 0.6426425578703704 | 19.114 | 19.146 | 19.182 |
| 0.6426425578703704 | 19.112 | 19.147 | 19.183 |
| 0.6426425694444444 | 19.111 | 19.148 | 19.183 |
| 0.6426425694444444 | 19.109 | 19.149 | 19.184 |
| 0.6426425694444444 | 19.108 | 19.15 | 19.184 |
| 0.6426425694444444 | 19.106 | 19.151 | 19.184 |
| 0.6426425694444444 | 19.104 | 19.153 | 19.184 |
| 0.6426425694444444 | 19.103 | 19.154 | 19.184 |
| 0.6426425694444444 | 19.102 | 19.156 | 19.184 |
| 0.6426425810185185 | 19.1 | 19.158 | 19.183 |
| 0.6426425810185185 | 19.098 | 19.158 | 19.183 |
| 0.6426425810185185 | 19.097 | 19.16 | 19.182 |
| 0.6426425810185185 | 19.097 | 19.163 | 19.181 |
| 0.6426425810185185 | 19.097 | 19.165 | 19.18 |
| 0.6426425810185185 | 19.095 | 19.166 | 19.179 |
| 0.6426425925925926 | 19.094 | 19.167 | 19.178 |
| 0.6426425925925926 | 19.094 | 19.168 | 19.176 |
| 0.6426425925925926 | 19.096 | 19.171 | 19.175 |
| 0.6426425925925926 | 19.097 | 19.172 | 19.174 |
| 0.6426425925925926 | 19.096 | 19.173 | 19.172 |
| 0.6426425925925926 | 19.097 | 19.174 | 19.171 |
| 0.6426425925925926 | 19.099 | 19.175 | 19.169 |
| 0.6426426041666666 | 19.101 | 19.176 | 19.168 |
| 0.6426426041666666 | 19.102 | 19.177 | 19.167 |
| 0.6426426041666666 | 19.103 | 19.178 | 19.165 |
| 0.6426426041666666 | 19.105 | 19.178 | 19.164 |
| 0.6426426041666666 | 19.107 | 19.178 | 19.163 |
| 0.6426426041666666 | 19.109 | 19.178 | 19.161 |
| 0.6426426157407408 | 19.11 | 19.178 | 19.16 |
| 0.6426426157407408 | 19.112 | 19.178 | 19.16 |
| 0.6426426157407408 | 19.114 | 19.178 | 19.159 |
| 0.6426426157407408 | 19.115 | 19.177 | 19.158 |
| 0.6426426157407408 | 19.117 | 19.177 | 19.157 |
| 0.6426426157407408 | 19.119 | 19.176 | 19.157 |
| 0.6426426273148148 | 19.121 | 19.175 | 19.157 |
| 0.6426426273148148 | 19.122 | 19.174 | 19.156 |
| 0.6426426273148148 | 19.123 | 19.173 | 19.155 |
| 0.6426426273148148 | 19.125 | 19.172 | 19.156 |
| 0.6426426273148148 | 19.127 | 19.17 | 19.156 |
| 0.6426426273148148 | 19.128 | 19.169 | 19.156 |
| 0.6426426273148148 | 19.129 | 19.168 | 19.156 |
| 0.642642638888889 | 19.13 | 19.167 | 19.156 |
| 0.642642638888889 | 19.131 | 19.165 | 19.158 |
| 0.642642638888889 | 19.132 | 19.163 | 19.159 |
| 0.642642638888889 | 19.132 | 19.162 | 19.158 |
| 0.642642638888889 | 19.133 | 19.16 | 19.159 |
| 0.642642638888889 | 19.133 | 19.159 | 19.161 |
| 0.642642650462963 | 19.134 | 19.158 | 19.163 |
| 0.642642650462963 | 19.134 | 19.157 | 19.164 |
| 0.642642650462963 | 19.134 | 19.156 | 19.165 |
| 0.642642650462963 | 19.134 | 19.155 | 19.167 |
| 0.642642650462963 | 19.133 | 19.154 | 19.169 |
| 0.642642650462963 | 19.133 | 19.152 | 19.17 |
| 0.642642650462963 | 19.132 | 19.152 | 19.171 |
| 0.642642662037037 | 19.132 | 19.152 | 19.173 |
| 0.642642662037037 | 19.131 | 19.152 | 19.175 |
| 0.642642662037037 | 19.13 | 19.152 | 19.177 |
| 0.642642662037037 | 19.129 | 19.151 | 19.178 |
| 0.642642662037037 | 19.128 | 19.151 | 19.18 |
| 0.642642662037037 | 19.127 | 19.153 | 19.182 |
| 0.6426426736111112 | 19.125 | 19.153 | 19.183 |
| 0.6426426736111112 | 19.124 | 19.153 | 19.185 |
| 0.6426426736111112 | 19.122 | 19.154 | 19.186 |
| 0.6426426736111112 | 19.121 | 19.155 | 19.187 |
| 0.6426426736111112 | 19.119 | 19.157 | 19.188 |
| 0.6426426736111112 | 19.118 | 19.159 | 19.189 |
| 0.6426426851851852 | 19.117 | 19.16 | 19.19 |
| 0.6426426851851852 | 19.116 | 19.162 | 19.191 |
| 0.6426426851851852 | 19.114 | 19.163 | 19.191 |
| 0.6426426851851852 | 19.112 | 19.165 | 19.191 |
| 0.6426426851851852 | 19.111 | 19.166 | 19.191 |
| 0.6426426851851852 | 19.11 | 19.168 | 19.191 |
| 0.6426426851851852 | 19.109 | 19.169 | 19.191 |
| 0.6426426967592592 | 19.108 | 19.169 | 19.191 |
| 0.6426426967592592 | 19.106 | 19.171 | 19.19 |
| 0.6426426967592592 | 19.106 | 19.173 | 19.19 |
| 0.6426426967592592 | 19.106 | 19.174 | 19.189 |
| 0.6426426967592592 | 19.104 | 19.175 | 19.188 |
| 0.6426426967592592 | 19.103 | 19.176 | 19.187 |
| 0.6426427083333334 | 19.104 | 19.177 | 19.186 |
| 0.6426427083333334 | 19.104 | 19.18 | 19.185 |
| 0.6426427083333334 | 19.103 | 19.181 | 19.183 |
| 0.6426427083333334 | 19.102 | 19.182 | 19.182 |
| 0.6426427083333334 | 19.103 | 19.183 | 19.181 |
| 0.6426427083333334 | 19.105 | 19.185 | 19.179 |
| 0.6426427083333334 | 19.106 | 19.186 | 19.177 |
| 0.6426427199074074 | 19.106 | 19.187 | 19.176 |
| 0.6426427199074074 | 19.106 | 19.187 | 19.174 |
| 0.6426427199074074 | 19.108 | 19.188 | 19.172 |
| 0.6426427199074074 | 19.11 | 19.188 | 19.171 |
| 0.6426427199074074 | 19.111 | 19.189 | 19.17 |
| 0.6426427199074074 | 19.112 | 19.189 | 19.168 |
| 0.6426427314814814 | 19.113 | 19.189 | 19.167 |
| 0.6426427314814814 | 19.115 | 19.188 | 19.166 |
| 0.6426427314814814 | 19.117 | 19.188 | 19.164 |
| 0.6426427314814814 | 19.118 | 19.187 | 19.163 |
| 0.6426427314814814 | 19.121 | 19.187 | 19.163 |
| 0.6426427314814814 | 19.122 | 19.186 | 19.162 |
| 0.6426427430555556 | 19.124 | 19.185 | 19.161 |
| 0.6426427430555556 | 19.126 | 19.184 | 19.16 |
| 0.6426427430555556 | 19.128 | 19.182 | 19.16 |
| 0.6426427430555556 | 19.13 | 19.18 | 19.16 |
| 0.6426427430555556 | 19.132 | 19.179 | 19.16 |
| 0.6426427430555556 | 19.133 | 19.178 | 19.16 |
| 0.6426427430555556 | 19.135 | 19.176 | 19.16 |
| 0.6426427546296296 | 19.136 | 19.174 | 19.162 |
| 0.6426427546296296 | 19.138 | 19.171 | 19.162 |
| 0.6426427546296296 | 19.139 | 19.17 | 19.163 |
| 0.6426427546296296 | 19.14 | 19.168 | 19.165 |
| 0.6426427546296296 | 19.14 | 19.167 | 19.167 |
| 0.6426427546296296 | 19.141 | 19.166 | 19.169 |
| 0.6426427662037036 | 19.141 | 19.164 | 19.171 |
| 0.6426427662037036 | 19.142 | 19.163 | 19.172 |
| 0.6426427662037036 | 19.142 | 19.162 | 19.175 |
| 0.6426427662037036 | 19.141 | 19.161 | 19.177 |
| 0.6426427662037036 | 19.141 | 19.16 | 19.179 |
| 0.6426427662037036 | 19.141 | 19.16 | 19.18 |
| 0.6426427662037036 | 19.14 | 19.16 | 19.183 |
| 0.6426427777777778 | 19.139 | 19.159 | 19.185 |
| 0.6426427777777778 | 19.138 | 19.159 | 19.186 |
| 0.6426427777777778 | 19.138 | 19.158 | 19.188 |
| 0.6426427777777778 | 19.137 | 19.159 | 19.189 |
| 0.6426427777777778 | 19.136 | 19.159 | 19.191 |
| 0.6426427777777778 | 19.134 | 19.159 | 19.193 |
| 0.6426427893518518 | 19.133 | 19.159 | 19.194 |
| 0.6426427893518518 | 19.132 | 19.159 | 19.195 |
| 0.6426427893518518 | 19.131 | 19.16 | 19.196 |
| 0.6426427893518518 | 19.129 | 19.161 | 19.198 |
| 0.6426427893518518 | 19.128 | 19.163 | 19.199 |
| 0.6426427893518518 | 19.127 | 19.164 | 19.199 |
| 0.642642800925926 | 19.125 | 19.165 | 19.2 |
| 0.642642800925926 | 19.124 | 19.166 | 19.201 |
| 0.642642800925926 | 19.122 | 19.167 | 19.201 |
| 0.642642800925926 | 19.121 | 19.169 | 19.201 |
| 0.642642800925926 | 19.12 | 19.171 | 19.201 |
| 0.642642800925926 | 19.118 | 19.172 | 19.201 |
| 0.642642800925926 | 19.117 | 19.173 | 19.201 |
| 0.6426428125 | 19.116 | 19.175 | 19.201 |
| 0.6426428125 | 19.116 | 19.177 | 19.2 |
| 0.6426428125 | 19.115 | 19.179 | 19.199 |
| 0.6426428125 | 19.113 | 19.179 | 19.199 |
| 0.6426428125 | 19.112 | 19.181 | 19.198 |
| 0.6426428125 | 19.113 | 19.183 | 19.197 |
| 0.6426428240740741 | 19.113 | 19.186 | 19.195 |
| 0.6426428240740741 | 19.112 | 19.187 | 19.194 |
| 0.6426428240740741 | 19.111 | 19.188 | 19.192 |
| 0.6426428240740741 | 19.111 | 19.189 | 19.191 |
| 0.6426428240740741 | 19.112 | 19.191 | 19.189 |
| 0.6426428240740741 | 19.112 | 19.193 | 19.187 |
| 0.6426428240740741 | 19.112 | 19.194 | 19.185 |
| 0.6426428356481482 | 19.113 | 19.194 | 19.183 |
| 0.6426428356481482 | 19.114 | 19.195 | 19.181 |
| 0.6426428356481482 | 19.116 | 19.196 | 19.18 |
| 0.6426428356481482 | 19.118 | 19.197 | 19.178 |
| 0.6426428356481482 | 19.119 | 19.197 | 19.177 |
| 0.6426428356481482 | 19.121 | 19.197 | 19.175 |
| 0.6426428472222222 | 19.123 | 19.197 | 19.174 |
| 0.6426428472222222 | 19.125 | 19.197 | 19.173 |
| 0.6426428472222222 | 19.126 | 19.196 | 19.172 |
| 0.6426428472222222 | 19.128 | 19.196 | 19.171 |
| 0.6426428472222222 | 19.13 | 19.195 | 19.171 |
| 0.6426428472222222 | 19.131 | 19.194 | 19.169 |
| 0.6426428587962963 | 19.133 | 19.193 | 19.169 |
| 0.6426428587962963 | 19.135 | 19.192 | 19.169 |
| 0.6426428587962963 | 19.137 | 19.191 | 19.169 |
| 0.6426428587962963 | 19.139 | 19.19 | 19.168 |
| 0.6426428587962963 | 19.14 | 19.188 | 19.168 |
| 0.6426428587962963 | 19.142 | 19.187 | 19.17 |
| 0.6426428587962963 | 19.144 | 19.185 | 19.171 |
| 0.6426428703703704 | 19.146 | 19.183 | 19.171 |
| 0.6426428703703704 | 19.147 | 19.181 | 19.172 |
| 0.6426428703703704 | 19.148 | 19.18 | 19.173 |
| 0.6426428703703704 | 19.149 | 19.178 | 19.175 |
| 0.6426428703703704 | 19.15 | 19.176 | 19.177 |
| 0.6426428703703704 | 19.15 | 19.175 | 19.178 |
| 0.6426428819444444 | 19.151 | 19.173 | 19.179 |
| 0.6426428819444444 | 19.151 | 19.172 | 19.181 |
| 0.6426428819444444 | 19.151 | 19.171 | 19.182 |
| 0.6426428819444444 | 19.151 | 19.169 | 19.184 |
| 0.6426428819444444 | 19.15 | 19.168 | 19.185 |
| 0.6426428819444444 | 19.15 | 19.168 | 19.187 |
| 0.6426428819444444 | 19.149 | 19.167 | 19.189 |
| 0.6426428935185186 | 19.148 | 19.165 | 19.19 |
| 0.6426428935185186 | 19.148 | 19.163 | 19.191 |
| 0.6426428935185186 | 19.147 | 19.163 | 19.193 |
| 0.6426428935185186 | 19.145 | 19.163 | 19.196 |
| 0.6426428935185186 | 19.144 | 19.163 | 19.197 |
| 0.6426428935185186 | 19.143 | 19.162 | 19.199 |
| 0.6426429050925926 | 19.141 | 19.162 | 19.2 |
| 0.6426429050925926 | 19.139 | 19.163 | 19.202 |
| 0.6426429050925926 | 19.138 | 19.164 | 19.204 |
| 0.6426429050925926 | 19.136 | 19.164 | 19.205 |
| 0.6426429050925926 | 19.135 | 19.165 | 19.206 |
| 0.6426429050925926 | 19.133 | 19.166 | 19.207 |
| 0.6426429166666666 | 19.131 | 19.167 | 19.207 |
| 0.6426429166666666 | 19.129 | 19.168 | 19.208 |
| 0.6426429166666666 | 19.128 | 19.17 | 19.208 |
| 0.6426429166666666 | 19.127 | 19.171 | 19.209 |
| 0.6426429166666666 | 19.125 | 19.173 | 19.209 |
| 0.6426429166666666 | 19.124 | 19.175 | 19.209 |
| 0.6426429166666666 | 19.123 | 19.177 | 19.208 |
| 0.6426429282407408 | 19.122 | 19.18 | 19.208 |
| 0.6426429282407408 | 19.121 | 19.182 | 19.207 |
| 0.6426429282407408 | 19.12 | 19.183 | 19.207 |
| 0.6426429282407408 | 19.12 | 19.185 | 19.206 |
| 0.6426429282407408 | 19.121 | 19.188 | 19.205 |
| 0.6426429282407408 | 19.121 | 19.191 | 19.204 |
| 0.6426429398148148 | 19.119 | 19.192 | 19.202 |
| 0.6426429398148148 | 19.119 | 19.193 | 19.201 |
| 0.6426429398148148 | 19.12 | 19.194 | 19.2 |
| 0.6426429398148148 | 19.121 | 19.197 | 19.198 |
| 0.6426429398148148 | 19.122 | 19.198 | 19.197 |
| 0.6426429398148148 | 19.122 | 19.199 | 19.195 |
| 0.6426429398148148 | 19.122 | 19.2 | 19.194 |
| 0.6426429513888888 | 19.124 | 19.201 | 19.192 |
| 0.6426429513888888 | 19.126 | 19.202 | 19.191 |
| 0.6426429513888888 | 19.127 | 19.202 | 19.19 |
| 0.6426429513888888 | 19.128 | 19.203 | 19.188 |
| 0.6426429513888888 | 19.129 | 19.203 | 19.187 |
| 0.6426429513888888 | 19.132 | 19.203 | 19.186 |
| 0.642642962962963 | 19.133 | 19.203 | 19.184 |
| 0.642642962962963 | 19.135 | 19.203 | 19.183 |
| 0.642642962962963 | 19.137 | 19.203 | 19.183 |
| 0.642642962962963 | 19.138 | 19.202 | 19.182 |
| 0.642642962962963 | 19.14 | 19.202 | 19.181 |
| 0.642642962962963 | 19.141 | 19.201 | 19.18 |
| 0.642642974537037 | 19.143 | 19.2 | 19.18 |
| 0.642642974537037 | 19.144 | 19.199 | 19.179 |
| 0.642642974537037 | 19.145 | 19.198 | 19.179 |
| 0.642642974537037 | 19.147 | 19.197 | 19.178 |
| 0.642642974537037 | 19.148 | 19.196 | 19.179 |
| 0.642642974537037 | 19.15 | 19.194 | 19.179 |
| 0.642642974537037 | 19.151 | 19.193 | 19.178 |
| 0.642642986111111 | 19.152 | 19.192 | 19.178 |
| 0.642642986111111 | 19.153 | 19.191 | 19.18 |
| 0.642642986111111 | 19.154 | 19.189 | 19.181 |
| 0.642642986111111 | 19.155 | 19.187 | 19.182 |
| 0.642642986111111 | 19.156 | 19.185 | 19.183 |
| 0.642642986111111 | 19.156 | 19.184 | 19.184 |
| 0.6426429976851852 | 19.157 | 19.183 | 19.186 |
| 0.6426429976851852 | 19.157 | 19.181 | 19.188 |
| 0.6426429976851852 | 19.157 | 19.179 | 19.189 |
| 0.6426429976851852 | 19.157 | 19.178 | 19.191 |
| 0.6426429976851852 | 19.156 | 19.177 | 19.193 |
| 0.6426429976851852 | 19.156 | 19.176 | 19.195 |
| 0.6426429976851852 | 19.155 | 19.174 | 19.196 |
| 0.6426430092592593 | 19.155 | 19.174 | 19.197 |
| 0.6426430092592593 | 19.154 | 19.175 | 19.199 |
| 0.6426430092592593 | 19.153 | 19.174 | 19.201 |
| 0.6426430092592593 | 19.152 | 19.173 | 19.203 |
| 0.6426430092592593 | 19.151 | 19.172 | 19.204 |
| 0.6426430092592593 | 19.15 | 19.173 | 19.205 |
| 0.6426430208333334 | 19.148 | 19.174 | 19.207 |
| 0.6426430208333334 | 19.147 | 19.174 | 19.209 |
| 0.6426430208333334 | 19.145 | 19.175 | 19.21 |
| 0.6426430208333334 | 19.143 | 19.175 | 19.211 |
| 0.6426430208333334 | 19.142 | 19.176 | 19.213 |
| 0.6426430208333334 | 19.14 | 19.177 | 19.214 |
| 0.6426430324074074 | 19.139 | 19.179 | 19.214 |
| 0.6426430324074074 | 19.137 | 19.18 | 19.215 |
| 0.6426430324074074 | 19.136 | 19.181 | 19.215 |
| 0.6426430324074074 | 19.134 | 19.182 | 19.216 |
| 0.6426430324074074 | 19.133 | 19.184 | 19.216 |
| 0.6426430324074074 | 19.132 | 19.185 | 19.216 |
| 0.6426430324074074 | 19.132 | 19.187 | 19.216 |
| 0.6426430439814815 | 19.13 | 19.188 | 19.215 |
| 0.6426430439814815 | 19.129 | 19.188 | 19.215 |
| 0.6426430439814815 | 19.128 | 19.19 | 19.214 |
| 0.6426430439814815 | 19.129 | 19.192 | 19.214 |
| 0.6426430439814815 | 19.128 | 19.193 | 19.213 |
| 0.6426430439814815 | 19.126 | 19.194 | 19.212 |
| 0.6426430555555556 | 19.126 | 19.195 | 19.211 |
| 0.6426430555555556 | 19.127 | 19.197 | 19.21 |
| 0.6426430555555556 | 19.127 | 19.199 | 19.209 |
| 0.6426430555555556 | 19.127 | 19.2 | 19.207 |
| 0.6426430555555556 | 19.126 | 19.201 | 19.206 |
| 0.6426430555555556 | 19.127 | 19.202 | 19.204 |
| 0.6426430555555556 | 19.129 | 19.204 | 19.203 |
| 0.6426430671296296 | 19.13 | 19.205 | 19.201 |
| 0.6426430671296296 | 19.13 | 19.206 | 19.199 |
| 0.6426430671296296 | 19.131 | 19.206 | 19.197 |
| 0.6426430671296296 | 19.132 | 19.207 | 19.196 |
| 0.6426430671296296 | 19.134 | 19.207 | 19.194 |
| 0.6426430671296296 | 19.135 | 19.207 | 19.193 |
| 0.6426430787037037 | 19.136 | 19.207 | 19.191 |
| 0.6426430787037037 | 19.137 | 19.207 | 19.19 |
| 0.6426430787037037 | 19.139 | 19.207 | 19.189 |
| 0.6426430787037037 | 19.14 | 19.206 | 19.187 |
| 0.6426430787037037 | 19.142 | 19.205 | 19.186 |
| 0.6426430787037037 | 19.144 | 19.205 | 19.186 |
| 0.6426430902777778 | 19.145 | 19.204 | 19.186 |
| 0.6426430902777778 | 19.147 | 19.203 | 19.185 |
| 0.6426430902777778 | 19.148 | 19.202 | 19.184 |
| 0.6426430902777778 | 19.15 | 19.201 | 19.184 |
| 0.6426430902777778 | 19.152 | 19.199 | 19.184 |
| 0.6426430902777778 | 19.153 | 19.198 | 19.184 |
| 0.6426430902777778 | 19.154 | 19.197 | 19.185 |
| 0.6426431018518518 | 19.156 | 19.195 | 19.186 |
| 0.6426431018518518 | 19.157 | 19.193 | 19.186 |
| 0.6426431018518518 | 19.158 | 19.191 | 19.187 |
| 0.6426431018518518 | 19.159 | 19.19 | 19.188 |
| 0.6426431018518518 | 19.16 | 19.189 | 19.189 |
| 0.6426431018518518 | 19.16 | 19.187 | 19.191 |
| 0.642643113425926 | 19.161 | 19.186 | 19.192 |
| 0.642643113425926 | 19.161 | 19.184 | 19.193 |
| 0.642643113425926 | 19.161 | 19.183 | 19.194 |
| 0.642643113425926 | 19.161 | 19.183 | 19.196 |
| 0.642643113425926 | 19.16 | 19.182 | 19.198 |
| 0.642643113425926 | 19.16 | 19.18 | 19.199 |
| 0.642643113425926 | 19.16 | 19.18 | 19.2 |
| 0.642643125 | 19.159 | 19.181 | 19.203 |
| 0.642643125 | 19.158 | 19.18 | 19.205 |
| 0.642643125 | 19.157 | 19.179 | 19.206 |
| 0.642643125 | 19.157 | 19.179 | 19.207 |
| 0.642643125 | 19.156 | 19.179 | 19.209 |
| 0.642643125 | 19.155 | 19.18 | 19.211 |
| 0.642643136574074 | 19.153 | 19.18 | 19.212 |
| 0.642643136574074 | 19.152 | 19.179 | 19.213 |
| 0.642643136574074 | 19.15 | 19.179 | 19.214 |
| 0.642643136574074 | 19.149 | 19.18 | 19.215 |
| 0.642643136574074 | 19.147 | 19.181 | 19.216 |
| 0.642643136574074 | 19.146 | 19.181 | 19.217 |
| 0.6426431481481482 | 19.144 | 19.182 | 19.218 |
| 0.6426431481481482 | 19.143 | 19.182 | 19.218 |
| 0.6426431481481482 | 19.142 | 19.184 | 19.219 |
| 0.6426431481481482 | 19.14 | 19.185 | 19.219 |
| 0.6426431481481482 | 19.14 | 19.187 | 19.219 |
| 0.6426431481481482 | 19.139 | 19.188 | 19.219 |
| 0.6426431481481482 | 19.137 | 19.19 | 19.219 |
| 0.6426431597222222 | 19.136 | 19.191 | 19.219 |
| 0.6426431597222222 | 19.136 | 19.193 | 19.218 |
| 0.6426431597222222 | 19.136 | 19.196 | 19.217 |
| 0.6426431597222222 | 19.135 | 19.196 | 19.217 |
| 0.6426431597222222 | 19.133 | 19.197 | 19.216 |
| 0.6426431597222222 | 19.132 | 19.198 | 19.215 |
| 0.6426431712962963 | 19.133 | 19.2 | 19.214 |
| 0.6426431712962963 | 19.133 | 19.202 | 19.213 |
| 0.6426431712962963 | 19.132 | 19.203 | 19.211 |
| 0.6426431712962963 | 19.131 | 19.204 | 19.21 |
| 0.6426431712962963 | 19.131 | 19.205 | 19.209 |
| 0.6426431712962963 | 19.132 | 19.207 | 19.207 |
| 0.6426431712962963 | 19.133 | 19.208 | 19.205 |
| 0.6426431828703704 | 19.133 | 19.208 | 19.204 |
| 0.6426431828703704 | 19.133 | 19.209 | 19.203 |
| 0.6426431828703704 | 19.134 | 19.21 | 19.201 |
| 0.6426431828703704 | 19.136 | 19.21 | 19.2 |
| 0.6426431828703704 | 19.137 | 19.21 | 19.198 |
| 0.6426431828703704 | 19.138 | 19.211 | 19.197 |
| 0.6426431944444445 | 19.139 | 19.211 | 19.196 |
| 0.6426431944444445 | 19.142 | 19.21 | 19.195 |
| 0.6426431944444445 | 19.143 | 19.21 | 19.194 |
| 0.6426431944444445 | 19.145 | 19.21 | 19.193 |
| 0.6426431944444445 | 19.146 | 19.209 | 19.193 |
| 0.6426431944444445 | 19.148 | 19.208 | 19.192 |
| 0.6426432060185185 | 19.15 | 19.207 | 19.191 |
| 0.6426432060185185 | 19.152 | 19.206 | 19.191 |
| 0.6426432060185185 | 19.154 | 19.205 | 19.191 |
| 0.6426432060185185 | 19.156 | 19.204 | 19.191 |
| 0.6426432060185185 | 19.157 | 19.203 | 19.191 |
| 0.6426432060185185 | 19.158 | 19.202 | 19.191 |
| 0.6426432060185185 | 19.16 | 19.2 | 19.191 |
| 0.6426432175925926 | 19.161 | 19.199 | 19.192 |
| 0.6426432175925926 | 19.162 | 19.197 | 19.191 |
| 0.6426432175925926 | 19.163 | 19.195 | 19.191 |
| 0.6426432175925926 | 19.163 | 19.194 | 19.192 |
| 0.6426432175925926 | 19.164 | 19.192 | 19.193 |
| 0.6426432175925926 | 19.164 | 19.191 | 19.194 |
| 0.6426432291666667 | 19.165 | 19.189 | 19.195 |
| 0.6426432291666667 | 19.165 | 19.188 | 19.196 |
| 0.6426432291666667 | 19.165 | 19.187 | 19.198 |
| 0.6426432291666667 | 19.165 | 19.185 | 19.199 |
| 0.6426432291666667 | 19.165 | 19.183 | 19.2 |
| 0.6426432291666667 | 19.164 | 19.183 | 19.201 |
| 0.6426432291666667 | 19.164 | 19.183 | 19.204 |
| 0.6426432407407408 | 19.163 | 19.182 | 19.206 |
| 0.6426432407407408 | 19.162 | 19.18 | 19.207 |
| 0.6426432407407408 | 19.161 | 19.179 | 19.208 |
| 0.6426432407407408 | 19.161 | 19.18 | 19.21 |
| 0.6426432407407408 | 19.159 | 19.18 | 19.212 |
| 0.6426432407407408 | 19.158 | 19.179 | 19.213 |
| 0.6426432523148148 | 19.157 | 19.178 | 19.214 |
| 0.6426432523148148 | 19.156 | 19.179 | 19.215 |
| 0.6426432523148148 | 19.154 | 19.18 | 19.217 |
| 0.6426432523148148 | 19.153 | 19.181 | 19.218 |
| 0.6426432523148148 | 19.152 | 19.181 | 19.219 |
| 0.6426432523148148 | 19.15 | 19.182 | 19.22 |
| 0.6426432638888889 | 19.149 | 19.183 | 19.22 |
| 0.6426432638888889 | 19.147 | 19.184 | 19.221 |
| 0.6426432638888889 | 19.146 | 19.186 | 19.221 |
| 0.6426432638888889 | 19.144 | 19.187 | 19.222 |
| 0.6426432638888889 | 19.144 | 19.188 | 19.222 |
| 0.6426432638888889 | 19.142 | 19.19 | 19.222 |
| 0.6426432638888889 | 19.141 | 19.192 | 19.222 |
| 0.642643275462963 | 19.141 | 19.194 | 19.221 |
| 0.642643275462963 | 19.141 | 19.197 | 19.221 |
| 0.642643275462963 | 19.14 | 19.198 | 19.22 |
| 0.642643275462963 | 19.139 | 19.199 | 19.22 |
| 0.642643275462963 | 19.139 | 19.201 | 19.219 |
| 0.642643275462963 | 19.139 | 19.203 | 19.218 |
| 0.642643287037037 | 19.139 | 19.205 | 19.217 |
| 0.642643287037037 | 19.137 | 19.206 | 19.215 |
| 0.642643287037037 | 19.136 | 19.207 | 19.215 |
| 0.642643287037037 | 19.137 | 19.208 | 19.213 |
| 0.642643287037037 | 19.139 | 19.21 | 19.212 |
| 0.642643287037037 | 19.138 | 19.211 | 19.21 |
| 0.642643287037037 | 19.138 | 19.211 | 19.209 |
| 0.6426432986111111 | 19.138 | 19.212 | 19.207 |
| 0.6426432986111111 | 19.14 | 19.213 | 19.206 |
| 0.6426432986111111 | 19.142 | 19.214 | 19.205 |
| 0.6426432986111111 | 19.142 | 19.214 | 19.204 |
| 0.6426432986111111 | 19.143 | 19.214 | 19.202 |
| 0.6426432986111111 | 19.145 | 19.214 | 19.201 |
| 0.6426433101851852 | 19.147 | 19.215 | 19.2 |
| 0.6426433101851852 | 19.148 | 19.214 | 19.198 |
| 0.6426433101851852 | 19.149 | 19.214 | 19.198 |
| 0.6426433101851852 | 19.151 | 19.214 | 19.198 |
| 0.6426433101851852 | 19.152 | 19.213 | 19.197 |
| 0.6426433101851852 | 19.153 | 19.213 | 19.195 |
| 0.6426433217592592 | 19.154 | 19.212 | 19.194 |
| 0.6426433217592592 | 19.156 | 19.211 | 19.194 |
| 0.6426433217592592 | 19.157 | 19.21 | 19.194 |
| 0.6426433217592592 | 19.158 | 19.209 | 19.193 |
| 0.6426433217592592 | 19.159 | 19.208 | 19.193 |
| 0.6426433217592592 | 19.16 | 19.207 | 19.193 |
| 0.6426433217592592 | 19.162 | 19.205 | 19.193 |
| 0.6426433333333333 | 19.163 | 19.204 | 19.193 |
| 0.6426433333333333 | 19.164 | 19.202 | 19.193 |
| 0.6426433333333333 | 19.165 | 19.201 | 19.194 |
| 0.6426433333333333 | 19.166 | 19.199 | 19.195 |
| 0.6426433333333333 | 19.167 | 19.198 | 19.196 |
| 0.6426433333333333 | 19.167 | 19.196 | 19.197 |
| 0.6426433449074074 | 19.168 | 19.194 | 19.199 |
| 0.6426433449074074 | 19.168 | 19.193 | 19.201 |
| 0.6426433449074074 | 19.168 | 19.191 | 19.202 |
| 0.6426433449074074 | 19.168 | 19.19 | 19.203 |
| 0.6426433449074074 | 19.168 | 19.189 | 19.204 |
| 0.6426433449074074 | 19.167 | 19.188 | 19.207 |
| 0.6426433449074074 | 19.167 | 19.187 | 19.208 |
| 0.6426433564814814 | 19.166 | 19.185 | 19.209 |
| 0.6426433564814814 | 19.166 | 19.184 | 19.21 |
| 0.6426433564814814 | 19.165 | 19.184 | 19.212 |
| 0.6426433564814814 | 19.164 | 19.184 | 19.213 |
| 0.6426433564814814 | 19.162 | 19.182 | 19.214 |
| 0.6426433564814814 | 19.161 | 19.181 | 19.215 |
| 0.6426433680555556 | 19.16 | 19.181 | 19.216 |
| 0.6426433680555556 | 19.159 | 19.182 | 19.218 |
| 0.6426433680555556 | 19.157 | 19.182 | 19.22 |
| 0.6426433680555556 | 19.155 | 19.182 | 19.221 |
| 0.6426433680555556 | 19.154 | 19.182 | 19.221 |
| 0.6426433680555556 | 19.152 | 19.184 | 19.223 |
| 0.6426433796296297 | 19.15 | 19.185 | 19.224 |
| 0.6426433796296297 | 19.149 | 19.186 | 19.224 |
| 0.6426433796296297 | 19.147 | 19.188 | 19.225 |
| 0.6426433796296297 | 19.146 | 19.189 | 19.225 |
| 0.6426433796296297 | 19.144 | 19.19 | 19.225 |
| 0.6426433796296297 | 19.142 | 19.191 | 19.225 |
| 0.6426433796296297 | 19.141 | 19.193 | 19.225 |
| 0.6426433912037037 | 19.141 | 19.194 | 19.225 |
| 0.6426433912037037 | 19.139 | 19.195 | 19.224 |
| 0.6426433912037037 | 19.137 | 19.196 | 19.224 |
| 0.6426433912037037 | 19.137 | 19.198 | 19.223 |
| 0.6426433912037037 | 19.137 | 19.2 | 19.222 |
| 0.6426433912037037 | 19.136 | 19.202 | 19.221 |
| 0.6426434027777778 | 19.135 | 19.202 | 19.22 |
| 0.6426434027777778 | 19.135 | 19.204 | 19.219 |
| 0.6426434027777778 | 19.136 | 19.206 | 19.218 |
| 0.6426434027777778 | 19.136 | 19.208 | 19.216 |
| 0.6426434027777778 | 19.135 | 19.209 | 19.214 |
| 0.6426434027777778 | 19.135 | 19.21 | 19.212 |
| 0.6426434027777778 | 19.136 | 19.211 | 19.211 |
| 0.6426434143518519 | 19.138 | 19.213 | 19.209 |
| 0.6426434143518519 | 19.139 | 19.214 | 19.207 |
| 0.6426434143518519 | 19.14 | 19.214 | 19.205 |
| 0.6426434143518519 | 19.14 | 19.215 | 19.203 |
| 0.6426434143518519 | 19.142 | 19.215 | 19.202 |
| 0.6426434143518519 | 19.144 | 19.216 | 19.2 |
| 0.6426434259259259 | 19.145 | 19.216 | 19.199 |
| 0.6426434259259259 | 19.146 | 19.216 | 19.198 |
| 0.6426434259259259 | 19.147 | 19.215 | 19.197 |
| 0.6426434259259259 | 19.149 | 19.215 | 19.195 |
| 0.6426434259259259 | 19.15 | 19.214 | 19.194 |
| 0.6426434259259259 | 19.152 | 19.214 | 19.193 |
| 0.6426434375 | 19.153 | 19.213 | 19.193 |
| 0.6426434375 | 19.155 | 19.212 | 19.192 |
| 0.6426434375 | 19.156 | 19.211 | 19.191 |
| 0.6426434375 | 19.157 | 19.21 | 19.19 |
| 0.6426434375 | 19.159 | 19.208 | 19.191 |
| 0.6426434375 | 19.161 | 19.207 | 19.191 |
| 0.6426434375 | 19.162 | 19.205 | 19.191 |
| 0.6426434490740741 | 19.163 | 19.204 | 19.191 |
| 0.6426434490740741 | 19.165 | 19.202 | 19.192 |
| 0.6426434490740741 | 19.166 | 19.2 | 19.193 |
| 0.6426434490740741 | 19.167 | 19.197 | 19.194 |
| 0.6426434490740741 | 19.168 | 19.196 | 19.195 |
| 0.6426434490740741 | 19.169 | 19.194 | 19.196 |
| 0.6426434606481481 | 19.169 | 19.193 | 19.198 |
| 0.6426434606481481 | 19.17 | 19.191 | 19.199 |
| 0.6426434606481481 | 19.17 | 19.189 | 19.2 |
| 0.6426434606481481 | 19.17 | 19.188 | 19.202 |
| 0.6426434606481481 | 19.169 | 19.188 | 19.204 |
| 0.6426434606481481 | 19.169 | 19.186 | 19.205 |
| 0.6426434606481481 | 19.169 | 19.184 | 19.206 |
| 0.6426434722222222 | 19.168 | 19.184 | 19.208 |
| 0.6426434722222222 | 19.167 | 19.184 | 19.211 |
| 0.6426434722222222 | 19.166 | 19.184 | 19.212 |
| 0.6426434722222222 | 19.165 | 19.182 | 19.214 |
| 0.6426434722222222 | 19.164 | 19.181 | 19.215 |
| 0.6426434722222222 | 19.163 | 19.182 | 19.217 |
| 0.6426434837962963 | 19.161 | 19.182 | 19.219 |
| 0.6426434837962963 | 19.159 | 19.181 | 19.221 |
| 0.6426434837962963 | 19.157 | 19.181 | 19.222 |
| 0.6426434837962963 | 19.155 | 19.181 | 19.223 |
| 0.6426434837962963 | 19.153 | 19.182 | 19.225 |
| 0.6426434837962963 | 19.151 | 19.183 | 19.226 |
| 0.6426434953703704 | 19.149 | 19.184 | 19.227 |
| 0.6426434953703704 | 19.147 | 19.184 | 19.228 |
| 0.6426434953703704 | 19.146 | 19.186 | 19.228 |
| 0.6426434953703704 | 19.144 | 19.187 | 19.228 |
| 0.6426434953703704 | 19.142 | 19.189 | 19.229 |
| 0.6426434953703704 | 19.141 | 19.191 | 19.229 |
| 0.6426434953703704 | 19.14 | 19.192 | 19.229 |
| 0.6426435069444444 | 19.138 | 19.193 | 19.228 |
| 0.6426435069444444 | 19.137 | 19.195 | 19.228 |
| 0.6426435069444444 | 19.137 | 19.197 | 19.227 |
| 0.6426435069444444 | 19.136 | 19.2 | 19.226 |
| 0.6426435069444444 | 19.135 | 19.201 | 19.225 |
| 0.6426435069444444 | 19.134 | 19.202 | 19.224 |
| 0.6426435185185185 | 19.134 | 19.204 | 19.223 |
| 0.6426435185185185 | 19.135 | 19.207 | 19.222 |
| 0.6426435185185185 | 19.135 | 19.209 | 19.22 |
| 0.6426435185185185 | 19.134 | 19.21 | 19.219 |
| 0.6426435185185185 | 19.134 | 19.211 | 19.217 |
| 0.6426435185185185 | 19.135 | 19.213 | 19.215 |
| 0.6426435185185185 | 19.137 | 19.214 | 19.213 |
| 0.6426435300925926 | 19.137 | 19.216 | 19.211 |
| 0.6426435300925926 | 19.138 | 19.216 | 19.21 |
| 0.6426435300925926 | 19.139 | 19.217 | 19.208 |
| 0.6426435300925926 | 19.141 | 19.218 | 19.207 |
| 0.6426435300925926 | 19.143 | 19.218 | 19.205 |
| 0.6426435300925926 | 19.144 | 19.218 | 19.204 |
| 0.6426435416666666 | 19.145 | 19.218 | 19.202 |
| 0.6426435416666666 | 19.147 | 19.218 | 19.202 |
| 0.6426435416666666 | 19.15 | 19.218 | 19.2 |
| 0.6426435416666666 | 19.151 | 19.217 | 19.198 |
| 0.6426435416666666 | 19.153 | 19.217 | 19.198 |
| 0.6426435416666666 | 19.156 | 19.216 | 19.197 |
| 0.6426435532407407 | 19.157 | 19.215 | 19.196 |
| 0.6426435532407407 | 19.159 | 19.214 | 19.195 |
| 0.6426435532407407 | 19.161 | 19.213 | 19.194 |
| 0.6426435532407407 | 19.163 | 19.212 | 19.195 |
| 0.6426435532407407 | 19.165 | 19.21 | 19.195 |
| 0.6426435532407407 | 19.166 | 19.208 | 19.194 |
| 0.6426435532407407 | 19.167 | 19.207 | 19.193 |
| 0.6426435648148149 | 19.169 | 19.205 | 19.194 |
| 0.6426435648148149 | 19.17 | 19.203 | 19.194 |
| 0.6426435648148149 | 19.171 | 19.201 | 19.195 |
| 0.6426435648148149 | 19.172 | 19.2 | 19.196 |
| 0.6426435648148149 | 19.173 | 19.198 | 19.197 |
| 0.6426435648148149 | 19.174 | 19.197 | 19.199 |
| 0.6426435763888889 | 19.174 | 19.195 | 19.2 |
| 0.6426435763888889 | 19.175 | 19.193 | 19.202 |
| 0.6426435763888889 | 19.175 | 19.192 | 19.204 |
| 0.6426435763888889 | 19.175 | 19.191 | 19.206 |
| 0.6426435763888889 | 19.174 | 19.189 | 19.208 |
| 0.6426435763888889 | 19.174 | 19.187 | 19.209 |
| 0.6426435763888889 | 19.174 | 19.187 | 19.211 |
| 0.642643587962963 | 19.173 | 19.187 | 19.214 |
| 0.642643587962963 | 19.172 | 19.186 | 19.216 |
| 0.642643587962963 | 19.171 | 19.184 | 19.217 |
| 0.642643587962963 | 19.17 | 19.183 | 19.219 |
| 0.642643587962963 | 19.169 | 19.184 | 19.221 |
| 0.642643587962963 | 19.167 | 19.185 | 19.223 |
| 0.6426435995370371 | 19.166 | 19.184 | 19.225 |
| 0.6426435995370371 | 19.164 | 19.183 | 19.226 |
| 0.6426435995370371 | 19.163 | 19.184 | 19.227 |
| 0.6426435995370371 | 19.161 | 19.185 | 19.229 |
| 0.6426435995370371 | 19.159 | 19.186 | 19.231 |
| 0.6426435995370371 | 19.157 | 19.187 | 19.232 |
| 0.6426436111111111 | 19.156 | 19.188 | 19.232 |
| 0.6426436111111111 | 19.154 | 19.19 | 19.233 |
| 0.6426436111111111 | 19.152 | 19.192 | 19.234 |
| 0.6426436111111111 | 19.151 | 19.193 | 19.234 |
| 0.6426436111111111 | 19.149 | 19.195 | 19.235 |
| 0.6426436111111111 | 19.148 | 19.197 | 19.235 |
| 0.6426436111111111 | 19.147 | 19.199 | 19.234 |
| 0.6426436226851852 | 19.145 | 19.201 | 19.234 |
| 0.6426436226851852 | 19.145 | 19.203 | 19.234 |
| 0.6426436226851852 | 19.144 | 19.206 | 19.233 |
| 0.6426436226851852 | 19.143 | 19.207 | 19.232 |
| 0.6426436226851852 | 19.141 | 19.208 | 19.231 |
| 0.6426436226851852 | 19.141 | 19.21 | 19.23 |
| 0.6426436342592593 | 19.142 | 19.213 | 19.229 |
| 0.6426436342592593 | 19.142 | 19.214 | 19.228 |
| 0.6426436342592593 | 19.14 | 19.215 | 19.226 |
| 0.6426436342592593 | 19.14 | 19.216 | 19.225 |
| 0.6426436342592593 | 19.142 | 19.218 | 19.224 |
| 0.6426436342592593 | 19.143 | 19.22 | 19.222 |
| 0.6426436342592593 | 19.143 | 19.222 | 19.22 |
| 0.6426436458333333 | 19.143 | 19.222 | 19.219 |
| 0.6426436458333333 | 19.145 | 19.223 | 19.217 |
| 0.6426436458333333 | 19.147 | 19.224 | 19.215 |
| 0.6426436458333333 | 19.149 | 19.225 | 19.214 |
| 0.6426436458333333 | 19.15 | 19.226 | 19.212 |
| 0.6426436458333333 | 19.152 | 19.226 | 19.211 |
| 0.6426436574074074 | 19.154 | 19.226 | 19.21 |
| 0.6426436574074074 | 19.156 | 19.226 | 19.208 |
| 0.6426436574074074 | 19.158 | 19.226 | 19.207 |
| 0.6426436574074074 | 19.159 | 19.225 | 19.206 |
| 0.6426436574074074 | 19.162 | 19.225 | 19.207 |
| 0.6426436574074074 | 19.164 | 19.224 | 19.206 |
| 0.6426436689814815 | 19.165 | 19.223 | 19.204 |
| 0.6426436689814815 | 19.167 | 19.222 | 19.204 |
| 0.6426436689814815 | 19.169 | 19.221 | 19.204 |
| 0.6426436689814815 | 19.171 | 19.22 | 19.204 |
| 0.6426436689814815 | 19.172 | 19.219 | 19.204 |
| 0.6426436689814815 | 19.174 | 19.217 | 19.204 |
| 0.6426436689814815 | 19.175 | 19.216 | 19.205 |
| 0.6426436805555555 | 19.177 | 19.214 | 19.205 |
| 0.6426436805555555 | 19.178 | 19.212 | 19.205 |
| 0.6426436805555555 | 19.179 | 19.211 | 19.206 |
| 0.6426436805555555 | 19.18 | 19.209 | 19.208 |
| 0.6426436805555555 | 19.181 | 19.207 | 19.209 |
| 0.6426436805555555 | 19.182 | 19.205 | 19.21 |
| 0.6426436921296296 | 19.183 | 19.204 | 19.211 |
| 0.6426436921296296 | 19.183 | 19.202 | 19.213 |
| 0.6426436921296296 | 19.183 | 19.201 | 19.215 |
| 0.6426436921296296 | 19.183 | 19.199 | 19.217 |
| 0.6426436921296296 | 19.183 | 19.198 | 19.218 |
| 0.6426436921296296 | 19.183 | 19.197 | 19.22 |
| 0.6426436921296296 | 19.182 | 19.197 | 19.222 |
| 0.6426437037037037 | 19.181 | 19.195 | 19.223 |
| 0.6426437037037037 | 19.181 | 19.193 | 19.224 |
| 0.6426437037037037 | 19.18 | 19.193 | 19.226 |
| 0.6426437037037037 | 19.179 | 19.194 | 19.228 |
| 0.6426437037037037 | 19.178 | 19.194 | 19.23 |
| 0.6426437037037037 | 19.176 | 19.193 | 19.231 |
| 0.6426437152777777 | 19.175 | 19.192 | 19.232 |
| 0.6426437152777777 | 19.174 | 19.193 | 19.234 |
| 0.6426437152777777 | 19.172 | 19.194 | 19.236 |
| 0.6426437152777777 | 19.171 | 19.195 | 19.237 |
| 0.6426437152777777 | 19.169 | 19.195 | 19.238 |
| 0.6426437152777777 | 19.167 | 19.195 | 19.239 |
| 0.6426437268518518 | 19.165 | 19.197 | 19.24 |
| 0.6426437268518518 | 19.164 | 19.199 | 19.241 |
| 0.6426437268518518 | 19.162 | 19.201 | 19.242 |
| 0.6426437268518518 | 19.161 | 19.202 | 19.242 |
| 0.6426437268518518 | 19.16 | 19.203 | 19.242 |
| 0.6426437268518518 | 19.158 | 19.205 | 19.243 |
| 0.6426437268518518 | 19.156 | 19.207 | 19.242 |
| 0.6426437384259259 | 19.156 | 19.209 | 19.242 |
| 0.6426437384259259 | 19.155 | 19.211 | 19.242 |
| 0.6426437384259259 | 19.153 | 19.212 | 19.241 |
| 0.6426437384259259 | 19.152 | 19.213 | 19.241 |
| 0.6426437384259259 | 19.152 | 19.215 | 19.24 |
| 0.6426437384259259 | 19.151 | 19.218 | 19.239 |
| 0.6426437500000001 | 19.15 | 19.219 | 19.237 |
| 0.6426437500000001 | 19.15 | 19.22 | 19.236 |
| 0.6426437500000001 | 19.15 | 19.222 | 19.235 |
| 0.6426437500000001 | 19.151 | 19.224 | 19.233 |
| 0.6426437500000001 | 19.151 | 19.226 | 19.231 |
| 0.6426437500000001 | 19.15 | 19.227 | 19.229 |
| 0.6426437500000001 | 19.151 | 19.228 | 19.228 |
| 0.6426437615740741 | 19.152 | 19.23 | 19.226 |
| 0.6426437615740741 | 19.154 | 19.231 | 19.224 |
| 0.6426437615740741 | 19.155 | 19.232 | 19.222 |
| 0.6426437615740741 | 19.156 | 19.232 | 19.22 |
| 0.6426437615740741 | 19.157 | 19.233 | 19.218 |
| 0.6426437615740741 | 19.159 | 19.233 | 19.217 |
| 0.6426437731481481 | 19.161 | 19.233 | 19.216 |
| 0.6426437731481481 | 19.163 | 19.233 | 19.214 |
| 0.6426437731481481 | 19.164 | 19.233 | 19.214 |
| 0.6426437731481481 | 19.166 | 19.233 | 19.213 |
| 0.6426437731481481 | 19.168 | 19.232 | 19.212 |
| 0.6426437731481481 | 19.169 | 19.231 | 19.211 |
| 0.6426437847222223 | 19.171 | 19.231 | 19.21 |
| 0.6426437847222223 | 19.173 | 19.23 | 19.211 |
| 0.6426437847222223 | 19.175 | 19.229 | 19.21 |
| 0.6426437847222223 | 19.176 | 19.227 | 19.209 |
| 0.6426437847222223 | 19.178 | 19.226 | 19.209 |
| 0.6426437847222223 | 19.18 | 19.224 | 19.21 |
| 0.6426437847222223 | 19.182 | 19.223 | 19.211 |
| 0.6426437962962963 | 19.183 | 19.221 | 19.212 |
| 0.6426437962962963 | 19.185 | 19.22 | 19.212 |
| 0.6426437962962963 | 19.186 | 19.218 | 19.213 |
| 0.6426437962962963 | 19.187 | 19.216 | 19.214 |
| 0.6426437962962963 | 19.188 | 19.214 | 19.215 |
| 0.6426437962962963 | 19.189 | 19.213 | 19.217 |
| 0.6426438078703703 | 19.189 | 19.211 | 19.219 |
| 0.6426438078703703 | 19.19 | 19.21 | 19.22 |
| 0.6426438078703703 | 19.19 | 19.208 | 19.221 |
| 0.6426438078703703 | 19.19 | 19.207 | 19.223 |
| 0.6426438078703703 | 19.19 | 19.206 | 19.225 |
| 0.6426438078703703 | 19.189 | 19.206 | 19.227 |
| 0.6426438078703703 | 19.189 | 19.204 | 19.229 |
| 0.6426438194444445 | 19.189 | 19.203 | 19.229 |
| 0.6426438194444445 | 19.188 | 19.203 | 19.232 |
| 0.6426438194444445 | 19.187 | 19.204 | 19.235 |
| 0.6426438194444445 | 19.186 | 19.204 | 19.237 |
| 0.6426438194444445 | 19.184 | 19.202 | 19.238 |
| 0.6426438194444445 | 19.183 | 19.202 | 19.239 |
| 0.6426438310185185 | 19.182 | 19.203 | 19.242 |
| 0.6426438310185185 | 19.18 | 19.204 | 19.244 |
| 0.6426438310185185 | 19.179 | 19.203 | 19.245 |
| 0.6426438310185185 | 19.177 | 19.203 | 19.246 |
| 0.6426438310185185 | 19.175 | 19.204 | 19.247 |
| 0.6426438310185185 | 19.174 | 19.205 | 19.249 |
| 0.6426438425925926 | 19.172 | 19.207 | 19.25 |
| 0.6426438425925926 | 19.17 | 19.208 | 19.25 |
| 0.6426438425925926 | 19.168 | 19.208 | 19.251 |
| 0.6426438425925926 | 19.167 | 19.21 | 19.251 |
| 0.6426438425925926 | 19.166 | 19.212 | 19.252 |
| 0.6426438425925926 | 19.165 | 19.214 | 19.252 |
| 0.6426438425925926 | 19.164 | 19.216 | 19.252 |
| 0.6426438541666667 | 19.163 | 19.218 | 19.251 |
| 0.6426438541666667 | 19.162 | 19.219 | 19.251 |
| 0.6426438541666667 | 19.161 | 19.221 | 19.25 |
| 0.6426438541666667 | 19.162 | 19.223 | 19.25 |
| 0.6426438541666667 | 19.162 | 19.225 | 19.249 |
| 0.6426438541666667 | 19.161 | 19.227 | 19.248 |
| 0.6426438657407407 | 19.16 | 19.228 | 19.247 |
| 0.6426438657407407 | 19.16 | 19.23 | 19.246 |
| 0.6426438657407407 | 19.161 | 19.232 | 19.244 |
| 0.6426438657407407 | 19.162 | 19.234 | 19.243 |
| 0.6426438657407407 | 19.161 | 19.235 | 19.241 |
| 0.6426438657407407 | 19.161 | 19.236 | 19.24 |
| 0.6426438657407407 | 19.162 | 19.238 | 19.238 |
| 0.6426438773148148 | 19.163 | 19.239 | 19.236 |
| 0.6426438773148148 | 19.163 | 19.24 | 19.234 |
| 0.6426438773148148 | 19.164 | 19.241 | 19.233 |
| 0.6426438773148148 | 19.165 | 19.241 | 19.231 |
| 0.6426438773148148 | 19.168 | 19.242 | 19.23 |
| 0.6426438773148148 | 19.17 | 19.242 | 19.229 |
| 0.6426438888888889 | 19.171 | 19.242 | 19.227 |
| 0.6426438888888889 | 19.172 | 19.242 | 19.227 |
| 0.6426438888888889 | 19.175 | 19.242 | 19.226 |
| 0.6426438888888889 | 19.177 | 19.241 | 19.225 |
| 0.6426438888888889 | 19.178 | 19.241 | 19.224 |
| 0.6426438888888889 | 19.18 | 19.24 | 19.223 |
| 0.6426439004629629 | 19.182 | 19.24 | 19.223 |
| 0.6426439004629629 | 19.184 | 19.239 | 19.223 |
| 0.6426439004629629 | 19.186 | 19.238 | 19.222 |
| 0.6426439004629629 | 19.187 | 19.237 | 19.221 |
| 0.6426439004629629 | 19.189 | 19.235 | 19.221 |
| 0.6426439004629629 | 19.19 | 19.234 | 19.221 |
| 0.6426439004629629 | 19.191 | 19.232 | 19.221 |
| 0.642643912037037 | 19.192 | 19.231 | 19.221 |
| 0.642643912037037 | 19.194 | 19.23 | 19.221 |
| 0.642643912037037 | 19.195 | 19.228 | 19.222 |
| 0.642643912037037 | 19.196 | 19.226 | 19.223 |
| 0.642643912037037 | 19.197 | 19.225 | 19.224 |
| 0.642643912037037 | 19.197 | 19.223 | 19.226 |
| 0.6426439236111111 | 19.198 | 19.222 | 19.228 |
| 0.6426439236111111 | 19.198 | 19.221 | 19.229 |
| 0.6426439236111111 | 19.198 | 19.22 | 19.231 |
| 0.6426439236111111 | 19.198 | 19.219 | 19.233 |
| 0.6426439236111111 | 19.198 | 19.218 | 19.236 |
| 0.6426439236111111 | 19.198 | 19.217 | 19.237 |
| 0.6426439236111111 | 19.198 | 19.216 | 19.238 |
| 0.6426439351851853 | 19.197 | 19.216 | 19.241 |
| 0.6426439351851853 | 19.196 | 19.216 | 19.244 |
| 0.6426439351851853 | 19.195 | 19.215 | 19.245 |
| 0.6426439351851853 | 19.194 | 19.213 | 19.246 |
| 0.6426439351851853 | 19.193 | 19.213 | 19.247 |
| 0.6426439351851853 | 19.192 | 19.213 | 19.249 |
| 0.6426439467592593 | 19.191 | 19.214 | 19.251 |
| 0.6426439467592593 | 19.189 | 19.213 | 19.252 |
| 0.6426439467592593 | 19.188 | 19.213 | 19.253 |
| 0.6426439467592593 | 19.187 | 19.213 | 19.255 |
| 0.6426439467592593 | 19.185 | 19.215 | 19.256 |
| 0.6426439467592593 | 19.183 | 19.216 | 19.257 |
| 0.6426439583333333 | 19.182 | 19.216 | 19.258 |
| 0.6426439583333333 | 19.18 | 19.217 | 19.259 |
| 0.6426439583333333 | 19.178 | 19.219 | 19.259 |
| 0.6426439583333333 | 19.177 | 19.221 | 19.26 |
| 0.6426439583333333 | 19.175 | 19.222 | 19.26 |
| 0.6426439583333333 | 19.174 | 19.224 | 19.26 |
| 0.6426439583333333 | 19.173 | 19.225 | 19.26 |
| 0.6426439699074075 | 19.172 | 19.227 | 19.26 |
| 0.6426439699074075 | 19.171 | 19.229 | 19.26 |
| 0.6426439699074075 | 19.17 | 19.231 | 19.259 |
| 0.6426439699074075 | 19.17 | 19.233 | 19.259 |
| 0.6426439699074075 | 19.169 | 19.234 | 19.258 |
| 0.6426439699074075 | 19.168 | 19.235 | 19.257 |
| 0.6426439814814815 | 19.169 | 19.237 | 19.256 |
| 0.6426439814814815 | 19.169 | 19.24 | 19.255 |
| 0.6426439814814815 | 19.168 | 19.241 | 19.254 |
| 0.6426439814814815 | 19.167 | 19.242 | 19.252 |
| 0.6426439814814815 | 19.168 | 19.243 | 19.251 |
| 0.6426439814814815 | 19.17 | 19.245 | 19.25 |
| 0.6426439814814815 | 19.17 | 19.246 | 19.248 |
| 0.6426439930555555 | 19.17 | 19.247 | 19.247 |
| 0.6426439930555555 | 19.171 | 19.248 | 19.245 |
| 0.6426439930555555 | 19.173 | 19.249 | 19.243 |
| 0.6426439930555555 | 19.175 | 19.25 | 19.242 |
| 0.6426439930555555 | 19.177 | 19.25 | 19.241 |
| 0.6426439930555555 | 19.178 | 19.251 | 19.239 |
| 0.6426440046296297 | 19.18 | 19.251 | 19.238 |
| 0.6426440046296297 | 19.182 | 19.251 | 19.237 |
| 0.6426440046296297 | 19.184 | 19.25 | 19.235 |
| 0.6426440046296297 | 19.185 | 19.25 | 19.234 |
| 0.6426440046296297 | 19.186 | 19.25 | 19.234 |
| 0.6426440046296297 | 19.189 | 19.249 | 19.234 |
| 0.6426440162037037 | 19.19 | 19.248 | 19.233 |
| 0.6426440162037037 | 19.191 | 19.248 | 19.231 |
| 0.6426440162037037 | 19.193 | 19.247 | 19.231 |
| 0.6426440162037037 | 19.194 | 19.246 | 19.231 |
| 0.6426440162037037 | 19.196 | 19.245 | 19.231 |
| 0.6426440162037037 | 19.197 | 19.243 | 19.231 |
| 0.6426440162037037 | 19.198 | 19.242 | 19.231 |
| 0.6426440277777777 | 19.2 | 19.24 | 19.231 |
| 0.6426440277777777 | 19.201 | 19.238 | 19.232 |
| 0.6426440277777777 | 19.202 | 19.237 | 19.232 |
| 0.6426440277777777 | 19.203 | 19.236 | 19.233 |
| 0.6426440277777777 | 19.204 | 19.234 | 19.235 |
| 0.6426440277777777 | 19.205 | 19.233 | 19.236 |
| 0.6426440393518519 | 19.206 | 19.231 | 19.237 |
| 0.6426440393518519 | 19.206 | 19.229 | 19.239 |
| 0.6426440393518519 | 19.206 | 19.228 | 19.241 |
| 0.6426440393518519 | 19.206 | 19.228 | 19.242 |
| 0.6426440393518519 | 19.206 | 19.226 | 19.243 |
| 0.6426440393518519 | 19.206 | 19.225 | 19.244 |
| 0.6426440393518519 | 19.205 | 19.225 | 19.246 |
| 0.6426440509259259 | 19.205 | 19.224 | 19.249 |
| 0.6426440509259259 | 19.204 | 19.223 | 19.249 |
| 0.6426440509259259 | 19.204 | 19.221 | 19.249 |
| 0.6426440509259259 | 19.203 | 19.222 | 19.251 |
| 0.6426440509259259 | 19.202 | 19.222 | 19.253 |
| 0.6426440509259259 | 19.201 | 19.222 | 19.255 |
| 0.6426440625 | 19.199 | 19.22 | 19.256 |
| 0.6426440625 | 19.198 | 19.219 | 19.257 |
| 0.6426440625 | 19.197 | 19.221 | 19.259 |
| 0.6426440625 | 19.195 | 19.222 | 19.261 |
| 0.6426440625 | 19.193 | 19.222 | 19.262 |
| 0.6426440625 | 19.191 | 19.222 | 19.262 |
| 0.6426440740740741 | 19.189 | 19.222 | 19.263 |
| 0.6426440740740741 | 19.188 | 19.224 | 19.264 |
| 0.6426440740740741 | 19.186 | 19.226 | 19.265 |
| 0.6426440740740741 | 19.184 | 19.227 | 19.265 |
| 0.6426440740740741 | 19.183 | 19.228 | 19.266 |
| 0.6426440740740741 | 19.182 | 19.229 | 19.266 |
| 0.6426440740740741 | 19.18 | 19.231 | 19.266 |
| 0.6426440856481481 | 19.179 | 19.232 | 19.265 |
| 0.6426440856481481 | 19.178 | 19.234 | 19.265 |
| 0.6426440856481481 | 19.177 | 19.235 | 19.265 |
| 0.6426440856481481 | 19.175 | 19.236 | 19.264 |
| 0.6426440856481481 | 19.174 | 19.238 | 19.263 |
| 0.6426440856481481 | 19.173 | 19.24 | 19.262 |
| 0.6426440972222222 | 19.173 | 19.242 | 19.261 |
| 0.6426440972222222 | 19.172 | 19.243 | 19.26 |
| 0.6426440972222222 | 19.171 | 19.244 | 19.259 |
| 0.6426440972222222 | 19.171 | 19.246 | 19.257 |
| 0.6426440972222222 | 19.171 | 19.248 | 19.255 |
| 0.6426440972222222 | 19.172 | 19.249 | 19.253 |
| 0.6426440972222222 | 19.171 | 19.25 | 19.252 |
| 0.6426441087962963 | 19.172 | 19.251 | 19.25 |
| 0.6426441087962963 | 19.174 | 19.252 | 19.249 |
| 0.6426441087962963 | 19.176 | 19.253 | 19.247 |
| 0.6426441087962963 | 19.176 | 19.254 | 19.245 |
| 0.6426441087962963 | 19.177 | 19.254 | 19.243 |
| 0.6426441087962963 | 19.178 | 19.255 | 19.242 |
| 0.6426441203703704 | 19.18 | 19.255 | 19.241 |
| 0.6426441203703704 | 19.182 | 19.255 | 19.239 |
| 0.6426441203703704 | 19.183 | 19.255 | 19.237 |
| 0.6426441203703704 | 19.185 | 19.254 | 19.237 |
| 0.6426441203703704 | 19.188 | 19.254 | 19.236 |
| 0.6426441203703704 | 19.189 | 19.253 | 19.234 |
| 0.6426441319444445 | 19.191 | 19.252 | 19.233 |
| 0.6426441319444445 | 19.192 | 19.251 | 19.232 |
| 0.6426441319444445 | 19.194 | 19.251 | 19.233 |
| 0.6426441319444445 | 19.196 | 19.249 | 19.232 |
| 0.6426441319444445 | 19.198 | 19.248 | 19.231 |
| 0.6426441319444445 | 19.199 | 19.246 | 19.231 |
| 0.6426441319444445 | 19.201 | 19.245 | 19.232 |
| 0.6426441435185185 | 19.203 | 19.243 | 19.233 |
| 0.6426441435185185 | 19.204 | 19.242 | 19.234 |
| 0.6426441435185185 | 19.206 | 19.24 | 19.235 |
| 0.6426441435185185 | 19.207 | 19.238 | 19.235 |
| 0.6426441435185185 | 19.208 | 19.236 | 19.236 |
| 0.6426441435185185 | 19.208 | 19.234 | 19.237 |
| 0.6426441550925927 | 19.209 | 19.233 | 19.239 |
| 0.6426441550925927 | 19.209 | 19.231 | 19.24 |
| 0.6426441550925927 | 19.21 | 19.23 | 19.242 |
| 0.6426441550925927 | 19.21 | 19.228 | 19.243 |
| 0.6426441550925927 | 19.21 | 19.227 | 19.244 |
| 0.6426441550925927 | 19.209 | 19.226 | 19.246 |
| 0.6426441550925927 | 19.209 | 19.225 | 19.248 |
| 0.6426441666666667 | 19.208 | 19.224 | 19.249 |
| 0.6426441666666667 | 19.208 | 19.222 | 19.25 |
| 0.6426441666666667 | 19.207 | 19.223 | 19.252 |
| 0.6426441666666667 | 19.206 | 19.223 | 19.255 |
| 0.6426441666666667 | 19.205 | 19.223 | 19.257 |
| 0.6426441666666667 | 19.203 | 19.221 | 19.258 |
| 0.6426441782407407 | 19.202 | 19.221 | 19.259 |
| 0.6426441782407407 | 19.201 | 19.222 | 19.261 |
| 0.6426441782407407 | 19.199 | 19.223 | 19.263 |
| 0.6426441782407407 | 19.198 | 19.223 | 19.264 |
| 0.6426441782407407 | 19.196 | 19.223 | 19.265 |
| 0.6426441782407407 | 19.195 | 19.224 | 19.266 |
| 0.6426441898148149 | 19.193 | 19.226 | 19.268 |
| 0.6426441898148149 | 19.192 | 19.227 | 19.268 |
| 0.6426441898148149 | 19.19 | 19.228 | 19.269 |
| 0.6426441898148149 | 19.188 | 19.229 | 19.269 |
| 0.6426441898148149 | 19.187 | 19.231 | 19.27 |
| 0.6426441898148149 | 19.186 | 19.233 | 19.27 |
| 0.6426441898148149 | 19.185 | 19.235 | 19.27 |
| 0.6426442013888889 | 19.184 | 19.236 | 19.27 |
| 0.6426442013888889 | 19.183 | 19.238 | 19.269 |
| 0.6426442013888889 | 19.182 | 19.239 | 19.269 |
| 0.6426442013888889 | 19.181 | 19.241 | 19.268 |
| 0.6426442013888889 | 19.181 | 19.244 | 19.267 |
| 0.6426442013888889 | 19.18 | 19.245 | 19.267 |
| 0.6426442129629629 | 19.179 | 19.246 | 19.266 |
| 0.6426442129629629 | 19.178 | 19.247 | 19.264 |
| 0.6426442129629629 | 19.178 | 19.249 | 19.263 |
| 0.6426442129629629 | 19.179 | 19.251 | 19.262 |
| 0.6426442129629629 | 19.179 | 19.253 | 19.26 |
| 0.6426442129629629 | 19.178 | 19.254 | 19.258 |
| 0.6426442129629629 | 19.178 | 19.255 | 19.257 |
| 0.6426442245370371 | 19.18 | 19.256 | 19.255 |
| 0.6426442245370371 | 19.181 | 19.257 | 19.253 |
| 0.6426442245370371 | 19.181 | 19.258 | 19.251 |
| 0.6426442245370371 | 19.182 | 19.259 | 19.25 |
| 0.6426442245370371 | 19.183 | 19.259 | 19.248 |
| 0.6426442245370371 | 19.185 | 19.26 | 19.247 |
| 0.6426442361111111 | 19.187 | 19.26 | 19.245 |
| 0.6426442361111111 | 19.188 | 19.26 | 19.243 |
| 0.6426442361111111 | 19.19 | 19.26 | 19.242 |
| 0.6426442361111111 | 19.192 | 19.259 | 19.242 |
| 0.6426442361111111 | 19.194 | 19.259 | 19.24 |
| 0.6426442361111111 | 19.195 | 19.258 | 19.238 |
| 0.6426442476851851 | 19.197 | 19.258 | 19.238 |
| 0.6426442476851851 | 19.199 | 19.257 | 19.238 |
| 0.6426442476851851 | 19.201 | 19.256 | 19.238 |
| 0.6426442476851851 | 19.202 | 19.254 | 19.237 |
| 0.6426442476851851 | 19.204 | 19.253 | 19.237 |
| 0.6426442476851851 | 19.206 | 19.252 | 19.237 |
| 0.6426442476851851 | 19.208 | 19.25 | 19.238 |
| 0.6426442592592593 | 19.209 | 19.249 | 19.238 |
| 0.6426442592592593 | 19.21 | 19.247 | 19.238 |
| 0.6426442592592593 | 19.211 | 19.246 | 19.239 |
| 0.6426442592592593 | 19.213 | 19.244 | 19.24 |
| 0.6426442592592593 | 19.214 | 19.242 | 19.241 |
| 0.6426442592592593 | 19.214 | 19.24 | 19.242 |
| 0.6426442708333333 | 19.215 | 19.239 | 19.244 |
| 0.6426442708333333 | 19.215 | 19.237 | 19.245 |
| 0.6426442708333333 | 19.216 | 19.236 | 19.246 |
| 0.6426442708333333 | 19.216 | 19.234 | 19.248 |
| 0.6426442708333333 | 19.216 | 19.233 | 19.25 |
| 0.6426442708333333 | 19.215 | 19.232 | 19.252 |
| 0.6426442708333333 | 19.215 | 19.231 | 19.253 |
| 0.6426442824074073 | 19.215 | 19.23 | 19.254 |
| 0.6426442824074073 | 19.214 | 19.23 | 19.257 |
| 0.6426442824074073 | 19.213 | 19.23 | 19.26 |
| 0.6426442824074073 | 19.212 | 19.229 | 19.261 |
| 0.6426442824074073 | 19.211 | 19.227 | 19.262 |
| 0.6426442824074073 | 19.21 | 19.227 | 19.264 |
| 0.6426442939814815 | 19.209 | 19.229 | 19.266 |
| 0.6426442939814815 | 19.207 | 19.229 | 19.268 |
| 0.6426442939814815 | 19.206 | 19.228 | 19.269 |
| 0.6426442939814815 | 19.204 | 19.227 | 19.27 |
| 0.6426442939814815 | 19.203 | 19.229 | 19.271 |
| 0.6426442939814815 | 19.201 | 19.231 | 19.273 |
| 0.6426443055555556 | 19.199 | 19.232 | 19.274 |
| 0.6426443055555556 | 19.198 | 19.233 | 19.274 |
| 0.6426443055555556 | 19.196 | 19.233 | 19.275 |
| 0.6426443055555556 | 19.195 | 19.235 | 19.275 |
| 0.6426443055555556 | 19.193 | 19.237 | 19.276 |
| 0.6426443055555556 | 19.191 | 19.239 | 19.276 |
| 0.6426443055555556 | 19.191 | 19.24 | 19.276 |
| 0.6426443171296297 | 19.19 | 19.242 | 19.276 |
| 0.6426443171296297 | 19.189 | 19.244 | 19.275 |
| 0.6426443171296297 | 19.188 | 19.246 | 19.275 |
| 0.6426443171296297 | 19.187 | 19.248 | 19.274 |
| 0.6426443171296297 | 19.187 | 19.25 | 19.274 |
| 0.6426443171296297 | 19.186 | 19.251 | 19.273 |
| 0.6426443287037037 | 19.185 | 19.252 | 19.272 |
| 0.6426443287037037 | 19.185 | 19.254 | 19.271 |
| 0.6426443287037037 | 19.186 | 19.256 | 19.269 |
| 0.6426443287037037 | 19.185 | 19.258 | 19.268 |
| 0.6426443287037037 | 19.185 | 19.259 | 19.266 |
| 0.6426443287037037 | 19.186 | 19.261 | 19.265 |
| 0.6426443287037037 | 19.187 | 19.263 | 19.264 |
| 0.6426443402777778 | 19.189 | 19.264 | 19.262 |
| 0.6426443402777778 | 19.189 | 19.265 | 19.26 |
| 0.6426443402777778 | 19.19 | 19.266 | 19.258 |
| 0.6426443402777778 | 19.192 | 19.267 | 19.257 |
| 0.6426443402777778 | 19.195 | 19.268 | 19.255 |
| 0.6426443402777778 | 19.196 | 19.268 | 19.254 |
| 0.6426443518518519 | 19.198 | 19.268 | 19.252 |
| 0.6426443518518519 | 19.2 | 19.268 | 19.251 |
| 0.6426443518518519 | 19.202 | 19.268 | 19.25 |
| 0.6426443518518519 | 19.203 | 19.268 | 19.248 |
| 0.6426443518518519 | 19.204 | 19.267 | 19.247 |
| 0.6426443518518519 | 19.206 | 19.267 | 19.247 |
| 0.6426443634259259 | 19.208 | 19.266 | 19.247 |
| 0.6426443634259259 | 19.209 | 19.266 | 19.246 |
| 0.6426443634259259 | 19.211 | 19.265 | 19.245 |
| 0.6426443634259259 | 19.212 | 19.264 | 19.245 |
| 0.6426443634259259 | 19.214 | 19.263 | 19.246 |
| 0.6426443634259259 | 19.216 | 19.261 | 19.246 |
| 0.6426443634259259 | 19.217 | 19.26 | 19.246 |
| 0.642644375 | 19.219 | 19.259 | 19.246 |
| 0.642644375 | 19.22 | 19.257 | 19.246 |
| 0.642644375 | 19.222 | 19.255 | 19.247 |
| 0.642644375 | 19.223 | 19.253 | 19.248 |
| 0.642644375 | 19.224 | 19.252 | 19.25 |
| 0.642644375 | 19.225 | 19.25 | 19.252 |
| 0.6426443865740741 | 19.225 | 19.248 | 19.253 |
| 0.6426443865740741 | 19.226 | 19.247 | 19.255 |
| 0.6426443865740741 | 19.226 | 19.245 | 19.257 |
| 0.6426443865740741 | 19.226 | 19.244 | 19.259 |
| 0.6426443865740741 | 19.226 | 19.244 | 19.261 |
| 0.6426443865740741 | 19.226 | 19.242 | 19.263 |
| 0.6426443865740741 | 19.226 | 19.241 | 19.264 |
| 0.6426443981481481 | 19.225 | 19.242 | 19.267 |
| 0.6426443981481481 | 19.224 | 19.242 | 19.27 |
| 0.6426443981481481 | 19.224 | 19.24 | 19.271 |
| 0.6426443981481481 | 19.223 | 19.24 | 19.272 |
| 0.6426443981481481 | 19.222 | 19.241 | 19.274 |
| 0.6426443981481481 | 19.221 | 19.242 | 19.277 |
| 0.6426444097222223 | 19.219 | 19.242 | 19.279 |
| 0.6426444097222223 | 19.218 | 19.241 | 19.28 |
| 0.6426444097222223 | 19.216 | 19.241 | 19.281 |
| 0.6426444097222223 | 19.215 | 19.244 | 19.284 |
| 0.6426444097222223 | 19.213 | 19.245 | 19.285 |
| 0.6426444097222223 | 19.211 | 19.246 | 19.287 |
| 0.6426444212962963 | 19.209 | 19.246 | 19.287 |
| 0.6426444212962963 | 19.208 | 19.248 | 19.288 |
| 0.6426444212962963 | 19.206 | 19.25 | 19.289 |
| 0.6426444212962963 | 19.205 | 19.252 | 19.29 |
| 0.6426444212962963 | 19.204 | 19.254 | 19.29 |
| 0.6426444212962963 | 19.203 | 19.255 | 19.29 |
| 0.6426444212962963 | 19.202 | 19.257 | 19.29 |
| 0.6426444328703703 | 19.2 | 19.26 | 19.29 |
| 0.6426444328703703 | 19.2 | 19.261 | 19.29 |
| 0.6426444328703703 | 19.2 | 19.264 | 19.289 |
| 0.6426444328703703 | 19.2 | 19.266 | 19.289 |
| 0.6426444328703703 | 19.199 | 19.267 | 19.288 |
| 0.6426444328703703 | 19.198 | 19.269 | 19.287 |
| 0.6426444444444445 | 19.199 | 19.272 | 19.286 |
| 0.6426444444444445 | 19.2 | 19.274 | 19.285 |
| 0.6426444444444445 | 19.2 | 19.276 | 19.284 |
| 0.6426444444444445 | 19.2 | 19.278 | 19.283 |
| 0.6426444444444445 | 19.202 | 19.28 | 19.281 |
| 0.6426444444444445 | 19.203 | 19.282 | 19.28 |
| 0.6426444444444445 | 19.204 | 19.283 | 19.278 |
| 0.6426444560185185 | 19.205 | 19.284 | 19.277 |
| 0.6426444560185185 | 19.206 | 19.285 | 19.276 |
| 0.6426444560185185 | 19.209 | 19.286 | 19.275 |
| 0.6426444560185185 | 19.211 | 19.287 | 19.274 |
| 0.6426444560185185 | 19.213 | 19.288 | 19.273 |
| 0.6426444560185185 | 19.215 | 19.288 | 19.271 |
| 0.6426444675925925 | 19.217 | 19.288 | 19.271 |
| 0.6426444675925925 | 19.22 | 19.288 | 19.271 |
| 0.6426444675925925 | 19.223 | 19.288 | 19.27 |
| 0.6426444675925925 | 19.224 | 19.288 | 19.27 |
| 0.6426444675925925 | 19.227 | 19.288 | 19.271 |
| 0.6426444675925925 | 19.23 | 19.287 | 19.271 |
| 0.6426444791666667 | 19.232 | 19.286 | 19.271 |
| 0.6426444791666667 | 19.233 | 19.286 | 19.27 |
| 0.6426444791666667 | 19.235 | 19.285 | 19.271 |
| 0.6426444791666667 | 19.238 | 19.284 | 19.272 |
| 0.6426444791666667 | 19.24 | 19.283 | 19.272 |
| 0.6426444791666667 | 19.241 | 19.282 | 19.272 |
| 0.6426444791666667 | 19.242 | 19.28 | 19.272 |
| 0.6426444907407407 | 19.244 | 19.279 | 19.273 |
| 0.6426444907407407 | 19.245 | 19.278 | 19.274 |
| 0.6426444907407407 | 19.247 | 19.277 | 19.275 |
| 0.6426444907407407 | 19.248 | 19.275 | 19.276 |
| 0.6426444907407407 | 19.249 | 19.274 | 19.278 |
| 0.6426444907407407 | 19.249 | 19.273 | 19.28 |
| 0.6426445023148148 | 19.25 | 19.273 | 19.283 |
| 0.6426445023148148 | 19.25 | 19.272 | 19.286 |
| 0.6426445023148148 | 19.251 | 19.272 | 19.288 |
| 0.6426445023148148 | 19.251 | 19.272 | 19.291 |
| 0.6426445023148148 | 19.251 | 19.272 | 19.293 |
| 0.6426445023148148 | 19.251 | 19.272 | 19.296 |
| 0.6426445023148148 | 19.25 | 19.273 | 19.299 |
| 0.6426445138888889 | 19.25 | 19.273 | 19.302 |
| 0.6426445138888889 | 19.249 | 19.272 | 19.302 |
| 0.6426445138888889 | 19.249 | 19.272 | 19.304 |
| 0.6426445138888889 | 19.248 | 19.273 | 19.306 |
| 0.6426445138888889 | 19.248 | 19.274 | 19.308 |
| 0.6426445138888889 | 19.246 | 19.273 | 19.31 |
| 0.642644525462963 | 19.246 | 19.273 | 19.31 |
| 0.642644525462963 | 19.245 | 19.273 | 19.311 |
| 0.642644525462963 | 19.244 | 19.275 | 19.314 |
| 0.642644525462963 | 19.242 | 19.276 | 19.315 |
| 0.642644525462963 | 19.241 | 19.276 | 19.316 |
| 0.642644525462963 | 19.24 | 19.277 | 19.317 |
| 0.6426445370370371 | 19.239 | 19.279 | 19.318 |
| 0.6426445370370371 | 19.238 | 19.282 | 19.319 |
| 0.6426445370370371 | 19.237 | 19.284 | 19.32 |
| 0.6426445370370371 | 19.236 | 19.286 | 19.32 |
| 0.6426445370370371 | 19.236 | 19.288 | 19.32 |
| 0.6426445370370371 | 19.236 | 19.29 | 19.321 |
| 0.6426445370370371 | 19.235 | 19.293 | 19.321 |
| 0.6426445486111111 | 19.234 | 19.295 | 19.321 |
| 0.6426445486111111 | 19.234 | 19.296 | 19.32 |
| 0.6426445486111111 | 19.234 | 19.298 | 19.32 |
| 0.6426445486111111 | 19.233 | 19.299 | 19.32 |
| 0.6426445486111111 | 19.233 | 19.301 | 19.319 |
| 0.6426445486111111 | 19.233 | 19.303 | 19.318 |
| 0.6426445601851852 | 19.234 | 19.305 | 19.318 |
| 0.6426445601851852 | 19.233 | 19.306 | 19.317 |
| 0.6426445601851852 | 19.233 | 19.308 | 19.316 |
| 0.6426445601851852 | 19.234 | 19.309 | 19.315 |
| 0.6426445601851852 | 19.236 | 19.311 | 19.313 |
| 0.6426445601851852 | 19.236 | 19.312 | 19.312 |
| 0.6426445601851852 | 19.236 | 19.313 | 19.311 |
| 0.6426445717592593 | 19.237 | 19.314 | 19.31 |
| 0.6426445717592593 | 19.239 | 19.316 | 19.309 |
| 0.6426445717592593 | 19.241 | 19.316 | 19.308 |
| 0.6426445717592593 | 19.242 | 19.317 | 19.306 |
| 0.6426445717592593 | 19.244 | 19.318 | 19.306 |
| 0.6426445717592593 | 19.246 | 19.318 | 19.305 |
| 0.6426445833333333 | 19.248 | 19.318 | 19.305 |
| 0.6426445833333333 | 19.25 | 19.318 | 19.304 |
| 0.6426445833333333 | 19.251 | 19.318 | 19.303 |
| 0.6426445833333333 | 19.253 | 19.318 | 19.304 |
| 0.6426445833333333 | 19.256 | 19.318 | 19.304 |
| 0.6426445833333333 | 19.258 | 19.317 | 19.303 |
| 0.6426445949074074 | 19.259 | 19.317 | 19.302 |
| 0.6426445949074074 | 19.261 | 19.316 | 19.303 |
| 0.6426445949074074 | 19.263 | 19.315 | 19.304 |
| 0.6426445949074074 | 19.265 | 19.314 | 19.304 |
| 0.6426445949074074 | 19.267 | 19.313 | 19.303 |
| 0.6426445949074074 | 19.268 | 19.312 | 19.304 |
| 0.6426445949074074 | 19.27 | 19.311 | 19.305 |
| 0.6426446064814815 | 19.272 | 19.309 | 19.306 |
| 0.6426446064814815 | 19.273 | 19.308 | 19.307 |
| 0.6426446064814815 | 19.274 | 19.307 | 19.307 |
| 0.6426446064814815 | 19.275 | 19.306 | 19.309 |
| 0.6426446064814815 | 19.276 | 19.305 | 19.311 |
| 0.6426446064814815 | 19.277 | 19.304 | 19.312 |
| 0.6426446180555555 | 19.277 | 19.303 | 19.314 |
| 0.6426446180555555 | 19.278 | 19.303 | 19.316 |
| 0.6426446180555555 | 19.278 | 19.302 | 19.317 |
| 0.6426446180555555 | 19.278 | 19.301 | 19.32 |
| 0.6426446180555555 | 19.278 | 19.301 | 19.322 |
| 0.6426446180555555 | 19.278 | 19.302 | 19.324 |
| 0.6426446180555555 | 19.278 | 19.301 | 19.325 |
| 0.6426446296296296 | 19.277 | 19.3 | 19.326 |
| 0.6426446296296296 | 19.277 | 19.3 | 19.327 |
| 0.6426446296296296 | 19.276 | 19.301 | 19.33 |
| 0.6426446296296296 | 19.276 | 19.301 | 19.332 |
| 0.6426446296296296 | 19.275 | 19.3 | 19.332 |
| 0.6426446296296296 | 19.274 | 19.299 | 19.333 |
| 0.6426446412037037 | 19.273 | 19.299 | 19.335 |
| 0.6426446412037037 | 19.272 | 19.301 | 19.337 |
| 0.6426446412037037 | 19.271 | 19.301 | 19.338 |
| 0.6426446412037037 | 19.27 | 19.301 | 19.339 |
| 0.6426446412037037 | 19.269 | 19.301 | 19.339 |
| 0.6426446412037037 | 19.268 | 19.302 | 19.341 |
| 0.6426446527777777 | 19.267 | 19.304 | 19.342 |
| 0.6426446527777777 | 19.266 | 19.306 | 19.342 |
| 0.6426446527777777 | 19.265 | 19.307 | 19.343 |
| 0.6426446527777777 | 19.264 | 19.308 | 19.343 |
| 0.6426446527777777 | 19.263 | 19.31 | 19.344 |
| 0.6426446527777777 | 19.262 | 19.313 | 19.344 |
| 0.6426446527777777 | 19.262 | 19.314 | 19.344 |
| 0.6426446643518519 | 19.262 | 19.315 | 19.344 |
| 0.6426446643518519 | 19.262 | 19.317 | 19.344 |
| 0.6426446643518519 | 19.261 | 19.318 | 19.343 |
| 0.6426446643518519 | 19.26 | 19.319 | 19.343 |
| 0.6426446643518519 | 19.26 | 19.321 | 19.342 |
| 0.6426446643518519 | 19.26 | 19.322 | 19.342 |
| 0.642644675925926 | 19.259 | 19.323 | 19.341 |
| 0.642644675925926 | 19.258 | 19.324 | 19.34 |
| 0.642644675925926 | 19.258 | 19.326 | 19.339 |
| 0.642644675925926 | 19.258 | 19.327 | 19.338 |
| 0.642644675925926 | 19.257 | 19.328 | 19.336 |
| 0.642644675925926 | 19.257 | 19.329 | 19.335 |
| 0.642644675925926 | 19.258 | 19.33 | 19.334 |
| 0.6426446875 | 19.259 | 19.331 | 19.333 |
| 0.6426446875 | 19.259 | 19.333 | 19.331 |
| 0.6426446875 | 19.259 | 19.333 | 19.329 |
| 0.6426446875 | 19.26 | 19.334 | 19.328 |
| 0.6426446875 | 19.262 | 19.334 | 19.327 |
| 0.6426446875 | 19.264 | 19.335 | 19.326 |
| 0.6426446990740741 | 19.265 | 19.335 | 19.325 |
| 0.6426446990740741 | 19.265 | 19.335 | 19.323 |
| 0.6426446990740741 | 19.267 | 19.335 | 19.323 |
| 0.6426446990740741 | 19.269 | 19.335 | 19.321 |
| 0.6426446990740741 | 19.27 | 19.334 | 19.319 |
| 0.6426446990740741 | 19.27 | 19.334 | 19.318 |
| 0.6426447106481482 | 19.272 | 19.333 | 19.318 |
| 0.6426447106481482 | 19.274 | 19.333 | 19.318 |
| 0.6426447106481482 | 19.275 | 19.332 | 19.316 |
| 0.6426447106481482 | 19.275 | 19.331 | 19.314 |
| 0.6426447106481482 | 19.276 | 19.33 | 19.314 |
| 0.6426447106481482 | 19.278 | 19.329 | 19.315 |
| 0.6426447106481482 | 19.28 | 19.327 | 19.315 |
| 0.6426447222222222 | 19.281 | 19.326 | 19.315 |
| 0.6426447222222222 | 19.282 | 19.325 | 19.315 |
| 0.6426447222222222 | 19.283 | 19.323 | 19.315 |
| 0.6426447222222222 | 19.285 | 19.322 | 19.317 |
| 0.6426447222222222 | 19.286 | 19.32 | 19.318 |
| 0.6426447222222222 | 19.286 | 19.319 | 19.319 |
| 0.6426447337962963 | 19.287 | 19.317 | 19.32 |
| 0.6426447337962963 | 19.287 | 19.316 | 19.321 |
| 0.6426447337962963 | 19.288 | 19.314 | 19.323 |
| 0.6426447337962963 | 19.288 | 19.313 | 19.324 |
| 0.6426447337962963 | 19.288 | 19.312 | 19.325 |
| 0.6426447337962963 | 19.288 | 19.31 | 19.326 |
| 0.6426447337962963 | 19.287 | 19.308 | 19.326 |
| 0.6426447453703704 | 19.287 | 19.307 | 19.327 |
| 0.6426447453703704 | 19.286 | 19.307 | 19.329 |
| 0.6426447453703704 | 19.286 | 19.305 | 19.331 |
| 0.6426447453703704 | 19.285 | 19.304 | 19.331 |
| 0.6426447453703704 | 19.284 | 19.303 | 19.332 |
| 0.6426447453703704 | 19.283 | 19.304 | 19.334 |
| 0.6426447569444445 | 19.282 | 19.304 | 19.337 |
| 0.6426447569444445 | 19.28 | 19.303 | 19.338 |
| 0.6426447569444445 | 19.279 | 19.302 | 19.339 |
| 0.6426447569444445 | 19.277 | 19.303 | 19.34 |
| 0.6426447569444445 | 19.276 | 19.304 | 19.342 |
| 0.6426447569444445 | 19.274 | 19.306 | 19.343 |
| 0.6426447685185185 | 19.272 | 19.305 | 19.344 |
| 0.6426447685185185 | 19.271 | 19.305 | 19.345 |
| 0.6426447685185185 | 19.269 | 19.307 | 19.345 |
| 0.6426447685185185 | 19.268 | 19.309 | 19.346 |
| 0.6426447685185185 | 19.267 | 19.31 | 19.346 |
| 0.6426447685185185 | 19.266 | 19.311 | 19.346 |
| 0.6426447685185185 | 19.265 | 19.311 | 19.346 |
| 0.6426447800925926 | 19.263 | 19.313 | 19.346 |
| 0.6426447800925926 | 19.262 | 19.315 | 19.346 |
| 0.6426447800925926 | 19.261 | 19.316 | 19.346 |
| 0.6426447800925926 | 19.26 | 19.318 | 19.345 |
| 0.6426447800925926 | 19.26 | 19.319 | 19.345 |
| 0.6426447800925926 | 19.259 | 19.32 | 19.344 |
| 0.6426447916666667 | 19.258 | 19.322 | 19.343 |
| 0.6426447916666667 | 19.258 | 19.323 | 19.342 |
| 0.6426447916666667 | 19.258 | 19.325 | 19.341 |
| 0.6426447916666667 | 19.257 | 19.326 | 19.34 |
| 0.6426447916666667 | 19.257 | 19.327 | 19.338 |
| 0.6426447916666667 | 19.257 | 19.329 | 19.337 |
| 0.6426447916666667 | 19.258 | 19.33 | 19.335 |
| 0.6426448032407407 | 19.258 | 19.331 | 19.333 |
| 0.6426448032407407 | 19.259 | 19.332 | 19.332 |
| 0.6426448032407407 | 19.26 | 19.333 | 19.331 |
| 0.6426448032407407 | 19.261 | 19.334 | 19.329 |
| 0.6426448032407407 | 19.262 | 19.334 | 19.328 |
| 0.6426448032407407 | 19.262 | 19.335 | 19.326 |
| 0.6426448148148148 | 19.263 | 19.335 | 19.324 |
| 0.6426448148148148 | 19.265 | 19.335 | 19.324 |
| 0.6426448148148148 | 19.267 | 19.335 | 19.323 |
| 0.6426448148148148 | 19.268 | 19.335 | 19.321 |
| 0.6426448148148148 | 19.269 | 19.334 | 19.32 |
| 0.6426448148148148 | 19.272 | 19.334 | 19.32 |
| 0.6426448263888889 | 19.273 | 19.333 | 19.319 |
| 0.6426448263888889 | 19.274 | 19.333 | 19.318 |
| 0.6426448263888889 | 19.275 | 19.332 | 19.317 |
| 0.6426448263888889 | 19.276 | 19.331 | 19.317 |
| 0.6426448263888889 | 19.278 | 19.33 | 19.317 |
| 0.6426448263888889 | 19.28 | 19.329 | 19.316 |
| 0.6426448263888889 | 19.28 | 19.327 | 19.315 |
| 0.6426448379629629 | 19.281 | 19.326 | 19.315 |
| 0.6426448379629629 | 19.283 | 19.325 | 19.316 |
| 0.6426448379629629 | 19.284 | 19.323 | 19.316 |
| 0.6426448379629629 | 19.285 | 19.322 | 19.316 |
| 0.6426448379629629 | 19.286 | 19.32 | 19.316 |
| 0.6426448379629629 | 19.286 | 19.319 | 19.317 |
| 0.642644849537037 | 19.287 | 19.317 | 19.319 |
| 0.642644849537037 | 19.287 | 19.316 | 19.32 |
| 0.642644849537037 | 19.288 | 19.314 | 19.322 |
| 0.642644849537037 | 19.288 | 19.314 | 19.323 |
| 0.642644849537037 | 19.288 | 19.312 | 19.324 |
| 0.642644849537037 | 19.288 | 19.311 | 19.325 |
| 0.642644849537037 | 19.287 | 19.31 | 19.327 |
| 0.6426448611111111 | 19.287 | 19.31 | 19.329 |
| 0.6426448611111111 | 19.286 | 19.309 | 19.33 |
| 0.6426448611111111 | 19.286 | 19.307 | 19.331 |
| 0.6426448611111111 | 19.285 | 19.306 | 19.332 |
| 0.6426448611111111 | 19.284 | 19.306 | 19.334 |
| 0.6426448611111111 | 19.283 | 19.306 | 19.336 |
| 0.6426448726851852 | 19.282 | 19.304 | 19.336 |
| 0.6426448726851852 | 19.281 | 19.303 | 19.337 |
| 0.6426448726851852 | 19.28 | 19.303 | 19.338 |
| 0.6426448726851852 | 19.278 | 19.304 | 19.34 |
| 0.6426448726851852 | 19.276 | 19.304 | 19.341 |
| 0.6426448726851852 | 19.274 | 19.303 | 19.342 |
| 0.6426448842592593 | 19.273 | 19.303 | 19.343 |
| 0.6426448842592593 | 19.272 | 19.305 | 19.343 |
| 0.6426448842592593 | 19.27 | 19.307 | 19.344 |
| 0.6426448842592593 | 19.269 | 19.308 | 19.345 |
| 0.6426448842592593 | 19.267 | 19.308 | 19.345 |
| 0.6426448842592593 | 19.266 | 19.309 | 19.345 |
| 0.6426448842592593 | 19.265 | 19.311 | 19.345 |
| 0.6426448958333334 | 19.263 | 19.313 | 19.345 |
| 0.6426448958333334 | 19.261 | 19.314 | 19.345 |
| 0.6426448958333334 | 19.26 | 19.315 | 19.345 |
| 0.6426448958333334 | 19.259 | 19.317 | 19.344 |
| 0.6426448958333334 | 19.258 | 19.318 | 19.344 |
| 0.6426448958333334 | 19.257 | 19.319 | 19.343 |
| 0.6426449074074074 | 19.256 | 19.32 | 19.342 |
| 0.6426449074074074 | 19.256 | 19.321 | 19.341 |
| 0.6426449074074074 | 19.255 | 19.322 | 19.34 |
| 0.6426449074074074 | 19.254 | 19.323 | 19.339 |
| 0.6426449074074074 | 19.254 | 19.325 | 19.338 |
| 0.6426449074074074 | 19.255 | 19.327 | 19.336 |
| 0.6426449074074074 | 19.255 | 19.328 | 19.334 |
| 0.6426449189814815 | 19.255 | 19.329 | 19.333 |
| 0.6426449189814815 | 19.255 | 19.33 | 19.332 |
| 0.6426449189814815 | 19.256 | 19.331 | 19.33 |
| 0.6426449189814815 | 19.257 | 19.331 | 19.328 |
| 0.6426449189814815 | 19.258 | 19.332 | 19.327 |
| 0.6426449189814815 | 19.26 | 19.332 | 19.325 |
| 0.6426449305555556 | 19.261 | 19.333 | 19.324 |
| 0.6426449305555556 | 19.263 | 19.333 | 19.323 |
| 0.6426449305555556 | 19.264 | 19.333 | 19.321 |
| 0.6426449305555556 | 19.265 | 19.333 | 19.32 |
| 0.6426449305555556 | 19.267 | 19.332 | 19.32 |
| 0.6426449305555556 | 19.269 | 19.332 | 19.319 |